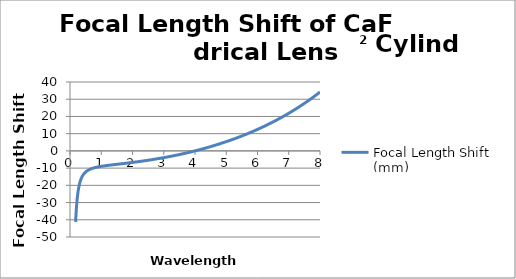
| Category | Focal Length Shift (mm) |
|---|---|
| 0.18 | -41.324 |
| 0.181 | -40.922 |
| 0.182 | -40.527 |
| 0.183 | -40.14 |
| 0.184 | -39.76 |
| 0.185 | -39.388 |
| 0.186 | -39.022 |
| 0.187 | -38.663 |
| 0.188 | -38.31 |
| 0.189 | -37.964 |
| 0.19 | -37.624 |
| 0.191 | -37.29 |
| 0.192 | -36.963 |
| 0.193 | -36.641 |
| 0.194 | -36.324 |
| 0.195 | -36.013 |
| 0.196 | -35.708 |
| 0.197 | -35.408 |
| 0.198 | -35.112 |
| 0.199 | -34.822 |
| 0.2 | -34.537 |
| 0.201 | -34.257 |
| 0.202 | -33.981 |
| 0.203 | -33.71 |
| 0.204 | -33.443 |
| 0.205 | -33.18 |
| 0.206 | -32.922 |
| 0.207 | -32.668 |
| 0.208 | -32.418 |
| 0.209 | -32.172 |
| 0.21 | -31.93 |
| 0.211 | -31.692 |
| 0.212 | -31.457 |
| 0.213 | -31.226 |
| 0.214 | -30.999 |
| 0.215 | -30.775 |
| 0.216 | -30.554 |
| 0.217 | -30.337 |
| 0.218 | -30.123 |
| 0.219 | -29.913 |
| 0.22 | -29.705 |
| 0.221 | -29.501 |
| 0.222 | -29.299 |
| 0.223 | -29.101 |
| 0.224 | -28.905 |
| 0.225 | -28.712 |
| 0.226 | -28.523 |
| 0.227 | -28.335 |
| 0.228 | -28.151 |
| 0.229 | -27.969 |
| 0.23 | -27.789 |
| 0.231 | -27.612 |
| 0.232 | -27.438 |
| 0.233 | -27.266 |
| 0.234 | -27.096 |
| 0.235 | -26.929 |
| 0.236 | -26.764 |
| 0.237 | -26.602 |
| 0.238 | -26.441 |
| 0.239 | -26.282 |
| 0.24 | -26.126 |
| 0.241 | -25.972 |
| 0.242 | -25.82 |
| 0.243 | -25.67 |
| 0.244 | -25.522 |
| 0.245 | -25.376 |
| 0.246 | -25.231 |
| 0.247 | -25.089 |
| 0.248 | -24.948 |
| 0.249 | -24.809 |
| 0.25 | -24.672 |
| 0.251 | -24.537 |
| 0.252 | -24.404 |
| 0.253 | -24.272 |
| 0.254 | -24.142 |
| 0.255 | -24.013 |
| 0.256 | -23.886 |
| 0.257 | -23.76 |
| 0.258 | -23.637 |
| 0.259 | -23.514 |
| 0.26 | -23.393 |
| 0.261 | -23.274 |
| 0.262 | -23.156 |
| 0.263 | -23.04 |
| 0.264 | -22.924 |
| 0.265 | -22.811 |
| 0.266 | -22.698 |
| 0.267 | -22.587 |
| 0.268 | -22.477 |
| 0.269 | -22.369 |
| 0.27 | -22.262 |
| 0.271 | -22.156 |
| 0.272 | -22.051 |
| 0.273 | -21.947 |
| 0.274 | -21.845 |
| 0.275 | -21.744 |
| 0.276 | -21.644 |
| 0.277 | -21.545 |
| 0.278 | -21.447 |
| 0.279 | -21.35 |
| 0.28 | -21.255 |
| 0.281 | -21.16 |
| 0.282 | -21.067 |
| 0.283 | -20.974 |
| 0.284 | -20.883 |
| 0.285 | -20.793 |
| 0.286 | -20.703 |
| 0.287 | -20.615 |
| 0.288 | -20.527 |
| 0.289 | -20.441 |
| 0.29 | -20.355 |
| 0.291 | -20.271 |
| 0.292 | -20.187 |
| 0.293 | -20.104 |
| 0.294 | -20.022 |
| 0.295 | -19.941 |
| 0.296 | -19.86 |
| 0.297 | -19.781 |
| 0.298 | -19.702 |
| 0.299 | -19.625 |
| 0.3 | -19.548 |
| 0.301 | -19.472 |
| 0.302 | -19.396 |
| 0.303 | -19.321 |
| 0.304 | -19.248 |
| 0.305 | -19.174 |
| 0.306 | -19.102 |
| 0.307 | -19.03 |
| 0.308 | -18.96 |
| 0.309 | -18.889 |
| 0.31 | -18.82 |
| 0.311 | -18.751 |
| 0.312 | -18.683 |
| 0.313 | -18.615 |
| 0.314 | -18.549 |
| 0.315 | -18.482 |
| 0.316 | -18.417 |
| 0.317 | -18.352 |
| 0.318 | -18.288 |
| 0.319 | -18.224 |
| 0.32 | -18.161 |
| 0.321 | -18.099 |
| 0.322 | -18.037 |
| 0.323 | -17.976 |
| 0.324 | -17.915 |
| 0.325 | -17.855 |
| 0.326 | -17.796 |
| 0.327 | -17.737 |
| 0.328 | -17.679 |
| 0.329 | -17.621 |
| 0.33 | -17.564 |
| 0.331 | -17.507 |
| 0.332 | -17.451 |
| 0.333 | -17.395 |
| 0.334 | -17.34 |
| 0.335 | -17.285 |
| 0.336 | -17.231 |
| 0.337 | -17.177 |
| 0.338 | -17.124 |
| 0.339 | -17.071 |
| 0.34 | -17.019 |
| 0.341 | -16.967 |
| 0.342 | -16.916 |
| 0.343 | -16.865 |
| 0.344 | -16.815 |
| 0.345 | -16.765 |
| 0.346 | -16.715 |
| 0.347 | -16.666 |
| 0.348 | -16.618 |
| 0.349 | -16.57 |
| 0.35 | -16.522 |
| 0.351 | -16.474 |
| 0.352 | -16.427 |
| 0.353 | -16.381 |
| 0.354 | -16.335 |
| 0.355 | -16.289 |
| 0.356 | -16.244 |
| 0.357 | -16.199 |
| 0.358 | -16.154 |
| 0.359 | -16.11 |
| 0.36 | -16.066 |
| 0.361 | -16.023 |
| 0.362 | -15.98 |
| 0.363 | -15.937 |
| 0.364 | -15.894 |
| 0.365 | -15.852 |
| 0.366 | -15.811 |
| 0.367 | -15.769 |
| 0.368 | -15.728 |
| 0.369 | -15.688 |
| 0.37 | -15.648 |
| 0.371 | -15.608 |
| 0.372 | -15.568 |
| 0.373 | -15.528 |
| 0.374 | -15.49 |
| 0.375 | -15.451 |
| 0.376 | -15.412 |
| 0.377 | -15.374 |
| 0.378 | -15.336 |
| 0.379 | -15.299 |
| 0.38 | -15.262 |
| 0.381 | -15.225 |
| 0.382 | -15.188 |
| 0.383 | -15.152 |
| 0.384 | -15.116 |
| 0.385 | -15.08 |
| 0.386 | -15.045 |
| 0.387 | -15.01 |
| 0.388 | -14.975 |
| 0.389 | -14.94 |
| 0.39 | -14.906 |
| 0.391 | -14.872 |
| 0.392 | -14.838 |
| 0.393 | -14.804 |
| 0.394 | -14.771 |
| 0.395 | -14.738 |
| 0.396 | -14.705 |
| 0.397 | -14.673 |
| 0.398 | -14.64 |
| 0.399 | -14.608 |
| 0.4 | -14.577 |
| 0.401 | -14.545 |
| 0.402 | -14.514 |
| 0.403 | -14.483 |
| 0.404 | -14.452 |
| 0.405 | -14.421 |
| 0.406 | -14.391 |
| 0.407 | -14.36 |
| 0.408 | -14.33 |
| 0.409 | -14.301 |
| 0.41 | -14.271 |
| 0.411 | -14.242 |
| 0.412 | -14.213 |
| 0.413 | -14.184 |
| 0.414 | -14.155 |
| 0.415 | -14.127 |
| 0.416 | -14.098 |
| 0.417 | -14.07 |
| 0.418 | -14.042 |
| 0.419 | -14.015 |
| 0.42 | -13.987 |
| 0.421 | -13.96 |
| 0.422 | -13.933 |
| 0.423 | -13.906 |
| 0.424 | -13.88 |
| 0.425 | -13.853 |
| 0.426 | -13.827 |
| 0.427 | -13.8 |
| 0.428 | -13.774 |
| 0.429 | -13.749 |
| 0.43 | -13.723 |
| 0.431 | -13.698 |
| 0.432 | -13.672 |
| 0.433 | -13.647 |
| 0.434 | -13.622 |
| 0.435 | -13.598 |
| 0.436 | -13.573 |
| 0.437 | -13.549 |
| 0.438 | -13.525 |
| 0.439 | -13.501 |
| 0.44 | -13.477 |
| 0.441 | -13.453 |
| 0.442 | -13.429 |
| 0.443 | -13.406 |
| 0.444 | -13.383 |
| 0.445 | -13.36 |
| 0.446 | -13.337 |
| 0.447 | -13.314 |
| 0.448 | -13.291 |
| 0.449 | -13.269 |
| 0.45 | -13.246 |
| 0.451 | -13.224 |
| 0.452 | -13.202 |
| 0.453 | -13.18 |
| 0.454 | -13.158 |
| 0.455 | -13.137 |
| 0.456 | -13.115 |
| 0.457 | -13.094 |
| 0.458 | -13.073 |
| 0.459 | -13.052 |
| 0.46 | -13.031 |
| 0.461 | -13.01 |
| 0.462 | -12.989 |
| 0.463 | -12.969 |
| 0.464 | -12.948 |
| 0.465 | -12.928 |
| 0.466 | -12.908 |
| 0.467 | -12.888 |
| 0.468 | -12.868 |
| 0.469 | -12.848 |
| 0.47 | -12.829 |
| 0.471 | -12.809 |
| 0.472 | -12.79 |
| 0.473 | -12.77 |
| 0.474 | -12.751 |
| 0.475 | -12.732 |
| 0.476 | -12.713 |
| 0.477 | -12.694 |
| 0.478 | -12.676 |
| 0.479 | -12.657 |
| 0.48 | -12.639 |
| 0.481 | -12.62 |
| 0.482 | -12.602 |
| 0.483 | -12.584 |
| 0.484 | -12.566 |
| 0.485 | -12.548 |
| 0.486 | -12.53 |
| 0.487 | -12.513 |
| 0.488 | -12.495 |
| 0.489 | -12.478 |
| 0.49 | -12.46 |
| 0.491 | -12.443 |
| 0.492 | -12.426 |
| 0.493 | -12.409 |
| 0.494 | -12.392 |
| 0.495 | -12.375 |
| 0.496 | -12.358 |
| 0.497 | -12.341 |
| 0.498 | -12.325 |
| 0.499 | -12.308 |
| 0.5 | -12.292 |
| 0.501 | -12.276 |
| 0.502 | -12.259 |
| 0.503 | -12.243 |
| 0.504 | -12.227 |
| 0.505 | -12.211 |
| 0.506 | -12.196 |
| 0.507 | -12.18 |
| 0.508 | -12.164 |
| 0.509 | -12.149 |
| 0.51 | -12.133 |
| 0.511 | -12.118 |
| 0.512 | -12.103 |
| 0.513 | -12.087 |
| 0.514 | -12.072 |
| 0.515 | -12.057 |
| 0.516 | -12.042 |
| 0.517 | -12.027 |
| 0.518 | -12.013 |
| 0.519 | -11.998 |
| 0.52 | -11.983 |
| 0.521 | -11.969 |
| 0.522 | -11.954 |
| 0.523 | -11.94 |
| 0.524 | -11.926 |
| 0.525 | -11.912 |
| 0.526 | -11.897 |
| 0.527 | -11.883 |
| 0.528 | -11.869 |
| 0.529 | -11.855 |
| 0.53 | -11.842 |
| 0.531 | -11.828 |
| 0.532 | -11.814 |
| 0.533 | -11.8 |
| 0.534 | -11.787 |
| 0.535 | -11.774 |
| 0.536 | -11.76 |
| 0.537 | -11.747 |
| 0.538 | -11.734 |
| 0.539 | -11.72 |
| 0.54 | -11.707 |
| 0.541 | -11.694 |
| 0.542 | -11.681 |
| 0.543 | -11.668 |
| 0.544 | -11.656 |
| 0.545 | -11.643 |
| 0.546 | -11.63 |
| 0.547 | -11.618 |
| 0.548 | -11.605 |
| 0.549 | -11.592 |
| 0.55 | -11.58 |
| 0.551 | -11.568 |
| 0.552 | -11.555 |
| 0.553 | -11.543 |
| 0.554 | -11.531 |
| 0.555 | -11.519 |
| 0.556 | -11.507 |
| 0.557 | -11.495 |
| 0.558 | -11.483 |
| 0.559 | -11.471 |
| 0.56 | -11.459 |
| 0.561 | -11.447 |
| 0.562 | -11.436 |
| 0.563 | -11.424 |
| 0.564 | -11.412 |
| 0.565 | -11.401 |
| 0.566 | -11.39 |
| 0.567 | -11.378 |
| 0.568 | -11.367 |
| 0.569 | -11.355 |
| 0.57 | -11.344 |
| 0.571 | -11.333 |
| 0.572 | -11.322 |
| 0.573 | -11.311 |
| 0.574 | -11.3 |
| 0.575 | -11.289 |
| 0.576 | -11.278 |
| 0.577 | -11.267 |
| 0.578 | -11.256 |
| 0.579 | -11.246 |
| 0.58 | -11.235 |
| 0.581 | -11.224 |
| 0.582 | -11.214 |
| 0.583 | -11.203 |
| 0.584 | -11.193 |
| 0.585 | -11.182 |
| 0.586 | -11.172 |
| 0.587 | -11.161 |
| 0.588 | -11.151 |
| 0.589 | -11.141 |
| 0.59 | -11.131 |
| 0.591 | -11.12 |
| 0.592 | -11.11 |
| 0.593 | -11.1 |
| 0.594 | -11.09 |
| 0.595 | -11.08 |
| 0.596 | -11.07 |
| 0.597 | -11.061 |
| 0.598 | -11.051 |
| 0.599 | -11.041 |
| 0.6 | -11.031 |
| 0.601 | -11.022 |
| 0.602 | -11.012 |
| 0.603 | -11.002 |
| 0.604 | -10.993 |
| 0.605 | -10.983 |
| 0.606 | -10.974 |
| 0.607 | -10.964 |
| 0.608 | -10.955 |
| 0.609 | -10.946 |
| 0.61 | -10.936 |
| 0.611 | -10.927 |
| 0.612 | -10.918 |
| 0.613 | -10.909 |
| 0.614 | -10.9 |
| 0.615 | -10.891 |
| 0.616 | -10.882 |
| 0.617 | -10.873 |
| 0.618 | -10.864 |
| 0.619 | -10.855 |
| 0.62 | -10.846 |
| 0.621 | -10.837 |
| 0.622 | -10.828 |
| 0.623 | -10.819 |
| 0.624 | -10.811 |
| 0.625 | -10.802 |
| 0.626 | -10.793 |
| 0.627 | -10.785 |
| 0.628 | -10.776 |
| 0.629 | -10.768 |
| 0.63 | -10.759 |
| 0.631 | -10.751 |
| 0.632 | -10.742 |
| 0.633 | -10.734 |
| 0.634 | -10.725 |
| 0.635 | -10.717 |
| 0.636 | -10.709 |
| 0.637 | -10.7 |
| 0.638 | -10.692 |
| 0.639 | -10.684 |
| 0.64 | -10.676 |
| 0.641 | -10.668 |
| 0.642 | -10.66 |
| 0.643 | -10.652 |
| 0.644 | -10.644 |
| 0.645 | -10.636 |
| 0.646 | -10.628 |
| 0.647 | -10.62 |
| 0.648 | -10.612 |
| 0.649 | -10.604 |
| 0.65 | -10.596 |
| 0.651 | -10.589 |
| 0.652 | -10.581 |
| 0.653 | -10.573 |
| 0.654 | -10.565 |
| 0.655 | -10.558 |
| 0.656 | -10.55 |
| 0.657 | -10.543 |
| 0.658 | -10.535 |
| 0.659 | -10.528 |
| 0.66 | -10.52 |
| 0.661 | -10.512 |
| 0.662 | -10.505 |
| 0.663 | -10.498 |
| 0.664 | -10.49 |
| 0.665 | -10.483 |
| 0.666 | -10.476 |
| 0.667 | -10.468 |
| 0.668 | -10.461 |
| 0.669 | -10.454 |
| 0.67 | -10.447 |
| 0.671 | -10.439 |
| 0.672 | -10.432 |
| 0.673 | -10.425 |
| 0.674 | -10.418 |
| 0.675 | -10.411 |
| 0.676 | -10.404 |
| 0.677 | -10.397 |
| 0.678 | -10.39 |
| 0.679 | -10.383 |
| 0.68 | -10.376 |
| 0.681 | -10.369 |
| 0.682 | -10.362 |
| 0.683 | -10.355 |
| 0.684 | -10.349 |
| 0.685 | -10.342 |
| 0.686 | -10.335 |
| 0.687 | -10.328 |
| 0.688 | -10.322 |
| 0.689 | -10.315 |
| 0.69 | -10.308 |
| 0.691 | -10.302 |
| 0.692 | -10.295 |
| 0.693 | -10.288 |
| 0.694 | -10.282 |
| 0.695 | -10.275 |
| 0.696 | -10.269 |
| 0.697 | -10.262 |
| 0.698 | -10.256 |
| 0.699 | -10.249 |
| 0.7 | -10.243 |
| 0.701 | -10.236 |
| 0.702 | -10.23 |
| 0.703 | -10.224 |
| 0.704 | -10.217 |
| 0.705 | -10.211 |
| 0.706 | -10.205 |
| 0.707 | -10.198 |
| 0.708 | -10.192 |
| 0.709 | -10.186 |
| 0.71 | -10.18 |
| 0.711 | -10.174 |
| 0.712 | -10.168 |
| 0.713 | -10.161 |
| 0.714 | -10.155 |
| 0.715 | -10.149 |
| 0.716 | -10.143 |
| 0.717 | -10.137 |
| 0.718 | -10.131 |
| 0.719 | -10.125 |
| 0.72 | -10.119 |
| 0.721 | -10.113 |
| 0.722 | -10.107 |
| 0.723 | -10.101 |
| 0.724 | -10.095 |
| 0.725 | -10.09 |
| 0.726 | -10.084 |
| 0.727 | -10.078 |
| 0.728 | -10.072 |
| 0.729 | -10.066 |
| 0.73 | -10.06 |
| 0.731 | -10.055 |
| 0.732 | -10.049 |
| 0.733 | -10.043 |
| 0.734 | -10.038 |
| 0.735 | -10.032 |
| 0.736 | -10.026 |
| 0.737 | -10.02 |
| 0.738 | -10.015 |
| 0.739 | -10.009 |
| 0.74 | -10.004 |
| 0.741 | -9.998 |
| 0.742 | -9.993 |
| 0.743 | -9.987 |
| 0.744 | -9.982 |
| 0.745 | -9.976 |
| 0.746 | -9.971 |
| 0.747 | -9.965 |
| 0.748 | -9.96 |
| 0.749 | -9.954 |
| 0.75 | -9.949 |
| 0.751 | -9.944 |
| 0.752 | -9.938 |
| 0.753 | -9.933 |
| 0.754 | -9.927 |
| 0.755 | -9.922 |
| 0.756 | -9.917 |
| 0.757 | -9.912 |
| 0.758 | -9.906 |
| 0.759 | -9.901 |
| 0.76 | -9.896 |
| 0.761 | -9.891 |
| 0.762 | -9.885 |
| 0.763 | -9.88 |
| 0.764 | -9.875 |
| 0.765 | -9.87 |
| 0.766 | -9.865 |
| 0.767 | -9.86 |
| 0.768 | -9.855 |
| 0.769 | -9.85 |
| 0.77 | -9.844 |
| 0.771 | -9.839 |
| 0.772 | -9.834 |
| 0.773 | -9.829 |
| 0.774 | -9.824 |
| 0.775 | -9.819 |
| 0.776 | -9.814 |
| 0.777 | -9.809 |
| 0.778 | -9.804 |
| 0.779 | -9.8 |
| 0.78 | -9.795 |
| 0.781 | -9.79 |
| 0.782 | -9.785 |
| 0.783 | -9.78 |
| 0.784 | -9.775 |
| 0.785 | -9.77 |
| 0.786 | -9.765 |
| 0.787 | -9.761 |
| 0.788 | -9.756 |
| 0.789 | -9.751 |
| 0.79 | -9.746 |
| 0.791 | -9.742 |
| 0.792 | -9.737 |
| 0.793 | -9.732 |
| 0.794 | -9.727 |
| 0.795 | -9.723 |
| 0.796 | -9.718 |
| 0.797 | -9.713 |
| 0.798 | -9.709 |
| 0.799 | -9.704 |
| 0.8 | -9.699 |
| 0.801 | -9.695 |
| 0.802 | -9.69 |
| 0.803 | -9.686 |
| 0.804 | -9.681 |
| 0.805 | -9.676 |
| 0.806 | -9.672 |
| 0.807 | -9.667 |
| 0.808 | -9.663 |
| 0.809 | -9.658 |
| 0.81 | -9.654 |
| 0.811 | -9.649 |
| 0.812 | -9.645 |
| 0.813 | -9.64 |
| 0.814 | -9.636 |
| 0.815 | -9.632 |
| 0.816 | -9.627 |
| 0.817 | -9.623 |
| 0.818 | -9.618 |
| 0.819 | -9.614 |
| 0.82 | -9.61 |
| 0.821 | -9.605 |
| 0.822 | -9.601 |
| 0.823 | -9.596 |
| 0.824 | -9.592 |
| 0.825 | -9.588 |
| 0.826 | -9.584 |
| 0.827 | -9.579 |
| 0.828 | -9.575 |
| 0.829 | -9.571 |
| 0.83 | -9.566 |
| 0.831 | -9.562 |
| 0.832 | -9.558 |
| 0.833 | -9.554 |
| 0.834 | -9.55 |
| 0.835 | -9.545 |
| 0.836 | -9.541 |
| 0.837 | -9.537 |
| 0.838 | -9.533 |
| 0.839 | -9.529 |
| 0.84 | -9.524 |
| 0.841 | -9.52 |
| 0.842 | -9.516 |
| 0.843 | -9.512 |
| 0.844 | -9.508 |
| 0.845 | -9.504 |
| 0.846 | -9.5 |
| 0.847 | -9.496 |
| 0.848 | -9.492 |
| 0.849 | -9.488 |
| 0.85 | -9.484 |
| 0.851 | -9.48 |
| 0.852 | -9.476 |
| 0.853 | -9.472 |
| 0.854 | -9.468 |
| 0.855 | -9.464 |
| 0.856 | -9.46 |
| 0.857 | -9.456 |
| 0.858 | -9.452 |
| 0.859 | -9.448 |
| 0.86 | -9.444 |
| 0.861 | -9.44 |
| 0.862 | -9.436 |
| 0.863 | -9.432 |
| 0.864 | -9.428 |
| 0.865 | -9.424 |
| 0.866 | -9.42 |
| 0.867 | -9.416 |
| 0.868 | -9.412 |
| 0.869 | -9.409 |
| 0.87 | -9.405 |
| 0.871 | -9.401 |
| 0.872 | -9.397 |
| 0.873 | -9.393 |
| 0.874 | -9.39 |
| 0.875 | -9.386 |
| 0.876 | -9.382 |
| 0.877 | -9.378 |
| 0.878 | -9.374 |
| 0.879 | -9.371 |
| 0.88 | -9.367 |
| 0.881 | -9.363 |
| 0.882 | -9.359 |
| 0.883 | -9.356 |
| 0.884 | -9.352 |
| 0.885 | -9.348 |
| 0.886 | -9.344 |
| 0.887 | -9.341 |
| 0.888 | -9.337 |
| 0.889 | -9.333 |
| 0.89 | -9.33 |
| 0.891 | -9.326 |
| 0.892 | -9.322 |
| 0.893 | -9.319 |
| 0.894 | -9.315 |
| 0.895 | -9.312 |
| 0.896 | -9.308 |
| 0.897 | -9.304 |
| 0.898 | -9.301 |
| 0.899 | -9.297 |
| 0.9 | -9.294 |
| 0.901 | -9.29 |
| 0.902 | -9.286 |
| 0.903 | -9.283 |
| 0.904 | -9.279 |
| 0.905 | -9.276 |
| 0.906 | -9.272 |
| 0.907 | -9.268 |
| 0.908 | -9.265 |
| 0.909 | -9.262 |
| 0.91 | -9.258 |
| 0.911 | -9.254 |
| 0.912 | -9.251 |
| 0.913 | -9.248 |
| 0.914 | -9.244 |
| 0.915 | -9.24 |
| 0.916 | -9.237 |
| 0.917 | -9.234 |
| 0.918 | -9.23 |
| 0.919 | -9.227 |
| 0.92 | -9.223 |
| 0.921 | -9.22 |
| 0.922 | -9.216 |
| 0.923 | -9.213 |
| 0.924 | -9.21 |
| 0.925 | -9.206 |
| 0.926 | -9.203 |
| 0.927 | -9.199 |
| 0.928 | -9.196 |
| 0.929 | -9.193 |
| 0.93 | -9.189 |
| 0.931 | -9.186 |
| 0.932 | -9.183 |
| 0.933 | -9.179 |
| 0.934 | -9.176 |
| 0.935 | -9.173 |
| 0.936 | -9.169 |
| 0.937 | -9.166 |
| 0.938 | -9.163 |
| 0.939 | -9.159 |
| 0.94 | -9.156 |
| 0.941 | -9.153 |
| 0.942 | -9.149 |
| 0.943 | -9.146 |
| 0.944 | -9.143 |
| 0.945 | -9.14 |
| 0.946 | -9.136 |
| 0.947 | -9.133 |
| 0.948 | -9.13 |
| 0.949 | -9.127 |
| 0.95 | -9.123 |
| 0.951 | -9.12 |
| 0.952 | -9.117 |
| 0.953 | -9.114 |
| 0.954 | -9.11 |
| 0.955 | -9.107 |
| 0.956 | -9.104 |
| 0.957 | -9.101 |
| 0.958 | -9.098 |
| 0.959 | -9.094 |
| 0.96 | -9.091 |
| 0.961 | -9.088 |
| 0.962 | -9.085 |
| 0.963 | -9.082 |
| 0.964 | -9.079 |
| 0.965 | -9.076 |
| 0.966 | -9.072 |
| 0.967 | -9.069 |
| 0.968 | -9.066 |
| 0.969 | -9.063 |
| 0.97 | -9.06 |
| 0.971 | -9.057 |
| 0.972 | -9.054 |
| 0.973 | -9.05 |
| 0.974 | -9.047 |
| 0.975 | -9.044 |
| 0.976 | -9.041 |
| 0.977 | -9.038 |
| 0.978 | -9.035 |
| 0.979 | -9.032 |
| 0.98 | -9.029 |
| 0.981 | -9.026 |
| 0.982 | -9.023 |
| 0.983 | -9.02 |
| 0.984 | -9.017 |
| 0.985 | -9.014 |
| 0.986 | -9.011 |
| 0.987 | -9.008 |
| 0.988 | -9.005 |
| 0.989 | -9.002 |
| 0.99 | -8.999 |
| 0.991 | -8.996 |
| 0.992 | -8.993 |
| 0.993 | -8.99 |
| 0.994 | -8.987 |
| 0.995 | -8.984 |
| 0.996 | -8.981 |
| 0.997 | -8.978 |
| 0.998 | -8.975 |
| 0.999 | -8.972 |
| 1.0 | -8.969 |
| 1.001 | -8.966 |
| 1.002 | -8.963 |
| 1.003 | -8.96 |
| 1.004 | -8.957 |
| 1.005 | -8.954 |
| 1.006 | -8.951 |
| 1.007 | -8.948 |
| 1.008 | -8.945 |
| 1.009 | -8.942 |
| 1.01 | -8.939 |
| 1.011 | -8.936 |
| 1.012 | -8.934 |
| 1.013 | -8.931 |
| 1.014 | -8.928 |
| 1.015 | -8.925 |
| 1.016 | -8.922 |
| 1.017 | -8.919 |
| 1.018 | -8.916 |
| 1.019 | -8.913 |
| 1.02 | -8.91 |
| 1.021 | -8.908 |
| 1.022 | -8.905 |
| 1.023 | -8.902 |
| 1.024 | -8.899 |
| 1.025 | -8.896 |
| 1.026 | -8.893 |
| 1.027 | -8.89 |
| 1.028 | -8.888 |
| 1.029 | -8.885 |
| 1.03 | -8.882 |
| 1.031 | -8.879 |
| 1.032 | -8.876 |
| 1.033 | -8.874 |
| 1.034 | -8.871 |
| 1.035 | -8.868 |
| 1.036 | -8.865 |
| 1.037 | -8.862 |
| 1.038 | -8.86 |
| 1.039 | -8.857 |
| 1.04 | -8.854 |
| 1.041 | -8.851 |
| 1.042 | -8.848 |
| 1.043 | -8.846 |
| 1.044 | -8.843 |
| 1.045 | -8.84 |
| 1.046 | -8.837 |
| 1.047 | -8.834 |
| 1.048 | -8.832 |
| 1.049 | -8.829 |
| 1.05 | -8.826 |
| 1.051 | -8.824 |
| 1.052 | -8.821 |
| 1.053 | -8.818 |
| 1.054 | -8.815 |
| 1.055 | -8.813 |
| 1.056 | -8.81 |
| 1.057 | -8.807 |
| 1.058 | -8.804 |
| 1.059 | -8.802 |
| 1.06 | -8.799 |
| 1.061 | -8.796 |
| 1.062 | -8.794 |
| 1.063 | -8.791 |
| 1.064 | -8.788 |
| 1.065 | -8.786 |
| 1.066 | -8.783 |
| 1.067 | -8.78 |
| 1.068 | -8.778 |
| 1.069 | -8.775 |
| 1.07 | -8.772 |
| 1.071 | -8.769 |
| 1.072 | -8.767 |
| 1.073 | -8.764 |
| 1.074 | -8.761 |
| 1.075 | -8.759 |
| 1.076 | -8.756 |
| 1.077 | -8.754 |
| 1.078 | -8.751 |
| 1.079 | -8.748 |
| 1.08 | -8.746 |
| 1.081 | -8.743 |
| 1.082 | -8.74 |
| 1.083 | -8.738 |
| 1.084 | -8.735 |
| 1.085 | -8.732 |
| 1.086 | -8.73 |
| 1.087 | -8.727 |
| 1.088 | -8.724 |
| 1.089 | -8.722 |
| 1.09 | -8.719 |
| 1.091 | -8.717 |
| 1.092 | -8.714 |
| 1.093 | -8.712 |
| 1.094 | -8.709 |
| 1.095 | -8.706 |
| 1.096 | -8.704 |
| 1.097 | -8.701 |
| 1.098 | -8.698 |
| 1.099 | -8.696 |
| 1.1 | -8.693 |
| 1.101 | -8.691 |
| 1.102 | -8.688 |
| 1.103 | -8.686 |
| 1.104 | -8.683 |
| 1.105 | -8.68 |
| 1.106 | -8.678 |
| 1.107 | -8.675 |
| 1.108 | -8.673 |
| 1.109 | -8.67 |
| 1.11 | -8.668 |
| 1.111 | -8.665 |
| 1.112 | -8.663 |
| 1.113 | -8.66 |
| 1.114 | -8.658 |
| 1.115 | -8.655 |
| 1.116 | -8.652 |
| 1.117 | -8.65 |
| 1.118 | -8.647 |
| 1.119 | -8.645 |
| 1.12 | -8.642 |
| 1.121 | -8.64 |
| 1.122 | -8.637 |
| 1.123 | -8.635 |
| 1.124 | -8.632 |
| 1.125 | -8.63 |
| 1.126 | -8.627 |
| 1.127 | -8.625 |
| 1.128 | -8.622 |
| 1.129 | -8.62 |
| 1.13 | -8.617 |
| 1.131 | -8.615 |
| 1.132 | -8.612 |
| 1.133 | -8.61 |
| 1.134 | -8.607 |
| 1.135 | -8.605 |
| 1.136 | -8.602 |
| 1.137 | -8.6 |
| 1.138 | -8.597 |
| 1.139 | -8.595 |
| 1.14 | -8.592 |
| 1.141 | -8.59 |
| 1.142 | -8.588 |
| 1.143 | -8.585 |
| 1.144 | -8.583 |
| 1.145 | -8.58 |
| 1.146 | -8.578 |
| 1.147 | -8.575 |
| 1.148 | -8.573 |
| 1.149 | -8.57 |
| 1.15 | -8.568 |
| 1.151 | -8.565 |
| 1.152 | -8.563 |
| 1.153 | -8.561 |
| 1.154 | -8.558 |
| 1.155 | -8.556 |
| 1.156 | -8.553 |
| 1.157 | -8.551 |
| 1.158 | -8.548 |
| 1.159 | -8.546 |
| 1.16 | -8.544 |
| 1.161 | -8.541 |
| 1.162 | -8.539 |
| 1.163 | -8.536 |
| 1.164 | -8.534 |
| 1.165 | -8.531 |
| 1.166 | -8.529 |
| 1.167 | -8.527 |
| 1.168 | -8.524 |
| 1.169 | -8.522 |
| 1.17 | -8.519 |
| 1.171 | -8.517 |
| 1.172 | -8.515 |
| 1.173 | -8.512 |
| 1.174 | -8.51 |
| 1.175 | -8.507 |
| 1.176 | -8.505 |
| 1.177 | -8.503 |
| 1.178 | -8.5 |
| 1.179 | -8.498 |
| 1.18 | -8.496 |
| 1.181 | -8.493 |
| 1.182 | -8.491 |
| 1.183 | -8.488 |
| 1.184 | -8.486 |
| 1.185 | -8.484 |
| 1.186 | -8.481 |
| 1.187 | -8.479 |
| 1.188 | -8.476 |
| 1.189 | -8.474 |
| 1.19 | -8.472 |
| 1.191 | -8.469 |
| 1.192 | -8.467 |
| 1.193 | -8.465 |
| 1.194 | -8.462 |
| 1.195 | -8.46 |
| 1.196 | -8.458 |
| 1.197 | -8.455 |
| 1.198 | -8.453 |
| 1.199 | -8.451 |
| 1.2 | -8.448 |
| 1.201 | -8.446 |
| 1.202 | -8.444 |
| 1.203 | -8.441 |
| 1.204 | -8.439 |
| 1.205 | -8.436 |
| 1.206 | -8.434 |
| 1.207 | -8.432 |
| 1.208 | -8.43 |
| 1.209 | -8.427 |
| 1.21 | -8.425 |
| 1.211 | -8.422 |
| 1.212 | -8.42 |
| 1.213 | -8.418 |
| 1.214 | -8.416 |
| 1.215 | -8.413 |
| 1.216 | -8.411 |
| 1.217 | -8.409 |
| 1.218 | -8.406 |
| 1.219 | -8.404 |
| 1.22 | -8.402 |
| 1.221 | -8.399 |
| 1.222 | -8.397 |
| 1.223 | -8.395 |
| 1.224 | -8.392 |
| 1.225 | -8.39 |
| 1.226 | -8.388 |
| 1.227 | -8.386 |
| 1.228 | -8.383 |
| 1.229 | -8.381 |
| 1.23 | -8.379 |
| 1.231 | -8.376 |
| 1.232 | -8.374 |
| 1.233 | -8.372 |
| 1.234 | -8.37 |
| 1.235 | -8.367 |
| 1.236 | -8.365 |
| 1.237 | -8.363 |
| 1.238 | -8.36 |
| 1.239 | -8.358 |
| 1.24 | -8.356 |
| 1.241 | -8.354 |
| 1.242 | -8.351 |
| 1.243 | -8.349 |
| 1.244 | -8.347 |
| 1.245 | -8.344 |
| 1.246 | -8.342 |
| 1.247 | -8.34 |
| 1.248 | -8.338 |
| 1.249 | -8.335 |
| 1.25 | -8.333 |
| 1.251 | -8.331 |
| 1.252 | -8.328 |
| 1.253 | -8.326 |
| 1.254 | -8.324 |
| 1.255 | -8.322 |
| 1.256 | -8.319 |
| 1.257 | -8.317 |
| 1.258 | -8.315 |
| 1.259 | -8.313 |
| 1.26 | -8.31 |
| 1.261 | -8.308 |
| 1.262 | -8.306 |
| 1.263 | -8.304 |
| 1.264 | -8.301 |
| 1.265 | -8.299 |
| 1.266 | -8.297 |
| 1.267 | -8.295 |
| 1.268 | -8.292 |
| 1.269 | -8.29 |
| 1.27 | -8.288 |
| 1.271 | -8.286 |
| 1.272 | -8.284 |
| 1.273 | -8.281 |
| 1.274 | -8.279 |
| 1.275 | -8.277 |
| 1.276 | -8.274 |
| 1.277 | -8.272 |
| 1.278 | -8.27 |
| 1.279 | -8.268 |
| 1.28 | -8.266 |
| 1.281 | -8.263 |
| 1.282 | -8.261 |
| 1.283 | -8.259 |
| 1.284 | -8.257 |
| 1.285 | -8.254 |
| 1.286 | -8.252 |
| 1.287 | -8.25 |
| 1.288 | -8.248 |
| 1.289 | -8.246 |
| 1.29 | -8.243 |
| 1.291 | -8.241 |
| 1.292 | -8.239 |
| 1.293 | -8.237 |
| 1.294 | -8.234 |
| 1.295 | -8.232 |
| 1.296 | -8.23 |
| 1.297 | -8.228 |
| 1.298 | -8.226 |
| 1.299 | -8.223 |
| 1.3 | -8.221 |
| 1.301 | -8.219 |
| 1.302 | -8.217 |
| 1.303 | -8.215 |
| 1.304 | -8.212 |
| 1.305 | -8.21 |
| 1.306 | -8.208 |
| 1.307 | -8.206 |
| 1.308 | -8.204 |
| 1.309 | -8.201 |
| 1.31 | -8.199 |
| 1.311 | -8.197 |
| 1.312 | -8.195 |
| 1.313 | -8.193 |
| 1.314 | -8.19 |
| 1.315 | -8.188 |
| 1.316 | -8.186 |
| 1.317 | -8.184 |
| 1.318 | -8.182 |
| 1.319 | -8.179 |
| 1.32 | -8.177 |
| 1.321 | -8.175 |
| 1.322 | -8.173 |
| 1.323 | -8.171 |
| 1.324 | -8.168 |
| 1.325 | -8.166 |
| 1.326 | -8.164 |
| 1.327 | -8.162 |
| 1.328 | -8.16 |
| 1.329 | -8.158 |
| 1.33 | -8.155 |
| 1.331 | -8.153 |
| 1.332 | -8.151 |
| 1.333 | -8.149 |
| 1.334 | -8.147 |
| 1.335 | -8.145 |
| 1.336 | -8.142 |
| 1.337 | -8.14 |
| 1.338 | -8.138 |
| 1.339 | -8.136 |
| 1.34 | -8.134 |
| 1.341 | -8.131 |
| 1.342 | -8.129 |
| 1.343 | -8.127 |
| 1.344 | -8.125 |
| 1.345 | -8.123 |
| 1.346 | -8.121 |
| 1.347 | -8.118 |
| 1.348 | -8.116 |
| 1.349 | -8.114 |
| 1.35 | -8.112 |
| 1.351 | -8.11 |
| 1.352 | -8.108 |
| 1.353 | -8.105 |
| 1.354 | -8.103 |
| 1.355 | -8.101 |
| 1.356 | -8.099 |
| 1.357 | -8.097 |
| 1.358 | -8.095 |
| 1.359 | -8.092 |
| 1.36 | -8.09 |
| 1.361 | -8.088 |
| 1.362 | -8.086 |
| 1.363 | -8.084 |
| 1.364 | -8.082 |
| 1.365 | -8.079 |
| 1.366 | -8.077 |
| 1.367 | -8.075 |
| 1.368 | -8.073 |
| 1.369 | -8.071 |
| 1.37 | -8.069 |
| 1.371 | -8.067 |
| 1.372 | -8.064 |
| 1.373 | -8.062 |
| 1.374 | -8.06 |
| 1.375 | -8.058 |
| 1.376 | -8.056 |
| 1.377 | -8.054 |
| 1.378 | -8.052 |
| 1.379 | -8.049 |
| 1.38 | -8.047 |
| 1.381 | -8.045 |
| 1.382 | -8.043 |
| 1.383 | -8.041 |
| 1.384 | -8.039 |
| 1.385 | -8.036 |
| 1.386 | -8.034 |
| 1.387 | -8.032 |
| 1.388 | -8.03 |
| 1.389 | -8.028 |
| 1.39 | -8.026 |
| 1.391 | -8.024 |
| 1.392 | -8.022 |
| 1.393 | -8.019 |
| 1.394 | -8.017 |
| 1.395 | -8.015 |
| 1.396 | -8.013 |
| 1.397 | -8.011 |
| 1.398 | -8.009 |
| 1.399 | -8.007 |
| 1.4 | -8.004 |
| 1.401 | -8.002 |
| 1.402 | -8 |
| 1.403 | -7.998 |
| 1.404 | -7.996 |
| 1.405 | -7.994 |
| 1.406 | -7.992 |
| 1.407 | -7.99 |
| 1.408 | -7.987 |
| 1.409 | -7.985 |
| 1.41 | -7.983 |
| 1.411 | -7.981 |
| 1.412 | -7.979 |
| 1.413 | -7.977 |
| 1.414 | -7.975 |
| 1.415 | -7.972 |
| 1.416 | -7.97 |
| 1.417 | -7.968 |
| 1.418 | -7.966 |
| 1.419 | -7.964 |
| 1.42 | -7.962 |
| 1.421 | -7.96 |
| 1.422 | -7.958 |
| 1.423 | -7.955 |
| 1.424 | -7.953 |
| 1.425 | -7.951 |
| 1.426 | -7.949 |
| 1.427 | -7.947 |
| 1.428 | -7.945 |
| 1.429 | -7.943 |
| 1.43 | -7.94 |
| 1.431 | -7.938 |
| 1.432 | -7.936 |
| 1.433 | -7.934 |
| 1.434 | -7.932 |
| 1.435 | -7.93 |
| 1.436 | -7.928 |
| 1.437 | -7.926 |
| 1.438 | -7.924 |
| 1.439 | -7.921 |
| 1.44 | -7.919 |
| 1.441 | -7.917 |
| 1.442 | -7.915 |
| 1.443 | -7.913 |
| 1.444 | -7.911 |
| 1.445 | -7.909 |
| 1.446 | -7.907 |
| 1.447 | -7.904 |
| 1.448 | -7.902 |
| 1.449 | -7.9 |
| 1.45 | -7.898 |
| 1.451 | -7.896 |
| 1.452 | -7.894 |
| 1.453 | -7.892 |
| 1.454 | -7.89 |
| 1.455 | -7.888 |
| 1.456 | -7.885 |
| 1.457 | -7.883 |
| 1.458 | -7.881 |
| 1.459 | -7.879 |
| 1.46 | -7.877 |
| 1.461 | -7.875 |
| 1.462 | -7.873 |
| 1.463 | -7.871 |
| 1.464 | -7.868 |
| 1.465 | -7.866 |
| 1.466 | -7.864 |
| 1.467 | -7.862 |
| 1.468 | -7.86 |
| 1.469 | -7.858 |
| 1.47 | -7.856 |
| 1.471 | -7.854 |
| 1.472 | -7.852 |
| 1.473 | -7.849 |
| 1.474 | -7.847 |
| 1.475 | -7.845 |
| 1.476 | -7.843 |
| 1.477 | -7.841 |
| 1.478 | -7.839 |
| 1.479 | -7.837 |
| 1.48 | -7.835 |
| 1.481 | -7.832 |
| 1.482 | -7.83 |
| 1.483 | -7.828 |
| 1.484 | -7.826 |
| 1.485 | -7.824 |
| 1.486 | -7.822 |
| 1.487 | -7.82 |
| 1.488 | -7.818 |
| 1.489 | -7.816 |
| 1.49 | -7.814 |
| 1.491 | -7.811 |
| 1.492 | -7.809 |
| 1.493 | -7.807 |
| 1.494 | -7.805 |
| 1.495 | -7.803 |
| 1.496 | -7.801 |
| 1.497 | -7.799 |
| 1.498 | -7.797 |
| 1.499 | -7.795 |
| 1.5 | -7.792 |
| 1.501 | -7.79 |
| 1.502 | -7.788 |
| 1.503 | -7.786 |
| 1.504 | -7.784 |
| 1.505 | -7.782 |
| 1.506 | -7.78 |
| 1.507 | -7.778 |
| 1.508 | -7.776 |
| 1.509 | -7.774 |
| 1.51 | -7.771 |
| 1.511 | -7.769 |
| 1.512 | -7.767 |
| 1.513 | -7.765 |
| 1.514 | -7.763 |
| 1.515 | -7.761 |
| 1.516 | -7.759 |
| 1.517 | -7.757 |
| 1.518 | -7.754 |
| 1.519 | -7.752 |
| 1.52 | -7.75 |
| 1.521 | -7.748 |
| 1.522 | -7.746 |
| 1.523 | -7.744 |
| 1.524 | -7.742 |
| 1.525 | -7.74 |
| 1.526 | -7.738 |
| 1.527 | -7.736 |
| 1.528 | -7.733 |
| 1.529 | -7.731 |
| 1.53 | -7.729 |
| 1.531 | -7.727 |
| 1.532 | -7.725 |
| 1.533 | -7.723 |
| 1.534 | -7.721 |
| 1.535 | -7.719 |
| 1.536 | -7.717 |
| 1.537 | -7.714 |
| 1.538 | -7.712 |
| 1.539 | -7.71 |
| 1.54 | -7.708 |
| 1.541 | -7.706 |
| 1.542 | -7.704 |
| 1.543 | -7.702 |
| 1.544 | -7.7 |
| 1.545 | -7.698 |
| 1.546 | -7.696 |
| 1.547 | -7.693 |
| 1.548 | -7.691 |
| 1.549 | -7.689 |
| 1.55 | -7.687 |
| 1.551 | -7.685 |
| 1.552 | -7.683 |
| 1.553 | -7.681 |
| 1.554 | -7.679 |
| 1.555 | -7.676 |
| 1.556 | -7.674 |
| 1.557 | -7.672 |
| 1.558 | -7.67 |
| 1.559 | -7.668 |
| 1.56 | -7.666 |
| 1.561 | -7.664 |
| 1.562 | -7.662 |
| 1.563 | -7.66 |
| 1.564 | -7.658 |
| 1.565 | -7.655 |
| 1.566 | -7.653 |
| 1.567 | -7.651 |
| 1.568 | -7.649 |
| 1.569 | -7.647 |
| 1.57 | -7.645 |
| 1.571 | -7.643 |
| 1.572 | -7.641 |
| 1.573 | -7.638 |
| 1.574 | -7.636 |
| 1.575 | -7.634 |
| 1.576 | -7.632 |
| 1.577 | -7.63 |
| 1.578 | -7.628 |
| 1.579 | -7.626 |
| 1.58 | -7.624 |
| 1.581 | -7.622 |
| 1.582 | -7.62 |
| 1.583 | -7.617 |
| 1.584 | -7.615 |
| 1.585 | -7.613 |
| 1.586 | -7.611 |
| 1.587 | -7.609 |
| 1.588 | -7.607 |
| 1.589 | -7.605 |
| 1.59 | -7.603 |
| 1.591 | -7.6 |
| 1.592 | -7.598 |
| 1.593 | -7.596 |
| 1.594 | -7.594 |
| 1.595 | -7.592 |
| 1.596 | -7.59 |
| 1.597 | -7.588 |
| 1.598 | -7.586 |
| 1.599 | -7.584 |
| 1.6 | -7.582 |
| 1.601 | -7.579 |
| 1.602 | -7.577 |
| 1.603 | -7.575 |
| 1.604 | -7.573 |
| 1.605 | -7.571 |
| 1.606 | -7.569 |
| 1.607 | -7.567 |
| 1.608 | -7.565 |
| 1.609 | -7.562 |
| 1.61 | -7.56 |
| 1.611 | -7.558 |
| 1.612 | -7.556 |
| 1.613 | -7.554 |
| 1.614 | -7.552 |
| 1.615 | -7.55 |
| 1.616 | -7.548 |
| 1.617 | -7.546 |
| 1.618 | -7.543 |
| 1.619 | -7.541 |
| 1.62 | -7.539 |
| 1.621 | -7.537 |
| 1.622 | -7.535 |
| 1.623 | -7.533 |
| 1.624 | -7.531 |
| 1.625 | -7.529 |
| 1.626 | -7.526 |
| 1.627 | -7.524 |
| 1.628 | -7.522 |
| 1.629 | -7.52 |
| 1.63 | -7.518 |
| 1.631 | -7.516 |
| 1.632 | -7.514 |
| 1.633 | -7.512 |
| 1.634 | -7.51 |
| 1.635 | -7.507 |
| 1.636 | -7.505 |
| 1.637 | -7.503 |
| 1.638 | -7.501 |
| 1.639 | -7.499 |
| 1.64 | -7.497 |
| 1.641 | -7.495 |
| 1.642 | -7.492 |
| 1.643 | -7.49 |
| 1.644 | -7.488 |
| 1.645 | -7.486 |
| 1.646 | -7.484 |
| 1.647 | -7.482 |
| 1.648 | -7.48 |
| 1.649 | -7.478 |
| 1.65 | -7.476 |
| 1.651 | -7.473 |
| 1.652 | -7.471 |
| 1.653 | -7.469 |
| 1.654 | -7.467 |
| 1.655 | -7.465 |
| 1.656 | -7.463 |
| 1.657 | -7.461 |
| 1.658 | -7.458 |
| 1.659 | -7.456 |
| 1.66 | -7.454 |
| 1.661 | -7.452 |
| 1.662 | -7.45 |
| 1.663 | -7.448 |
| 1.664 | -7.446 |
| 1.665 | -7.444 |
| 1.666 | -7.442 |
| 1.667 | -7.439 |
| 1.668 | -7.437 |
| 1.669 | -7.435 |
| 1.67 | -7.433 |
| 1.671 | -7.431 |
| 1.672 | -7.429 |
| 1.673 | -7.427 |
| 1.674 | -7.424 |
| 1.675 | -7.422 |
| 1.676 | -7.42 |
| 1.677 | -7.418 |
| 1.678 | -7.416 |
| 1.679 | -7.414 |
| 1.68 | -7.412 |
| 1.681 | -7.41 |
| 1.682 | -7.407 |
| 1.683 | -7.405 |
| 1.684 | -7.403 |
| 1.685 | -7.401 |
| 1.686 | -7.399 |
| 1.687 | -7.397 |
| 1.688 | -7.394 |
| 1.689 | -7.392 |
| 1.69 | -7.39 |
| 1.691 | -7.388 |
| 1.692 | -7.386 |
| 1.693 | -7.384 |
| 1.694 | -7.382 |
| 1.695 | -7.38 |
| 1.696 | -7.377 |
| 1.697 | -7.375 |
| 1.698 | -7.373 |
| 1.699 | -7.371 |
| 1.7 | -7.369 |
| 1.701 | -7.367 |
| 1.702 | -7.365 |
| 1.703 | -7.362 |
| 1.704 | -7.36 |
| 1.705 | -7.358 |
| 1.706 | -7.356 |
| 1.707 | -7.354 |
| 1.708 | -7.352 |
| 1.709 | -7.35 |
| 1.71 | -7.347 |
| 1.711 | -7.345 |
| 1.712 | -7.343 |
| 1.713 | -7.341 |
| 1.714 | -7.339 |
| 1.715 | -7.337 |
| 1.716 | -7.334 |
| 1.717 | -7.332 |
| 1.718 | -7.33 |
| 1.719 | -7.328 |
| 1.72 | -7.326 |
| 1.721 | -7.324 |
| 1.722 | -7.322 |
| 1.723 | -7.32 |
| 1.724 | -7.317 |
| 1.725 | -7.315 |
| 1.726 | -7.313 |
| 1.727 | -7.311 |
| 1.728 | -7.309 |
| 1.729 | -7.307 |
| 1.73 | -7.304 |
| 1.731 | -7.302 |
| 1.732 | -7.3 |
| 1.733 | -7.298 |
| 1.734 | -7.296 |
| 1.735 | -7.294 |
| 1.736 | -7.292 |
| 1.737 | -7.289 |
| 1.738 | -7.287 |
| 1.739 | -7.285 |
| 1.74 | -7.283 |
| 1.741 | -7.281 |
| 1.742 | -7.278 |
| 1.743 | -7.276 |
| 1.744 | -7.274 |
| 1.745 | -7.272 |
| 1.746 | -7.27 |
| 1.747 | -7.268 |
| 1.748 | -7.266 |
| 1.749 | -7.263 |
| 1.75 | -7.261 |
| 1.751 | -7.259 |
| 1.752 | -7.257 |
| 1.753 | -7.255 |
| 1.754 | -7.253 |
| 1.755 | -7.25 |
| 1.756 | -7.248 |
| 1.757 | -7.246 |
| 1.758 | -7.244 |
| 1.759 | -7.242 |
| 1.76 | -7.24 |
| 1.761 | -7.237 |
| 1.762 | -7.235 |
| 1.763 | -7.233 |
| 1.764 | -7.231 |
| 1.765 | -7.229 |
| 1.766 | -7.227 |
| 1.767 | -7.224 |
| 1.768 | -7.222 |
| 1.769 | -7.22 |
| 1.77 | -7.218 |
| 1.771 | -7.216 |
| 1.772 | -7.214 |
| 1.773 | -7.211 |
| 1.774 | -7.209 |
| 1.775 | -7.207 |
| 1.776 | -7.205 |
| 1.777 | -7.203 |
| 1.778 | -7.2 |
| 1.779 | -7.198 |
| 1.78 | -7.196 |
| 1.781 | -7.194 |
| 1.782 | -7.192 |
| 1.783 | -7.19 |
| 1.784 | -7.187 |
| 1.785 | -7.185 |
| 1.786 | -7.183 |
| 1.787 | -7.181 |
| 1.788 | -7.179 |
| 1.789 | -7.176 |
| 1.79 | -7.174 |
| 1.791 | -7.172 |
| 1.792 | -7.17 |
| 1.793 | -7.168 |
| 1.794 | -7.166 |
| 1.795 | -7.163 |
| 1.796 | -7.161 |
| 1.797 | -7.159 |
| 1.798 | -7.157 |
| 1.799 | -7.155 |
| 1.8 | -7.152 |
| 1.801 | -7.15 |
| 1.802 | -7.148 |
| 1.803 | -7.146 |
| 1.804 | -7.144 |
| 1.805 | -7.142 |
| 1.806 | -7.139 |
| 1.807 | -7.137 |
| 1.808 | -7.135 |
| 1.809 | -7.133 |
| 1.81 | -7.131 |
| 1.811 | -7.128 |
| 1.812 | -7.126 |
| 1.813 | -7.124 |
| 1.814 | -7.122 |
| 1.815 | -7.12 |
| 1.816 | -7.117 |
| 1.817 | -7.115 |
| 1.818 | -7.113 |
| 1.819 | -7.111 |
| 1.82 | -7.109 |
| 1.821 | -7.106 |
| 1.822 | -7.104 |
| 1.823 | -7.102 |
| 1.824 | -7.1 |
| 1.825 | -7.098 |
| 1.826 | -7.095 |
| 1.827 | -7.093 |
| 1.828 | -7.091 |
| 1.829 | -7.089 |
| 1.83 | -7.087 |
| 1.831 | -7.084 |
| 1.832 | -7.082 |
| 1.833 | -7.08 |
| 1.834 | -7.078 |
| 1.835 | -7.076 |
| 1.836 | -7.073 |
| 1.837 | -7.071 |
| 1.838 | -7.069 |
| 1.839 | -7.067 |
| 1.84 | -7.065 |
| 1.841 | -7.062 |
| 1.842 | -7.06 |
| 1.843 | -7.058 |
| 1.844 | -7.056 |
| 1.845 | -7.054 |
| 1.846 | -7.051 |
| 1.847 | -7.049 |
| 1.848 | -7.047 |
| 1.849 | -7.045 |
| 1.85 | -7.042 |
| 1.851 | -7.04 |
| 1.852 | -7.038 |
| 1.853 | -7.036 |
| 1.854 | -7.034 |
| 1.855 | -7.031 |
| 1.856 | -7.029 |
| 1.857 | -7.027 |
| 1.858 | -7.025 |
| 1.859 | -7.022 |
| 1.86 | -7.02 |
| 1.861 | -7.018 |
| 1.862 | -7.016 |
| 1.863 | -7.014 |
| 1.864 | -7.011 |
| 1.865 | -7.009 |
| 1.866 | -7.007 |
| 1.867 | -7.005 |
| 1.868 | -7.002 |
| 1.869 | -7 |
| 1.87 | -6.998 |
| 1.871 | -6.996 |
| 1.872 | -6.994 |
| 1.873 | -6.991 |
| 1.874 | -6.989 |
| 1.875 | -6.987 |
| 1.876 | -6.985 |
| 1.877 | -6.982 |
| 1.878 | -6.98 |
| 1.879 | -6.978 |
| 1.88 | -6.976 |
| 1.881 | -6.974 |
| 1.882 | -6.971 |
| 1.883 | -6.969 |
| 1.884 | -6.967 |
| 1.885 | -6.964 |
| 1.886 | -6.962 |
| 1.887 | -6.96 |
| 1.888 | -6.958 |
| 1.889 | -6.956 |
| 1.89 | -6.953 |
| 1.891 | -6.951 |
| 1.892 | -6.949 |
| 1.893 | -6.947 |
| 1.894 | -6.944 |
| 1.895 | -6.942 |
| 1.896 | -6.94 |
| 1.897 | -6.938 |
| 1.898 | -6.935 |
| 1.899 | -6.933 |
| 1.9 | -6.931 |
| 1.901 | -6.929 |
| 1.902 | -6.926 |
| 1.903 | -6.924 |
| 1.904 | -6.922 |
| 1.905 | -6.92 |
| 1.906 | -6.917 |
| 1.907 | -6.915 |
| 1.908 | -6.913 |
| 1.909 | -6.911 |
| 1.91 | -6.908 |
| 1.911 | -6.906 |
| 1.912 | -6.904 |
| 1.913 | -6.902 |
| 1.914 | -6.899 |
| 1.915 | -6.897 |
| 1.916 | -6.895 |
| 1.917 | -6.893 |
| 1.918 | -6.89 |
| 1.919 | -6.888 |
| 1.92 | -6.886 |
| 1.921 | -6.884 |
| 1.922 | -6.881 |
| 1.923 | -6.879 |
| 1.924 | -6.877 |
| 1.925 | -6.874 |
| 1.926 | -6.872 |
| 1.927 | -6.87 |
| 1.928 | -6.868 |
| 1.929 | -6.866 |
| 1.93 | -6.863 |
| 1.931 | -6.861 |
| 1.932 | -6.859 |
| 1.933 | -6.856 |
| 1.934 | -6.854 |
| 1.935 | -6.852 |
| 1.936 | -6.85 |
| 1.937 | -6.847 |
| 1.938 | -6.845 |
| 1.939 | -6.843 |
| 1.94 | -6.84 |
| 1.941 | -6.838 |
| 1.942 | -6.836 |
| 1.943 | -6.834 |
| 1.944 | -6.831 |
| 1.945 | -6.829 |
| 1.946 | -6.827 |
| 1.947 | -6.825 |
| 1.948 | -6.822 |
| 1.949 | -6.82 |
| 1.95 | -6.818 |
| 1.951 | -6.816 |
| 1.952 | -6.813 |
| 1.953 | -6.811 |
| 1.954 | -6.809 |
| 1.955 | -6.806 |
| 1.956 | -6.804 |
| 1.957 | -6.802 |
| 1.958 | -6.8 |
| 1.959 | -6.797 |
| 1.96 | -6.795 |
| 1.961 | -6.793 |
| 1.962 | -6.79 |
| 1.963 | -6.788 |
| 1.964 | -6.786 |
| 1.965 | -6.784 |
| 1.966 | -6.781 |
| 1.967 | -6.779 |
| 1.968 | -6.777 |
| 1.969 | -6.774 |
| 1.97 | -6.772 |
| 1.971 | -6.77 |
| 1.972 | -6.767 |
| 1.973 | -6.765 |
| 1.974 | -6.763 |
| 1.975 | -6.76 |
| 1.976 | -6.758 |
| 1.977 | -6.756 |
| 1.978 | -6.754 |
| 1.979 | -6.751 |
| 1.98 | -6.749 |
| 1.981 | -6.747 |
| 1.982 | -6.744 |
| 1.983 | -6.742 |
| 1.984 | -6.74 |
| 1.985 | -6.738 |
| 1.986 | -6.735 |
| 1.987 | -6.733 |
| 1.988 | -6.731 |
| 1.989 | -6.728 |
| 1.99 | -6.726 |
| 1.991 | -6.724 |
| 1.992 | -6.721 |
| 1.993 | -6.719 |
| 1.994 | -6.717 |
| 1.995 | -6.714 |
| 1.996 | -6.712 |
| 1.997 | -6.71 |
| 1.998 | -6.708 |
| 1.999 | -6.705 |
| 2.0 | -6.703 |
| 2.001 | -6.701 |
| 2.002 | -6.698 |
| 2.003 | -6.696 |
| 2.004 | -6.694 |
| 2.005 | -6.691 |
| 2.006 | -6.689 |
| 2.007 | -6.687 |
| 2.008 | -6.684 |
| 2.009 | -6.682 |
| 2.01 | -6.68 |
| 2.011 | -6.677 |
| 2.012 | -6.675 |
| 2.013 | -6.673 |
| 2.014 | -6.67 |
| 2.015 | -6.668 |
| 2.016 | -6.666 |
| 2.017 | -6.663 |
| 2.018 | -6.661 |
| 2.019 | -6.659 |
| 2.02 | -6.656 |
| 2.021 | -6.654 |
| 2.022 | -6.652 |
| 2.023 | -6.649 |
| 2.024 | -6.647 |
| 2.025 | -6.645 |
| 2.026 | -6.642 |
| 2.027 | -6.64 |
| 2.028 | -6.638 |
| 2.029 | -6.635 |
| 2.03 | -6.633 |
| 2.031 | -6.631 |
| 2.032 | -6.628 |
| 2.033 | -6.626 |
| 2.034 | -6.624 |
| 2.035 | -6.621 |
| 2.036 | -6.619 |
| 2.037 | -6.617 |
| 2.038 | -6.614 |
| 2.039 | -6.612 |
| 2.04 | -6.61 |
| 2.041 | -6.607 |
| 2.042 | -6.605 |
| 2.043 | -6.603 |
| 2.044 | -6.6 |
| 2.045 | -6.598 |
| 2.046 | -6.596 |
| 2.047 | -6.593 |
| 2.048 | -6.591 |
| 2.049 | -6.588 |
| 2.05 | -6.586 |
| 2.051 | -6.584 |
| 2.052 | -6.581 |
| 2.053 | -6.579 |
| 2.054 | -6.577 |
| 2.055 | -6.574 |
| 2.056 | -6.572 |
| 2.057 | -6.57 |
| 2.058 | -6.567 |
| 2.059 | -6.565 |
| 2.06 | -6.563 |
| 2.061 | -6.56 |
| 2.062 | -6.558 |
| 2.063 | -6.556 |
| 2.064 | -6.553 |
| 2.065 | -6.551 |
| 2.066 | -6.548 |
| 2.067 | -6.546 |
| 2.068 | -6.544 |
| 2.069 | -6.541 |
| 2.07 | -6.539 |
| 2.071 | -6.536 |
| 2.072 | -6.534 |
| 2.073 | -6.532 |
| 2.074 | -6.529 |
| 2.075 | -6.527 |
| 2.076 | -6.525 |
| 2.077 | -6.522 |
| 2.078 | -6.52 |
| 2.079 | -6.518 |
| 2.08 | -6.515 |
| 2.081 | -6.513 |
| 2.082 | -6.51 |
| 2.083 | -6.508 |
| 2.084 | -6.506 |
| 2.085 | -6.503 |
| 2.086 | -6.501 |
| 2.087 | -6.498 |
| 2.088 | -6.496 |
| 2.089 | -6.494 |
| 2.09 | -6.491 |
| 2.091 | -6.489 |
| 2.092 | -6.487 |
| 2.093 | -6.484 |
| 2.094 | -6.482 |
| 2.095 | -6.479 |
| 2.096 | -6.477 |
| 2.097 | -6.475 |
| 2.098 | -6.472 |
| 2.099 | -6.47 |
| 2.1 | -6.468 |
| 2.101 | -6.465 |
| 2.102 | -6.463 |
| 2.103 | -6.46 |
| 2.104 | -6.458 |
| 2.105 | -6.456 |
| 2.106 | -6.453 |
| 2.107 | -6.451 |
| 2.108 | -6.448 |
| 2.109 | -6.446 |
| 2.11 | -6.444 |
| 2.111 | -6.441 |
| 2.112 | -6.439 |
| 2.113 | -6.436 |
| 2.114 | -6.434 |
| 2.115 | -6.432 |
| 2.116 | -6.429 |
| 2.117 | -6.427 |
| 2.118 | -6.424 |
| 2.119 | -6.422 |
| 2.12 | -6.419 |
| 2.121 | -6.417 |
| 2.122 | -6.415 |
| 2.123 | -6.412 |
| 2.124 | -6.41 |
| 2.125 | -6.407 |
| 2.126 | -6.405 |
| 2.127 | -6.403 |
| 2.128 | -6.4 |
| 2.129 | -6.398 |
| 2.13 | -6.395 |
| 2.131 | -6.393 |
| 2.132 | -6.39 |
| 2.133 | -6.388 |
| 2.134 | -6.386 |
| 2.135 | -6.383 |
| 2.136 | -6.381 |
| 2.137 | -6.378 |
| 2.138 | -6.376 |
| 2.139 | -6.374 |
| 2.14 | -6.371 |
| 2.141 | -6.369 |
| 2.142 | -6.366 |
| 2.143 | -6.364 |
| 2.144 | -6.361 |
| 2.145 | -6.359 |
| 2.146 | -6.356 |
| 2.147 | -6.354 |
| 2.148 | -6.352 |
| 2.149 | -6.349 |
| 2.15 | -6.347 |
| 2.151 | -6.344 |
| 2.152 | -6.342 |
| 2.153 | -6.34 |
| 2.154 | -6.337 |
| 2.155 | -6.335 |
| 2.156 | -6.332 |
| 2.157 | -6.33 |
| 2.158 | -6.327 |
| 2.159 | -6.325 |
| 2.16 | -6.322 |
| 2.161 | -6.32 |
| 2.162 | -6.318 |
| 2.163 | -6.315 |
| 2.164 | -6.313 |
| 2.165 | -6.31 |
| 2.166 | -6.308 |
| 2.167 | -6.305 |
| 2.168 | -6.303 |
| 2.169 | -6.3 |
| 2.17 | -6.298 |
| 2.171 | -6.296 |
| 2.172 | -6.293 |
| 2.173 | -6.291 |
| 2.174 | -6.288 |
| 2.175 | -6.286 |
| 2.176 | -6.283 |
| 2.177 | -6.281 |
| 2.178 | -6.278 |
| 2.179 | -6.276 |
| 2.18 | -6.273 |
| 2.181 | -6.271 |
| 2.182 | -6.268 |
| 2.183 | -6.266 |
| 2.184 | -6.264 |
| 2.185 | -6.261 |
| 2.186 | -6.259 |
| 2.187 | -6.256 |
| 2.188 | -6.254 |
| 2.189 | -6.251 |
| 2.19 | -6.249 |
| 2.191 | -6.246 |
| 2.192 | -6.244 |
| 2.193 | -6.241 |
| 2.194 | -6.239 |
| 2.195 | -6.236 |
| 2.196 | -6.234 |
| 2.197 | -6.231 |
| 2.198 | -6.229 |
| 2.199 | -6.226 |
| 2.2 | -6.224 |
| 2.201 | -6.222 |
| 2.202 | -6.219 |
| 2.203 | -6.216 |
| 2.204 | -6.214 |
| 2.205 | -6.212 |
| 2.206 | -6.209 |
| 2.207 | -6.207 |
| 2.208 | -6.204 |
| 2.209 | -6.202 |
| 2.21 | -6.199 |
| 2.211 | -6.197 |
| 2.212 | -6.194 |
| 2.213 | -6.192 |
| 2.214 | -6.189 |
| 2.215 | -6.187 |
| 2.216 | -6.184 |
| 2.217 | -6.182 |
| 2.218 | -6.179 |
| 2.219 | -6.177 |
| 2.22 | -6.174 |
| 2.221 | -6.172 |
| 2.222 | -6.169 |
| 2.223 | -6.167 |
| 2.224 | -6.164 |
| 2.225 | -6.162 |
| 2.226 | -6.159 |
| 2.227 | -6.157 |
| 2.228 | -6.154 |
| 2.229 | -6.152 |
| 2.23 | -6.149 |
| 2.231 | -6.147 |
| 2.232 | -6.144 |
| 2.233 | -6.142 |
| 2.234 | -6.139 |
| 2.235 | -6.137 |
| 2.236 | -6.134 |
| 2.237 | -6.132 |
| 2.238 | -6.129 |
| 2.239 | -6.127 |
| 2.24 | -6.124 |
| 2.241 | -6.122 |
| 2.242 | -6.119 |
| 2.243 | -6.117 |
| 2.244 | -6.114 |
| 2.245 | -6.112 |
| 2.246 | -6.109 |
| 2.247 | -6.107 |
| 2.248 | -6.104 |
| 2.249 | -6.102 |
| 2.25 | -6.099 |
| 2.251 | -6.096 |
| 2.252 | -6.094 |
| 2.253 | -6.091 |
| 2.254 | -6.089 |
| 2.255 | -6.086 |
| 2.256 | -6.084 |
| 2.257 | -6.081 |
| 2.258 | -6.079 |
| 2.259 | -6.076 |
| 2.26 | -6.074 |
| 2.261 | -6.071 |
| 2.262 | -6.069 |
| 2.263 | -6.066 |
| 2.264 | -6.064 |
| 2.265 | -6.061 |
| 2.266 | -6.058 |
| 2.267 | -6.056 |
| 2.268 | -6.053 |
| 2.269 | -6.051 |
| 2.27 | -6.048 |
| 2.271 | -6.046 |
| 2.272 | -6.043 |
| 2.273 | -6.041 |
| 2.274 | -6.038 |
| 2.275 | -6.036 |
| 2.276 | -6.033 |
| 2.277 | -6.031 |
| 2.278 | -6.028 |
| 2.279 | -6.026 |
| 2.28 | -6.023 |
| 2.281 | -6.02 |
| 2.282 | -6.018 |
| 2.283 | -6.015 |
| 2.284 | -6.013 |
| 2.285 | -6.01 |
| 2.286 | -6.008 |
| 2.287 | -6.005 |
| 2.288 | -6.002 |
| 2.289 | -6 |
| 2.29 | -5.997 |
| 2.291 | -5.995 |
| 2.292 | -5.992 |
| 2.293 | -5.99 |
| 2.294 | -5.987 |
| 2.295 | -5.985 |
| 2.296 | -5.982 |
| 2.297 | -5.979 |
| 2.298 | -5.977 |
| 2.299 | -5.974 |
| 2.3 | -5.972 |
| 2.301 | -5.969 |
| 2.302 | -5.967 |
| 2.303 | -5.964 |
| 2.304 | -5.962 |
| 2.305 | -5.959 |
| 2.306 | -5.956 |
| 2.307 | -5.954 |
| 2.308 | -5.951 |
| 2.309 | -5.949 |
| 2.31 | -5.946 |
| 2.311 | -5.943 |
| 2.312 | -5.941 |
| 2.313 | -5.938 |
| 2.314 | -5.936 |
| 2.315 | -5.933 |
| 2.316 | -5.93 |
| 2.317 | -5.928 |
| 2.318 | -5.925 |
| 2.319 | -5.923 |
| 2.32 | -5.92 |
| 2.321 | -5.918 |
| 2.322 | -5.915 |
| 2.323 | -5.912 |
| 2.324 | -5.91 |
| 2.325 | -5.907 |
| 2.326 | -5.905 |
| 2.327 | -5.902 |
| 2.328 | -5.9 |
| 2.329 | -5.897 |
| 2.33 | -5.894 |
| 2.331 | -5.892 |
| 2.332 | -5.889 |
| 2.333 | -5.886 |
| 2.334 | -5.884 |
| 2.335 | -5.881 |
| 2.336 | -5.879 |
| 2.337 | -5.876 |
| 2.338 | -5.874 |
| 2.339 | -5.871 |
| 2.34 | -5.868 |
| 2.341 | -5.866 |
| 2.342 | -5.863 |
| 2.343 | -5.86 |
| 2.344 | -5.858 |
| 2.345 | -5.855 |
| 2.346 | -5.853 |
| 2.347 | -5.85 |
| 2.348 | -5.847 |
| 2.349 | -5.845 |
| 2.35 | -5.842 |
| 2.351 | -5.84 |
| 2.352 | -5.837 |
| 2.353 | -5.834 |
| 2.354 | -5.832 |
| 2.355 | -5.829 |
| 2.356 | -5.826 |
| 2.357 | -5.824 |
| 2.358 | -5.821 |
| 2.359 | -5.819 |
| 2.36 | -5.816 |
| 2.361 | -5.813 |
| 2.362 | -5.811 |
| 2.363 | -5.808 |
| 2.364 | -5.806 |
| 2.365 | -5.803 |
| 2.366 | -5.8 |
| 2.367 | -5.798 |
| 2.368 | -5.795 |
| 2.369 | -5.792 |
| 2.37 | -5.79 |
| 2.371 | -5.787 |
| 2.372 | -5.784 |
| 2.373 | -5.782 |
| 2.374 | -5.779 |
| 2.375 | -5.776 |
| 2.376 | -5.774 |
| 2.377 | -5.771 |
| 2.378 | -5.769 |
| 2.379 | -5.766 |
| 2.38 | -5.763 |
| 2.381 | -5.761 |
| 2.382 | -5.758 |
| 2.383 | -5.755 |
| 2.384 | -5.753 |
| 2.385 | -5.75 |
| 2.386 | -5.747 |
| 2.387 | -5.745 |
| 2.388 | -5.742 |
| 2.389 | -5.74 |
| 2.39 | -5.737 |
| 2.391 | -5.734 |
| 2.392 | -5.732 |
| 2.393 | -5.729 |
| 2.394 | -5.726 |
| 2.395 | -5.724 |
| 2.396 | -5.721 |
| 2.397 | -5.718 |
| 2.398 | -5.716 |
| 2.399 | -5.713 |
| 2.4 | -5.71 |
| 2.401 | -5.708 |
| 2.402 | -5.705 |
| 2.403 | -5.702 |
| 2.404 | -5.7 |
| 2.405 | -5.697 |
| 2.406 | -5.694 |
| 2.407 | -5.692 |
| 2.408 | -5.689 |
| 2.409 | -5.686 |
| 2.41 | -5.684 |
| 2.411 | -5.681 |
| 2.412 | -5.678 |
| 2.413 | -5.676 |
| 2.414 | -5.673 |
| 2.415 | -5.67 |
| 2.416 | -5.668 |
| 2.417 | -5.665 |
| 2.418 | -5.662 |
| 2.419 | -5.66 |
| 2.42 | -5.657 |
| 2.421 | -5.654 |
| 2.422 | -5.651 |
| 2.423 | -5.649 |
| 2.424 | -5.646 |
| 2.425 | -5.643 |
| 2.426 | -5.641 |
| 2.427 | -5.638 |
| 2.428 | -5.635 |
| 2.429 | -5.633 |
| 2.43 | -5.63 |
| 2.431 | -5.627 |
| 2.432 | -5.625 |
| 2.433 | -5.622 |
| 2.434 | -5.619 |
| 2.435 | -5.616 |
| 2.436 | -5.614 |
| 2.437 | -5.611 |
| 2.438 | -5.608 |
| 2.439 | -5.606 |
| 2.44 | -5.603 |
| 2.441 | -5.6 |
| 2.442 | -5.598 |
| 2.443 | -5.595 |
| 2.444 | -5.592 |
| 2.445 | -5.589 |
| 2.446 | -5.587 |
| 2.447 | -5.584 |
| 2.448 | -5.581 |
| 2.449 | -5.579 |
| 2.45 | -5.576 |
| 2.451 | -5.573 |
| 2.452 | -5.57 |
| 2.453 | -5.568 |
| 2.454 | -5.565 |
| 2.455 | -5.562 |
| 2.456 | -5.56 |
| 2.457 | -5.557 |
| 2.458 | -5.554 |
| 2.459 | -5.552 |
| 2.46 | -5.549 |
| 2.461 | -5.546 |
| 2.462 | -5.543 |
| 2.463 | -5.541 |
| 2.464 | -5.538 |
| 2.465 | -5.535 |
| 2.466 | -5.532 |
| 2.467 | -5.53 |
| 2.468 | -5.527 |
| 2.469 | -5.524 |
| 2.47 | -5.522 |
| 2.471 | -5.519 |
| 2.472 | -5.516 |
| 2.473 | -5.513 |
| 2.474 | -5.51 |
| 2.475 | -5.508 |
| 2.476 | -5.505 |
| 2.477 | -5.502 |
| 2.478 | -5.5 |
| 2.479 | -5.497 |
| 2.48 | -5.494 |
| 2.481 | -5.491 |
| 2.482 | -5.489 |
| 2.483 | -5.486 |
| 2.484 | -5.483 |
| 2.485 | -5.48 |
| 2.486 | -5.478 |
| 2.487 | -5.475 |
| 2.488 | -5.472 |
| 2.489 | -5.469 |
| 2.49 | -5.467 |
| 2.491 | -5.464 |
| 2.492 | -5.461 |
| 2.493 | -5.458 |
| 2.494 | -5.456 |
| 2.495 | -5.453 |
| 2.496 | -5.45 |
| 2.497 | -5.447 |
| 2.498 | -5.445 |
| 2.499 | -5.442 |
| 2.5 | -5.439 |
| 2.501 | -5.436 |
| 2.502 | -5.434 |
| 2.503 | -5.431 |
| 2.504 | -5.428 |
| 2.505 | -5.425 |
| 2.506 | -5.422 |
| 2.507 | -5.42 |
| 2.508 | -5.417 |
| 2.509 | -5.414 |
| 2.51 | -5.411 |
| 2.511 | -5.409 |
| 2.512 | -5.406 |
| 2.513 | -5.403 |
| 2.514 | -5.4 |
| 2.515 | -5.398 |
| 2.516 | -5.395 |
| 2.517 | -5.392 |
| 2.518 | -5.389 |
| 2.519 | -5.386 |
| 2.52 | -5.384 |
| 2.521 | -5.381 |
| 2.522 | -5.378 |
| 2.523 | -5.375 |
| 2.524 | -5.372 |
| 2.525 | -5.37 |
| 2.526 | -5.367 |
| 2.527 | -5.364 |
| 2.528 | -5.361 |
| 2.529 | -5.358 |
| 2.53 | -5.356 |
| 2.531 | -5.353 |
| 2.532 | -5.35 |
| 2.533 | -5.347 |
| 2.534 | -5.345 |
| 2.535 | -5.342 |
| 2.536 | -5.339 |
| 2.537 | -5.336 |
| 2.538 | -5.333 |
| 2.539 | -5.331 |
| 2.54 | -5.328 |
| 2.541 | -5.325 |
| 2.542 | -5.322 |
| 2.543 | -5.319 |
| 2.544 | -5.317 |
| 2.545 | -5.314 |
| 2.546 | -5.311 |
| 2.547 | -5.308 |
| 2.548 | -5.305 |
| 2.549 | -5.302 |
| 2.55 | -5.3 |
| 2.551 | -5.297 |
| 2.552 | -5.294 |
| 2.553 | -5.291 |
| 2.554 | -5.288 |
| 2.555 | -5.286 |
| 2.556 | -5.283 |
| 2.557 | -5.28 |
| 2.558 | -5.277 |
| 2.559 | -5.274 |
| 2.56 | -5.272 |
| 2.561 | -5.269 |
| 2.562 | -5.266 |
| 2.563 | -5.263 |
| 2.564 | -5.26 |
| 2.565 | -5.257 |
| 2.566 | -5.255 |
| 2.567 | -5.252 |
| 2.568 | -5.249 |
| 2.569 | -5.246 |
| 2.57 | -5.243 |
| 2.571 | -5.24 |
| 2.572 | -5.238 |
| 2.573 | -5.235 |
| 2.574 | -5.232 |
| 2.575 | -5.229 |
| 2.576 | -5.226 |
| 2.577 | -5.223 |
| 2.578 | -5.22 |
| 2.579 | -5.218 |
| 2.58 | -5.215 |
| 2.581 | -5.212 |
| 2.582 | -5.209 |
| 2.583 | -5.206 |
| 2.584 | -5.204 |
| 2.585 | -5.201 |
| 2.586 | -5.198 |
| 2.587 | -5.195 |
| 2.588 | -5.192 |
| 2.589 | -5.189 |
| 2.59 | -5.186 |
| 2.591 | -5.184 |
| 2.592 | -5.181 |
| 2.593 | -5.178 |
| 2.594 | -5.175 |
| 2.595 | -5.172 |
| 2.596 | -5.169 |
| 2.597 | -5.166 |
| 2.598 | -5.164 |
| 2.599 | -5.161 |
| 2.6 | -5.158 |
| 2.601 | -5.155 |
| 2.602 | -5.152 |
| 2.603 | -5.149 |
| 2.604 | -5.146 |
| 2.605 | -5.143 |
| 2.606 | -5.141 |
| 2.607 | -5.138 |
| 2.608 | -5.135 |
| 2.609 | -5.132 |
| 2.61 | -5.129 |
| 2.611 | -5.126 |
| 2.612 | -5.123 |
| 2.613 | -5.12 |
| 2.614 | -5.118 |
| 2.615 | -5.115 |
| 2.616 | -5.112 |
| 2.617 | -5.109 |
| 2.618 | -5.106 |
| 2.619 | -5.103 |
| 2.62 | -5.1 |
| 2.621 | -5.097 |
| 2.622 | -5.094 |
| 2.623 | -5.092 |
| 2.624 | -5.089 |
| 2.625 | -5.086 |
| 2.626 | -5.083 |
| 2.627 | -5.08 |
| 2.628 | -5.077 |
| 2.629 | -5.074 |
| 2.63 | -5.071 |
| 2.631 | -5.068 |
| 2.632 | -5.066 |
| 2.633 | -5.063 |
| 2.634 | -5.06 |
| 2.635 | -5.057 |
| 2.636 | -5.054 |
| 2.637 | -5.051 |
| 2.638 | -5.048 |
| 2.639 | -5.045 |
| 2.64 | -5.042 |
| 2.641 | -5.039 |
| 2.642 | -5.036 |
| 2.643 | -5.034 |
| 2.644 | -5.031 |
| 2.645 | -5.028 |
| 2.646 | -5.025 |
| 2.647 | -5.022 |
| 2.648 | -5.019 |
| 2.649 | -5.016 |
| 2.65 | -5.013 |
| 2.651 | -5.01 |
| 2.652 | -5.007 |
| 2.653 | -5.004 |
| 2.654 | -5.002 |
| 2.655 | -4.999 |
| 2.656 | -4.996 |
| 2.657 | -4.993 |
| 2.658 | -4.99 |
| 2.659 | -4.987 |
| 2.66 | -4.984 |
| 2.661 | -4.981 |
| 2.662 | -4.978 |
| 2.663 | -4.975 |
| 2.664 | -4.972 |
| 2.665 | -4.969 |
| 2.666 | -4.966 |
| 2.667 | -4.964 |
| 2.668 | -4.96 |
| 2.669 | -4.958 |
| 2.67 | -4.955 |
| 2.671 | -4.952 |
| 2.672 | -4.949 |
| 2.673 | -4.946 |
| 2.674 | -4.943 |
| 2.675 | -4.94 |
| 2.676 | -4.937 |
| 2.677 | -4.934 |
| 2.678 | -4.931 |
| 2.679 | -4.928 |
| 2.68 | -4.925 |
| 2.681 | -4.922 |
| 2.682 | -4.919 |
| 2.683 | -4.916 |
| 2.684 | -4.913 |
| 2.685 | -4.91 |
| 2.686 | -4.908 |
| 2.687 | -4.905 |
| 2.688 | -4.902 |
| 2.689 | -4.899 |
| 2.69 | -4.896 |
| 2.691 | -4.893 |
| 2.692 | -4.89 |
| 2.693 | -4.887 |
| 2.694 | -4.884 |
| 2.695 | -4.881 |
| 2.696 | -4.878 |
| 2.697 | -4.875 |
| 2.698 | -4.872 |
| 2.699 | -4.869 |
| 2.7 | -4.866 |
| 2.701 | -4.863 |
| 2.702 | -4.86 |
| 2.703 | -4.857 |
| 2.704 | -4.854 |
| 2.705 | -4.851 |
| 2.706 | -4.848 |
| 2.707 | -4.845 |
| 2.708 | -4.842 |
| 2.709 | -4.839 |
| 2.71 | -4.836 |
| 2.711 | -4.833 |
| 2.712 | -4.83 |
| 2.713 | -4.827 |
| 2.714 | -4.824 |
| 2.715 | -4.821 |
| 2.716 | -4.818 |
| 2.717 | -4.815 |
| 2.718 | -4.812 |
| 2.719 | -4.809 |
| 2.72 | -4.806 |
| 2.721 | -4.803 |
| 2.722 | -4.8 |
| 2.723 | -4.797 |
| 2.724 | -4.794 |
| 2.725 | -4.791 |
| 2.726 | -4.788 |
| 2.727 | -4.785 |
| 2.728 | -4.782 |
| 2.729 | -4.779 |
| 2.73 | -4.776 |
| 2.731 | -4.773 |
| 2.732 | -4.77 |
| 2.733 | -4.767 |
| 2.734 | -4.764 |
| 2.735 | -4.761 |
| 2.736 | -4.758 |
| 2.737 | -4.755 |
| 2.738 | -4.752 |
| 2.739 | -4.749 |
| 2.74 | -4.746 |
| 2.741 | -4.743 |
| 2.742 | -4.74 |
| 2.743 | -4.737 |
| 2.744 | -4.734 |
| 2.745 | -4.731 |
| 2.746 | -4.728 |
| 2.747 | -4.725 |
| 2.748 | -4.722 |
| 2.749 | -4.719 |
| 2.75 | -4.716 |
| 2.751 | -4.713 |
| 2.752 | -4.71 |
| 2.753 | -4.707 |
| 2.754 | -4.704 |
| 2.755 | -4.701 |
| 2.756 | -4.698 |
| 2.757 | -4.695 |
| 2.758 | -4.692 |
| 2.759 | -4.689 |
| 2.76 | -4.686 |
| 2.761 | -4.683 |
| 2.762 | -4.68 |
| 2.763 | -4.677 |
| 2.764 | -4.674 |
| 2.765 | -4.671 |
| 2.766 | -4.668 |
| 2.767 | -4.665 |
| 2.768 | -4.662 |
| 2.769 | -4.658 |
| 2.77 | -4.655 |
| 2.771 | -4.652 |
| 2.772 | -4.649 |
| 2.773 | -4.646 |
| 2.774 | -4.643 |
| 2.775 | -4.64 |
| 2.776 | -4.637 |
| 2.777 | -4.634 |
| 2.778 | -4.631 |
| 2.779 | -4.628 |
| 2.78 | -4.625 |
| 2.781 | -4.622 |
| 2.782 | -4.619 |
| 2.783 | -4.616 |
| 2.784 | -4.613 |
| 2.785 | -4.61 |
| 2.786 | -4.606 |
| 2.787 | -4.604 |
| 2.788 | -4.6 |
| 2.789 | -4.597 |
| 2.79 | -4.594 |
| 2.791 | -4.591 |
| 2.792 | -4.588 |
| 2.793 | -4.585 |
| 2.794 | -4.582 |
| 2.795 | -4.579 |
| 2.796 | -4.576 |
| 2.797 | -4.573 |
| 2.798 | -4.57 |
| 2.799 | -4.567 |
| 2.8 | -4.564 |
| 2.801 | -4.56 |
| 2.802 | -4.557 |
| 2.803 | -4.554 |
| 2.804 | -4.551 |
| 2.805 | -4.548 |
| 2.806 | -4.545 |
| 2.807 | -4.542 |
| 2.808 | -4.539 |
| 2.809 | -4.536 |
| 2.81 | -4.533 |
| 2.811 | -4.53 |
| 2.812 | -4.526 |
| 2.813 | -4.523 |
| 2.814 | -4.52 |
| 2.815 | -4.517 |
| 2.816 | -4.514 |
| 2.817 | -4.511 |
| 2.818 | -4.508 |
| 2.819 | -4.505 |
| 2.82 | -4.502 |
| 2.821 | -4.499 |
| 2.822 | -4.496 |
| 2.823 | -4.492 |
| 2.824 | -4.489 |
| 2.825 | -4.486 |
| 2.826 | -4.483 |
| 2.827 | -4.48 |
| 2.828 | -4.477 |
| 2.829 | -4.474 |
| 2.83 | -4.471 |
| 2.831 | -4.468 |
| 2.832 | -4.464 |
| 2.833 | -4.461 |
| 2.834 | -4.458 |
| 2.835 | -4.455 |
| 2.836 | -4.452 |
| 2.837 | -4.449 |
| 2.838 | -4.446 |
| 2.839 | -4.443 |
| 2.84 | -4.439 |
| 2.841 | -4.436 |
| 2.842 | -4.433 |
| 2.843 | -4.43 |
| 2.844 | -4.427 |
| 2.845 | -4.424 |
| 2.846 | -4.421 |
| 2.847 | -4.418 |
| 2.848 | -4.414 |
| 2.849 | -4.411 |
| 2.85 | -4.408 |
| 2.851 | -4.405 |
| 2.852 | -4.402 |
| 2.853 | -4.399 |
| 2.854 | -4.396 |
| 2.855 | -4.392 |
| 2.856 | -4.389 |
| 2.857 | -4.386 |
| 2.858 | -4.383 |
| 2.859 | -4.38 |
| 2.86 | -4.377 |
| 2.861 | -4.374 |
| 2.862 | -4.37 |
| 2.863 | -4.367 |
| 2.864 | -4.364 |
| 2.865 | -4.361 |
| 2.866 | -4.358 |
| 2.867 | -4.355 |
| 2.868 | -4.352 |
| 2.869 | -4.348 |
| 2.87 | -4.345 |
| 2.871 | -4.342 |
| 2.872 | -4.339 |
| 2.873 | -4.336 |
| 2.874 | -4.333 |
| 2.875 | -4.329 |
| 2.876 | -4.326 |
| 2.877 | -4.323 |
| 2.878 | -4.32 |
| 2.879 | -4.317 |
| 2.88 | -4.314 |
| 2.881 | -4.31 |
| 2.882 | -4.307 |
| 2.883 | -4.304 |
| 2.884 | -4.301 |
| 2.885 | -4.298 |
| 2.886 | -4.294 |
| 2.887 | -4.291 |
| 2.888 | -4.288 |
| 2.889 | -4.285 |
| 2.89 | -4.282 |
| 2.891 | -4.279 |
| 2.892 | -4.275 |
| 2.893 | -4.272 |
| 2.894 | -4.269 |
| 2.895 | -4.266 |
| 2.896 | -4.263 |
| 2.897 | -4.26 |
| 2.898 | -4.256 |
| 2.899 | -4.253 |
| 2.9 | -4.25 |
| 2.901 | -4.247 |
| 2.902 | -4.244 |
| 2.903 | -4.24 |
| 2.904 | -4.237 |
| 2.905 | -4.234 |
| 2.906 | -4.231 |
| 2.907 | -4.228 |
| 2.908 | -4.224 |
| 2.909 | -4.221 |
| 2.91 | -4.218 |
| 2.911 | -4.215 |
| 2.912 | -4.212 |
| 2.913 | -4.208 |
| 2.914 | -4.205 |
| 2.915 | -4.202 |
| 2.916 | -4.199 |
| 2.917 | -4.196 |
| 2.918 | -4.192 |
| 2.919 | -4.189 |
| 2.92 | -4.186 |
| 2.921 | -4.183 |
| 2.922 | -4.179 |
| 2.923 | -4.176 |
| 2.924 | -4.173 |
| 2.925 | -4.17 |
| 2.926 | -4.167 |
| 2.927 | -4.163 |
| 2.928 | -4.16 |
| 2.929 | -4.157 |
| 2.93 | -4.154 |
| 2.931 | -4.15 |
| 2.932 | -4.147 |
| 2.933 | -4.144 |
| 2.934 | -4.141 |
| 2.935 | -4.138 |
| 2.936 | -4.134 |
| 2.937 | -4.131 |
| 2.938 | -4.128 |
| 2.939 | -4.125 |
| 2.94 | -4.121 |
| 2.941 | -4.118 |
| 2.942 | -4.115 |
| 2.943 | -4.112 |
| 2.944 | -4.108 |
| 2.945 | -4.105 |
| 2.946 | -4.102 |
| 2.947 | -4.099 |
| 2.948 | -4.095 |
| 2.949 | -4.092 |
| 2.95 | -4.089 |
| 2.951 | -4.086 |
| 2.952 | -4.082 |
| 2.953 | -4.079 |
| 2.954 | -4.076 |
| 2.955 | -4.073 |
| 2.956 | -4.069 |
| 2.957 | -4.066 |
| 2.958 | -4.063 |
| 2.959 | -4.06 |
| 2.96 | -4.056 |
| 2.961 | -4.053 |
| 2.962 | -4.05 |
| 2.963 | -4.047 |
| 2.964 | -4.043 |
| 2.965 | -4.04 |
| 2.966 | -4.037 |
| 2.967 | -4.034 |
| 2.968 | -4.03 |
| 2.969 | -4.027 |
| 2.97 | -4.024 |
| 2.971 | -4.02 |
| 2.972 | -4.017 |
| 2.973 | -4.014 |
| 2.974 | -4.011 |
| 2.975 | -4.007 |
| 2.976 | -4.004 |
| 2.977 | -4.001 |
| 2.978 | -3.998 |
| 2.979 | -3.994 |
| 2.98 | -3.991 |
| 2.981 | -3.988 |
| 2.982 | -3.984 |
| 2.983 | -3.981 |
| 2.984 | -3.978 |
| 2.985 | -3.974 |
| 2.986 | -3.971 |
| 2.987 | -3.968 |
| 2.988 | -3.965 |
| 2.989 | -3.961 |
| 2.99 | -3.958 |
| 2.991 | -3.955 |
| 2.992 | -3.951 |
| 2.993 | -3.948 |
| 2.994 | -3.945 |
| 2.995 | -3.942 |
| 2.996 | -3.938 |
| 2.997 | -3.935 |
| 2.998 | -3.932 |
| 2.999 | -3.928 |
| 3.0 | -3.925 |
| 3.001 | -3.922 |
| 3.002 | -3.918 |
| 3.003 | -3.915 |
| 3.004 | -3.912 |
| 3.005 | -3.908 |
| 3.006 | -3.905 |
| 3.007 | -3.902 |
| 3.008 | -3.898 |
| 3.009 | -3.895 |
| 3.01 | -3.892 |
| 3.011 | -3.889 |
| 3.012 | -3.885 |
| 3.013 | -3.882 |
| 3.014 | -3.879 |
| 3.015 | -3.875 |
| 3.016 | -3.872 |
| 3.017 | -3.869 |
| 3.018 | -3.865 |
| 3.019 | -3.862 |
| 3.02 | -3.859 |
| 3.021 | -3.855 |
| 3.022 | -3.852 |
| 3.023 | -3.849 |
| 3.024 | -3.845 |
| 3.025 | -3.842 |
| 3.026 | -3.839 |
| 3.027 | -3.835 |
| 3.028 | -3.832 |
| 3.029 | -3.829 |
| 3.03 | -3.825 |
| 3.031 | -3.822 |
| 3.032 | -3.819 |
| 3.033 | -3.815 |
| 3.034 | -3.812 |
| 3.035 | -3.809 |
| 3.036 | -3.805 |
| 3.037 | -3.802 |
| 3.038 | -3.798 |
| 3.039 | -3.795 |
| 3.04 | -3.792 |
| 3.041 | -3.788 |
| 3.042 | -3.785 |
| 3.043 | -3.782 |
| 3.044 | -3.778 |
| 3.045 | -3.775 |
| 3.046 | -3.772 |
| 3.047 | -3.768 |
| 3.048 | -3.765 |
| 3.049 | -3.762 |
| 3.05 | -3.758 |
| 3.051 | -3.755 |
| 3.052 | -3.752 |
| 3.053 | -3.748 |
| 3.054 | -3.745 |
| 3.055 | -3.741 |
| 3.056 | -3.738 |
| 3.057 | -3.735 |
| 3.058 | -3.731 |
| 3.059 | -3.728 |
| 3.06 | -3.724 |
| 3.061 | -3.721 |
| 3.062 | -3.718 |
| 3.063 | -3.714 |
| 3.064 | -3.711 |
| 3.065 | -3.708 |
| 3.066 | -3.704 |
| 3.067 | -3.701 |
| 3.068 | -3.698 |
| 3.069 | -3.694 |
| 3.07 | -3.691 |
| 3.071 | -3.687 |
| 3.072 | -3.684 |
| 3.073 | -3.68 |
| 3.074 | -3.677 |
| 3.075 | -3.674 |
| 3.076 | -3.67 |
| 3.077 | -3.667 |
| 3.078 | -3.664 |
| 3.079 | -3.66 |
| 3.08 | -3.657 |
| 3.081 | -3.653 |
| 3.082 | -3.65 |
| 3.083 | -3.646 |
| 3.084 | -3.643 |
| 3.085 | -3.64 |
| 3.086 | -3.636 |
| 3.087 | -3.633 |
| 3.088 | -3.63 |
| 3.089 | -3.626 |
| 3.09 | -3.623 |
| 3.091 | -3.619 |
| 3.092 | -3.616 |
| 3.093 | -3.612 |
| 3.094 | -3.609 |
| 3.095 | -3.606 |
| 3.096 | -3.602 |
| 3.097 | -3.599 |
| 3.098 | -3.595 |
| 3.099 | -3.592 |
| 3.1 | -3.588 |
| 3.101 | -3.585 |
| 3.102 | -3.582 |
| 3.103 | -3.578 |
| 3.104 | -3.575 |
| 3.105 | -3.571 |
| 3.106 | -3.568 |
| 3.107 | -3.564 |
| 3.108 | -3.561 |
| 3.109 | -3.558 |
| 3.11 | -3.554 |
| 3.111 | -3.551 |
| 3.112 | -3.547 |
| 3.113 | -3.544 |
| 3.114 | -3.54 |
| 3.115 | -3.537 |
| 3.116 | -3.534 |
| 3.117 | -3.53 |
| 3.118 | -3.527 |
| 3.119 | -3.523 |
| 3.12 | -3.52 |
| 3.121 | -3.516 |
| 3.122 | -3.513 |
| 3.123 | -3.509 |
| 3.124 | -3.506 |
| 3.125 | -3.502 |
| 3.126 | -3.499 |
| 3.127 | -3.496 |
| 3.128 | -3.492 |
| 3.129 | -3.489 |
| 3.13 | -3.485 |
| 3.131 | -3.482 |
| 3.132 | -3.478 |
| 3.133 | -3.475 |
| 3.134 | -3.471 |
| 3.135 | -3.468 |
| 3.136 | -3.464 |
| 3.137 | -3.461 |
| 3.138 | -3.458 |
| 3.139 | -3.454 |
| 3.14 | -3.451 |
| 3.141 | -3.447 |
| 3.142 | -3.444 |
| 3.143 | -3.44 |
| 3.144 | -3.437 |
| 3.145 | -3.433 |
| 3.146 | -3.43 |
| 3.147 | -3.426 |
| 3.148 | -3.423 |
| 3.149 | -3.419 |
| 3.15 | -3.416 |
| 3.151 | -3.412 |
| 3.152 | -3.409 |
| 3.153 | -3.405 |
| 3.154 | -3.402 |
| 3.155 | -3.398 |
| 3.156 | -3.395 |
| 3.157 | -3.391 |
| 3.158 | -3.388 |
| 3.159 | -3.384 |
| 3.16 | -3.381 |
| 3.161 | -3.377 |
| 3.162 | -3.374 |
| 3.163 | -3.37 |
| 3.164 | -3.367 |
| 3.165 | -3.363 |
| 3.166 | -3.36 |
| 3.167 | -3.356 |
| 3.168 | -3.353 |
| 3.169 | -3.349 |
| 3.17 | -3.346 |
| 3.171 | -3.342 |
| 3.172 | -3.339 |
| 3.173 | -3.335 |
| 3.174 | -3.332 |
| 3.175 | -3.328 |
| 3.176 | -3.325 |
| 3.177 | -3.321 |
| 3.178 | -3.318 |
| 3.179 | -3.314 |
| 3.18 | -3.311 |
| 3.181 | -3.307 |
| 3.182 | -3.304 |
| 3.183 | -3.3 |
| 3.184 | -3.297 |
| 3.185 | -3.293 |
| 3.186 | -3.29 |
| 3.187 | -3.286 |
| 3.188 | -3.282 |
| 3.189 | -3.279 |
| 3.19 | -3.275 |
| 3.191 | -3.272 |
| 3.192 | -3.268 |
| 3.193 | -3.265 |
| 3.194 | -3.261 |
| 3.195 | -3.258 |
| 3.196 | -3.254 |
| 3.197 | -3.251 |
| 3.198 | -3.247 |
| 3.199 | -3.244 |
| 3.2 | -3.24 |
| 3.201 | -3.236 |
| 3.202 | -3.233 |
| 3.203 | -3.229 |
| 3.204 | -3.226 |
| 3.205 | -3.222 |
| 3.206 | -3.219 |
| 3.207 | -3.215 |
| 3.208 | -3.212 |
| 3.209 | -3.208 |
| 3.21 | -3.205 |
| 3.211 | -3.201 |
| 3.212 | -3.197 |
| 3.213 | -3.194 |
| 3.214 | -3.19 |
| 3.215 | -3.187 |
| 3.216 | -3.183 |
| 3.217 | -3.18 |
| 3.218 | -3.176 |
| 3.219 | -3.172 |
| 3.22 | -3.169 |
| 3.221 | -3.165 |
| 3.222 | -3.162 |
| 3.223 | -3.158 |
| 3.224 | -3.155 |
| 3.225 | -3.151 |
| 3.226 | -3.148 |
| 3.227 | -3.144 |
| 3.228 | -3.14 |
| 3.229 | -3.137 |
| 3.23 | -3.133 |
| 3.231 | -3.13 |
| 3.232 | -3.126 |
| 3.233 | -3.122 |
| 3.234 | -3.119 |
| 3.235 | -3.115 |
| 3.236 | -3.112 |
| 3.237 | -3.108 |
| 3.238 | -3.104 |
| 3.239 | -3.101 |
| 3.24 | -3.097 |
| 3.241 | -3.094 |
| 3.242 | -3.09 |
| 3.243 | -3.086 |
| 3.244 | -3.083 |
| 3.245 | -3.079 |
| 3.246 | -3.076 |
| 3.247 | -3.072 |
| 3.248 | -3.068 |
| 3.249 | -3.065 |
| 3.25 | -3.061 |
| 3.251 | -3.058 |
| 3.252 | -3.054 |
| 3.253 | -3.05 |
| 3.254 | -3.047 |
| 3.255 | -3.043 |
| 3.256 | -3.04 |
| 3.257 | -3.036 |
| 3.258 | -3.032 |
| 3.259 | -3.029 |
| 3.26 | -3.025 |
| 3.261 | -3.022 |
| 3.262 | -3.018 |
| 3.263 | -3.014 |
| 3.264 | -3.011 |
| 3.265 | -3.007 |
| 3.266 | -3.004 |
| 3.267 | -3 |
| 3.268 | -2.996 |
| 3.269 | -2.993 |
| 3.27 | -2.989 |
| 3.271 | -2.985 |
| 3.272 | -2.982 |
| 3.273 | -2.978 |
| 3.274 | -2.974 |
| 3.275 | -2.971 |
| 3.276 | -2.967 |
| 3.277 | -2.964 |
| 3.278 | -2.96 |
| 3.279 | -2.956 |
| 3.28 | -2.953 |
| 3.281 | -2.949 |
| 3.282 | -2.945 |
| 3.283 | -2.942 |
| 3.284 | -2.938 |
| 3.285 | -2.934 |
| 3.286 | -2.931 |
| 3.287 | -2.927 |
| 3.288 | -2.923 |
| 3.289 | -2.92 |
| 3.29 | -2.916 |
| 3.291 | -2.912 |
| 3.292 | -2.909 |
| 3.293 | -2.905 |
| 3.294 | -2.902 |
| 3.295 | -2.898 |
| 3.296 | -2.894 |
| 3.297 | -2.89 |
| 3.298 | -2.887 |
| 3.299 | -2.883 |
| 3.3 | -2.88 |
| 3.301 | -2.876 |
| 3.302 | -2.872 |
| 3.303 | -2.868 |
| 3.304 | -2.865 |
| 3.305 | -2.861 |
| 3.306 | -2.858 |
| 3.307 | -2.854 |
| 3.308 | -2.85 |
| 3.309 | -2.846 |
| 3.31 | -2.843 |
| 3.311 | -2.839 |
| 3.312 | -2.835 |
| 3.313 | -2.832 |
| 3.314 | -2.828 |
| 3.315 | -2.824 |
| 3.316 | -2.821 |
| 3.317 | -2.817 |
| 3.318 | -2.813 |
| 3.319 | -2.81 |
| 3.32 | -2.806 |
| 3.321 | -2.802 |
| 3.322 | -2.799 |
| 3.323 | -2.795 |
| 3.324 | -2.791 |
| 3.325 | -2.788 |
| 3.326 | -2.784 |
| 3.327 | -2.78 |
| 3.328 | -2.776 |
| 3.329 | -2.773 |
| 3.33 | -2.769 |
| 3.331 | -2.765 |
| 3.332 | -2.762 |
| 3.333 | -2.758 |
| 3.334 | -2.754 |
| 3.335 | -2.75 |
| 3.336 | -2.747 |
| 3.337 | -2.743 |
| 3.338 | -2.739 |
| 3.339 | -2.736 |
| 3.34 | -2.732 |
| 3.341 | -2.728 |
| 3.342 | -2.724 |
| 3.343 | -2.721 |
| 3.344 | -2.717 |
| 3.345 | -2.713 |
| 3.346 | -2.71 |
| 3.347 | -2.706 |
| 3.348 | -2.702 |
| 3.349 | -2.698 |
| 3.35 | -2.695 |
| 3.351 | -2.691 |
| 3.352 | -2.687 |
| 3.353 | -2.683 |
| 3.354 | -2.68 |
| 3.355 | -2.676 |
| 3.356 | -2.672 |
| 3.357 | -2.668 |
| 3.358 | -2.665 |
| 3.359 | -2.661 |
| 3.36 | -2.657 |
| 3.361 | -2.654 |
| 3.362 | -2.65 |
| 3.363 | -2.646 |
| 3.364 | -2.642 |
| 3.365 | -2.639 |
| 3.366 | -2.635 |
| 3.367 | -2.631 |
| 3.368 | -2.627 |
| 3.369 | -2.624 |
| 3.37 | -2.62 |
| 3.371 | -2.616 |
| 3.372 | -2.612 |
| 3.373 | -2.608 |
| 3.374 | -2.605 |
| 3.375 | -2.601 |
| 3.376 | -2.597 |
| 3.377 | -2.594 |
| 3.378 | -2.59 |
| 3.379 | -2.586 |
| 3.38 | -2.582 |
| 3.381 | -2.578 |
| 3.382 | -2.575 |
| 3.383 | -2.571 |
| 3.384 | -2.567 |
| 3.385 | -2.563 |
| 3.386 | -2.56 |
| 3.387 | -2.556 |
| 3.388 | -2.552 |
| 3.389 | -2.548 |
| 3.39 | -2.544 |
| 3.391 | -2.541 |
| 3.392 | -2.537 |
| 3.393 | -2.533 |
| 3.394 | -2.529 |
| 3.395 | -2.526 |
| 3.396 | -2.522 |
| 3.397 | -2.518 |
| 3.398 | -2.514 |
| 3.399 | -2.51 |
| 3.4 | -2.507 |
| 3.401 | -2.503 |
| 3.402 | -2.499 |
| 3.403 | -2.495 |
| 3.404 | -2.491 |
| 3.405 | -2.488 |
| 3.406 | -2.484 |
| 3.407 | -2.48 |
| 3.408 | -2.476 |
| 3.409 | -2.472 |
| 3.41 | -2.469 |
| 3.411 | -2.465 |
| 3.412 | -2.461 |
| 3.413 | -2.457 |
| 3.414 | -2.453 |
| 3.415 | -2.45 |
| 3.416 | -2.446 |
| 3.417 | -2.442 |
| 3.418 | -2.438 |
| 3.419 | -2.434 |
| 3.42 | -2.43 |
| 3.421 | -2.427 |
| 3.422 | -2.423 |
| 3.423 | -2.419 |
| 3.424 | -2.415 |
| 3.425 | -2.411 |
| 3.426 | -2.408 |
| 3.427 | -2.404 |
| 3.428 | -2.4 |
| 3.429 | -2.396 |
| 3.43 | -2.392 |
| 3.431 | -2.388 |
| 3.432 | -2.385 |
| 3.433 | -2.381 |
| 3.434 | -2.377 |
| 3.435 | -2.373 |
| 3.436 | -2.369 |
| 3.437 | -2.365 |
| 3.438 | -2.362 |
| 3.439 | -2.358 |
| 3.44 | -2.354 |
| 3.441 | -2.35 |
| 3.442 | -2.346 |
| 3.443 | -2.342 |
| 3.444 | -2.338 |
| 3.445 | -2.335 |
| 3.446 | -2.331 |
| 3.447 | -2.327 |
| 3.448 | -2.323 |
| 3.449 | -2.319 |
| 3.45 | -2.315 |
| 3.451 | -2.312 |
| 3.452 | -2.308 |
| 3.453 | -2.304 |
| 3.454 | -2.3 |
| 3.455 | -2.296 |
| 3.456 | -2.292 |
| 3.457 | -2.288 |
| 3.458 | -2.284 |
| 3.459 | -2.281 |
| 3.46 | -2.277 |
| 3.461 | -2.273 |
| 3.462 | -2.269 |
| 3.463 | -2.265 |
| 3.464 | -2.261 |
| 3.465 | -2.258 |
| 3.466 | -2.254 |
| 3.467 | -2.25 |
| 3.468 | -2.246 |
| 3.469 | -2.242 |
| 3.47 | -2.238 |
| 3.471 | -2.234 |
| 3.472 | -2.23 |
| 3.473 | -2.226 |
| 3.474 | -2.222 |
| 3.475 | -2.219 |
| 3.476 | -2.215 |
| 3.477 | -2.211 |
| 3.478 | -2.207 |
| 3.479 | -2.203 |
| 3.48 | -2.199 |
| 3.481 | -2.195 |
| 3.482 | -2.191 |
| 3.483 | -2.188 |
| 3.484 | -2.184 |
| 3.485 | -2.18 |
| 3.486 | -2.176 |
| 3.487 | -2.172 |
| 3.488 | -2.168 |
| 3.489 | -2.164 |
| 3.49 | -2.16 |
| 3.491 | -2.156 |
| 3.492 | -2.152 |
| 3.493 | -2.148 |
| 3.494 | -2.145 |
| 3.495 | -2.141 |
| 3.496 | -2.137 |
| 3.497 | -2.133 |
| 3.498 | -2.129 |
| 3.499 | -2.125 |
| 3.5 | -2.121 |
| 3.501 | -2.117 |
| 3.502 | -2.113 |
| 3.503 | -2.109 |
| 3.504 | -2.105 |
| 3.505 | -2.102 |
| 3.506 | -2.098 |
| 3.507 | -2.094 |
| 3.508 | -2.09 |
| 3.509 | -2.086 |
| 3.51 | -2.082 |
| 3.511 | -2.078 |
| 3.512 | -2.074 |
| 3.513 | -2.07 |
| 3.514 | -2.066 |
| 3.515 | -2.062 |
| 3.516 | -2.058 |
| 3.517 | -2.054 |
| 3.518 | -2.05 |
| 3.519 | -2.046 |
| 3.52 | -2.042 |
| 3.521 | -2.038 |
| 3.522 | -2.034 |
| 3.523 | -2.031 |
| 3.524 | -2.027 |
| 3.525 | -2.023 |
| 3.526 | -2.019 |
| 3.527 | -2.015 |
| 3.528 | -2.011 |
| 3.529 | -2.007 |
| 3.53 | -2.003 |
| 3.531 | -1.999 |
| 3.532 | -1.995 |
| 3.533 | -1.991 |
| 3.534 | -1.987 |
| 3.535 | -1.983 |
| 3.536 | -1.979 |
| 3.537 | -1.975 |
| 3.538 | -1.971 |
| 3.539 | -1.967 |
| 3.54 | -1.963 |
| 3.541 | -1.959 |
| 3.542 | -1.955 |
| 3.543 | -1.951 |
| 3.544 | -1.947 |
| 3.545 | -1.943 |
| 3.546 | -1.939 |
| 3.547 | -1.935 |
| 3.548 | -1.931 |
| 3.549 | -1.928 |
| 3.55 | -1.924 |
| 3.551 | -1.92 |
| 3.552 | -1.916 |
| 3.553 | -1.912 |
| 3.554 | -1.908 |
| 3.555 | -1.904 |
| 3.556 | -1.9 |
| 3.557 | -1.896 |
| 3.558 | -1.892 |
| 3.559 | -1.888 |
| 3.56 | -1.884 |
| 3.561 | -1.88 |
| 3.562 | -1.876 |
| 3.563 | -1.872 |
| 3.564 | -1.868 |
| 3.565 | -1.864 |
| 3.566 | -1.86 |
| 3.567 | -1.856 |
| 3.568 | -1.852 |
| 3.569 | -1.848 |
| 3.57 | -1.844 |
| 3.571 | -1.84 |
| 3.572 | -1.836 |
| 3.573 | -1.832 |
| 3.574 | -1.828 |
| 3.575 | -1.824 |
| 3.576 | -1.82 |
| 3.577 | -1.815 |
| 3.578 | -1.811 |
| 3.579 | -1.807 |
| 3.58 | -1.803 |
| 3.581 | -1.799 |
| 3.582 | -1.795 |
| 3.583 | -1.791 |
| 3.584 | -1.787 |
| 3.585 | -1.783 |
| 3.586 | -1.779 |
| 3.587 | -1.775 |
| 3.588 | -1.771 |
| 3.589 | -1.767 |
| 3.59 | -1.763 |
| 3.591 | -1.759 |
| 3.592 | -1.755 |
| 3.593 | -1.751 |
| 3.594 | -1.747 |
| 3.595 | -1.743 |
| 3.596 | -1.739 |
| 3.597 | -1.735 |
| 3.598 | -1.731 |
| 3.599 | -1.727 |
| 3.6 | -1.723 |
| 3.601 | -1.719 |
| 3.602 | -1.714 |
| 3.603 | -1.71 |
| 3.604 | -1.706 |
| 3.605 | -1.702 |
| 3.606 | -1.698 |
| 3.607 | -1.694 |
| 3.608 | -1.69 |
| 3.609 | -1.686 |
| 3.61 | -1.682 |
| 3.611 | -1.678 |
| 3.612 | -1.674 |
| 3.613 | -1.67 |
| 3.614 | -1.666 |
| 3.615 | -1.662 |
| 3.616 | -1.658 |
| 3.617 | -1.654 |
| 3.618 | -1.65 |
| 3.619 | -1.646 |
| 3.62 | -1.641 |
| 3.621 | -1.637 |
| 3.622 | -1.633 |
| 3.623 | -1.629 |
| 3.624 | -1.625 |
| 3.625 | -1.621 |
| 3.626 | -1.617 |
| 3.627 | -1.613 |
| 3.628 | -1.609 |
| 3.629 | -1.605 |
| 3.63 | -1.601 |
| 3.631 | -1.596 |
| 3.632 | -1.592 |
| 3.633 | -1.588 |
| 3.634 | -1.584 |
| 3.635 | -1.58 |
| 3.636 | -1.576 |
| 3.637 | -1.572 |
| 3.638 | -1.568 |
| 3.639 | -1.564 |
| 3.64 | -1.56 |
| 3.641 | -1.556 |
| 3.642 | -1.551 |
| 3.643 | -1.547 |
| 3.644 | -1.543 |
| 3.645 | -1.539 |
| 3.646 | -1.535 |
| 3.647 | -1.531 |
| 3.648 | -1.527 |
| 3.649 | -1.523 |
| 3.65 | -1.518 |
| 3.651 | -1.514 |
| 3.652 | -1.51 |
| 3.653 | -1.506 |
| 3.654 | -1.502 |
| 3.655 | -1.498 |
| 3.656 | -1.494 |
| 3.657 | -1.49 |
| 3.658 | -1.486 |
| 3.659 | -1.481 |
| 3.66 | -1.477 |
| 3.661 | -1.473 |
| 3.662 | -1.469 |
| 3.663 | -1.465 |
| 3.664 | -1.461 |
| 3.665 | -1.457 |
| 3.666 | -1.452 |
| 3.667 | -1.448 |
| 3.668 | -1.444 |
| 3.669 | -1.44 |
| 3.67 | -1.436 |
| 3.671 | -1.432 |
| 3.672 | -1.428 |
| 3.673 | -1.424 |
| 3.674 | -1.419 |
| 3.675 | -1.415 |
| 3.676 | -1.411 |
| 3.677 | -1.407 |
| 3.678 | -1.403 |
| 3.679 | -1.399 |
| 3.68 | -1.394 |
| 3.681 | -1.39 |
| 3.682 | -1.386 |
| 3.683 | -1.382 |
| 3.684 | -1.378 |
| 3.685 | -1.374 |
| 3.686 | -1.37 |
| 3.687 | -1.365 |
| 3.688 | -1.361 |
| 3.689 | -1.357 |
| 3.69 | -1.353 |
| 3.691 | -1.349 |
| 3.692 | -1.344 |
| 3.693 | -1.34 |
| 3.694 | -1.336 |
| 3.695 | -1.332 |
| 3.696 | -1.328 |
| 3.697 | -1.324 |
| 3.698 | -1.32 |
| 3.699 | -1.315 |
| 3.7 | -1.311 |
| 3.701 | -1.307 |
| 3.702 | -1.303 |
| 3.703 | -1.299 |
| 3.704 | -1.294 |
| 3.705 | -1.29 |
| 3.706 | -1.286 |
| 3.707 | -1.282 |
| 3.708 | -1.278 |
| 3.709 | -1.273 |
| 3.71 | -1.269 |
| 3.711 | -1.265 |
| 3.712 | -1.261 |
| 3.713 | -1.257 |
| 3.714 | -1.252 |
| 3.715 | -1.248 |
| 3.716 | -1.244 |
| 3.717 | -1.24 |
| 3.718 | -1.236 |
| 3.719 | -1.231 |
| 3.72 | -1.227 |
| 3.721 | -1.223 |
| 3.722 | -1.219 |
| 3.723 | -1.215 |
| 3.724 | -1.21 |
| 3.725 | -1.206 |
| 3.726 | -1.202 |
| 3.727 | -1.198 |
| 3.728 | -1.194 |
| 3.729 | -1.189 |
| 3.73 | -1.185 |
| 3.731 | -1.181 |
| 3.732 | -1.177 |
| 3.733 | -1.172 |
| 3.734 | -1.168 |
| 3.735 | -1.164 |
| 3.736 | -1.16 |
| 3.737 | -1.156 |
| 3.738 | -1.151 |
| 3.739 | -1.147 |
| 3.74 | -1.143 |
| 3.741 | -1.138 |
| 3.742 | -1.134 |
| 3.743 | -1.13 |
| 3.744 | -1.126 |
| 3.745 | -1.122 |
| 3.746 | -1.117 |
| 3.747 | -1.113 |
| 3.748 | -1.109 |
| 3.749 | -1.105 |
| 3.75 | -1.1 |
| 3.751 | -1.096 |
| 3.752 | -1.092 |
| 3.753 | -1.088 |
| 3.754 | -1.083 |
| 3.755 | -1.079 |
| 3.756 | -1.075 |
| 3.757 | -1.07 |
| 3.758 | -1.066 |
| 3.759 | -1.062 |
| 3.76 | -1.058 |
| 3.761 | -1.054 |
| 3.762 | -1.049 |
| 3.763 | -1.045 |
| 3.764 | -1.041 |
| 3.765 | -1.036 |
| 3.766 | -1.032 |
| 3.767 | -1.028 |
| 3.768 | -1.024 |
| 3.769 | -1.019 |
| 3.77 | -1.015 |
| 3.771 | -1.011 |
| 3.772 | -1.006 |
| 3.773 | -1.002 |
| 3.774 | -0.998 |
| 3.775 | -0.994 |
| 3.776 | -0.989 |
| 3.777 | -0.985 |
| 3.778 | -0.981 |
| 3.779 | -0.976 |
| 3.78 | -0.972 |
| 3.781 | -0.968 |
| 3.782 | -0.964 |
| 3.783 | -0.959 |
| 3.784 | -0.955 |
| 3.785 | -0.951 |
| 3.786 | -0.946 |
| 3.787 | -0.942 |
| 3.788 | -0.938 |
| 3.789 | -0.934 |
| 3.79 | -0.929 |
| 3.791 | -0.925 |
| 3.792 | -0.921 |
| 3.793 | -0.916 |
| 3.794 | -0.912 |
| 3.795 | -0.908 |
| 3.796 | -0.903 |
| 3.797 | -0.899 |
| 3.798 | -0.895 |
| 3.799 | -0.89 |
| 3.8 | -0.886 |
| 3.801 | -0.882 |
| 3.802 | -0.878 |
| 3.803 | -0.873 |
| 3.804 | -0.869 |
| 3.805 | -0.865 |
| 3.806 | -0.86 |
| 3.807 | -0.856 |
| 3.808 | -0.852 |
| 3.809 | -0.847 |
| 3.81 | -0.843 |
| 3.811 | -0.839 |
| 3.812 | -0.834 |
| 3.813 | -0.83 |
| 3.814 | -0.826 |
| 3.815 | -0.821 |
| 3.816 | -0.817 |
| 3.817 | -0.813 |
| 3.818 | -0.808 |
| 3.819 | -0.804 |
| 3.82 | -0.8 |
| 3.821 | -0.795 |
| 3.822 | -0.791 |
| 3.823 | -0.786 |
| 3.824 | -0.782 |
| 3.825 | -0.778 |
| 3.826 | -0.774 |
| 3.827 | -0.769 |
| 3.828 | -0.765 |
| 3.829 | -0.76 |
| 3.83 | -0.756 |
| 3.831 | -0.752 |
| 3.832 | -0.747 |
| 3.833 | -0.743 |
| 3.834 | -0.739 |
| 3.835 | -0.734 |
| 3.836 | -0.73 |
| 3.837 | -0.726 |
| 3.838 | -0.721 |
| 3.839 | -0.717 |
| 3.84 | -0.712 |
| 3.841 | -0.708 |
| 3.842 | -0.704 |
| 3.843 | -0.699 |
| 3.844 | -0.695 |
| 3.845 | -0.69 |
| 3.846 | -0.686 |
| 3.847 | -0.682 |
| 3.848 | -0.677 |
| 3.849 | -0.673 |
| 3.85 | -0.669 |
| 3.851 | -0.664 |
| 3.852 | -0.66 |
| 3.853 | -0.655 |
| 3.854 | -0.651 |
| 3.855 | -0.647 |
| 3.856 | -0.642 |
| 3.857 | -0.638 |
| 3.858 | -0.634 |
| 3.859 | -0.629 |
| 3.86 | -0.625 |
| 3.861 | -0.62 |
| 3.862 | -0.616 |
| 3.863 | -0.612 |
| 3.864 | -0.607 |
| 3.865 | -0.603 |
| 3.866 | -0.598 |
| 3.867 | -0.594 |
| 3.868 | -0.589 |
| 3.869 | -0.585 |
| 3.87 | -0.581 |
| 3.871 | -0.576 |
| 3.872 | -0.572 |
| 3.873 | -0.567 |
| 3.874 | -0.563 |
| 3.875 | -0.558 |
| 3.876 | -0.554 |
| 3.877 | -0.55 |
| 3.878 | -0.545 |
| 3.879 | -0.541 |
| 3.88 | -0.536 |
| 3.881 | -0.532 |
| 3.882 | -0.528 |
| 3.883 | -0.523 |
| 3.884 | -0.519 |
| 3.885 | -0.514 |
| 3.886 | -0.51 |
| 3.887 | -0.505 |
| 3.888 | -0.501 |
| 3.889 | -0.496 |
| 3.89 | -0.492 |
| 3.891 | -0.488 |
| 3.892 | -0.483 |
| 3.893 | -0.479 |
| 3.894 | -0.474 |
| 3.895 | -0.47 |
| 3.896 | -0.465 |
| 3.897 | -0.461 |
| 3.898 | -0.456 |
| 3.899 | -0.452 |
| 3.9 | -0.448 |
| 3.901 | -0.443 |
| 3.902 | -0.439 |
| 3.903 | -0.434 |
| 3.904 | -0.43 |
| 3.905 | -0.425 |
| 3.906 | -0.421 |
| 3.907 | -0.416 |
| 3.908 | -0.412 |
| 3.909 | -0.407 |
| 3.91 | -0.403 |
| 3.911 | -0.398 |
| 3.912 | -0.394 |
| 3.913 | -0.39 |
| 3.914 | -0.385 |
| 3.915 | -0.381 |
| 3.916 | -0.376 |
| 3.917 | -0.372 |
| 3.918 | -0.367 |
| 3.919 | -0.363 |
| 3.92 | -0.358 |
| 3.921 | -0.354 |
| 3.922 | -0.349 |
| 3.923 | -0.345 |
| 3.924 | -0.34 |
| 3.925 | -0.336 |
| 3.926 | -0.331 |
| 3.927 | -0.327 |
| 3.928 | -0.322 |
| 3.929 | -0.318 |
| 3.93 | -0.313 |
| 3.931 | -0.309 |
| 3.932 | -0.304 |
| 3.933 | -0.3 |
| 3.934 | -0.295 |
| 3.935 | -0.291 |
| 3.936 | -0.286 |
| 3.937 | -0.282 |
| 3.938 | -0.277 |
| 3.939 | -0.273 |
| 3.94 | -0.268 |
| 3.941 | -0.264 |
| 3.942 | -0.259 |
| 3.943 | -0.255 |
| 3.944 | -0.25 |
| 3.945 | -0.246 |
| 3.946 | -0.241 |
| 3.947 | -0.237 |
| 3.948 | -0.232 |
| 3.949 | -0.228 |
| 3.95 | -0.223 |
| 3.951 | -0.219 |
| 3.952 | -0.214 |
| 3.953 | -0.21 |
| 3.954 | -0.205 |
| 3.955 | -0.2 |
| 3.956 | -0.196 |
| 3.957 | -0.191 |
| 3.958 | -0.187 |
| 3.959 | -0.182 |
| 3.96 | -0.178 |
| 3.961 | -0.173 |
| 3.962 | -0.169 |
| 3.963 | -0.164 |
| 3.964 | -0.16 |
| 3.965 | -0.155 |
| 3.966 | -0.15 |
| 3.967 | -0.146 |
| 3.968 | -0.141 |
| 3.969 | -0.137 |
| 3.97 | -0.132 |
| 3.971 | -0.128 |
| 3.972 | -0.123 |
| 3.973 | -0.119 |
| 3.974 | -0.114 |
| 3.975 | -0.11 |
| 3.976 | -0.105 |
| 3.977 | -0.1 |
| 3.978 | -0.096 |
| 3.979 | -0.091 |
| 3.98 | -0.087 |
| 3.981 | -0.082 |
| 3.982 | -0.078 |
| 3.983 | -0.073 |
| 3.984 | -0.068 |
| 3.985 | -0.064 |
| 3.986 | -0.059 |
| 3.987 | -0.055 |
| 3.988 | -0.05 |
| 3.989 | -0.046 |
| 3.99 | -0.041 |
| 3.991 | -0.036 |
| 3.992 | -0.032 |
| 3.993 | -0.027 |
| 3.994 | -0.023 |
| 3.995 | -0.018 |
| 3.996 | -0.014 |
| 3.997 | -0.009 |
| 3.998 | -0.004 |
| 3.999 | 0 |
| 4.0 | 0.005 |
| 4.001 | 0.01 |
| 4.002 | 0.014 |
| 4.003 | 0.019 |
| 4.004 | 0.023 |
| 4.005 | 0.028 |
| 4.006 | 0.032 |
| 4.007 | 0.037 |
| 4.008 | 0.042 |
| 4.009 | 0.046 |
| 4.01 | 0.051 |
| 4.011 | 0.056 |
| 4.012 | 0.06 |
| 4.013 | 0.065 |
| 4.014 | 0.069 |
| 4.015 | 0.074 |
| 4.016 | 0.079 |
| 4.017 | 0.083 |
| 4.018 | 0.088 |
| 4.019 | 0.092 |
| 4.02 | 0.097 |
| 4.021 | 0.102 |
| 4.022 | 0.106 |
| 4.023 | 0.111 |
| 4.024 | 0.116 |
| 4.025 | 0.12 |
| 4.026 | 0.125 |
| 4.027 | 0.13 |
| 4.028 | 0.134 |
| 4.029 | 0.139 |
| 4.03 | 0.143 |
| 4.031 | 0.148 |
| 4.032 | 0.153 |
| 4.033 | 0.157 |
| 4.034 | 0.162 |
| 4.035 | 0.167 |
| 4.036 | 0.171 |
| 4.037 | 0.176 |
| 4.038 | 0.181 |
| 4.039 | 0.185 |
| 4.04 | 0.19 |
| 4.041 | 0.194 |
| 4.042 | 0.199 |
| 4.043 | 0.204 |
| 4.044 | 0.208 |
| 4.045 | 0.213 |
| 4.046 | 0.218 |
| 4.047 | 0.222 |
| 4.048 | 0.227 |
| 4.049 | 0.232 |
| 4.05 | 0.236 |
| 4.051 | 0.241 |
| 4.052 | 0.246 |
| 4.053 | 0.25 |
| 4.054 | 0.255 |
| 4.055 | 0.26 |
| 4.056 | 0.264 |
| 4.057 | 0.269 |
| 4.058 | 0.274 |
| 4.059 | 0.278 |
| 4.06 | 0.283 |
| 4.061 | 0.288 |
| 4.062 | 0.293 |
| 4.063 | 0.297 |
| 4.064 | 0.302 |
| 4.065 | 0.307 |
| 4.066 | 0.311 |
| 4.067 | 0.316 |
| 4.068 | 0.321 |
| 4.069 | 0.325 |
| 4.07 | 0.33 |
| 4.071 | 0.335 |
| 4.072 | 0.34 |
| 4.073 | 0.344 |
| 4.074 | 0.349 |
| 4.075 | 0.354 |
| 4.076 | 0.358 |
| 4.077 | 0.363 |
| 4.078 | 0.368 |
| 4.079 | 0.372 |
| 4.08 | 0.377 |
| 4.081 | 0.382 |
| 4.082 | 0.386 |
| 4.083 | 0.391 |
| 4.084 | 0.396 |
| 4.085 | 0.401 |
| 4.086 | 0.405 |
| 4.087 | 0.41 |
| 4.088 | 0.415 |
| 4.089 | 0.42 |
| 4.09 | 0.424 |
| 4.091 | 0.429 |
| 4.092 | 0.434 |
| 4.093 | 0.438 |
| 4.094 | 0.443 |
| 4.095 | 0.448 |
| 4.096 | 0.453 |
| 4.097 | 0.457 |
| 4.098 | 0.462 |
| 4.099 | 0.467 |
| 4.1 | 0.472 |
| 4.101 | 0.476 |
| 4.102 | 0.481 |
| 4.103 | 0.486 |
| 4.104 | 0.491 |
| 4.105 | 0.495 |
| 4.106 | 0.5 |
| 4.107 | 0.505 |
| 4.108 | 0.509 |
| 4.109 | 0.514 |
| 4.11 | 0.519 |
| 4.111 | 0.524 |
| 4.112 | 0.529 |
| 4.113 | 0.533 |
| 4.114 | 0.538 |
| 4.115 | 0.543 |
| 4.116 | 0.548 |
| 4.117 | 0.552 |
| 4.118 | 0.557 |
| 4.119 | 0.562 |
| 4.12 | 0.567 |
| 4.121 | 0.571 |
| 4.122 | 0.576 |
| 4.123 | 0.581 |
| 4.124 | 0.586 |
| 4.125 | 0.59 |
| 4.126 | 0.595 |
| 4.127 | 0.6 |
| 4.128 | 0.605 |
| 4.129 | 0.61 |
| 4.13 | 0.614 |
| 4.131 | 0.619 |
| 4.132 | 0.624 |
| 4.133 | 0.629 |
| 4.134 | 0.634 |
| 4.135 | 0.638 |
| 4.136 | 0.643 |
| 4.137 | 0.648 |
| 4.138 | 0.653 |
| 4.139 | 0.658 |
| 4.14 | 0.662 |
| 4.141 | 0.667 |
| 4.142 | 0.672 |
| 4.143 | 0.677 |
| 4.144 | 0.682 |
| 4.145 | 0.686 |
| 4.146 | 0.691 |
| 4.147 | 0.696 |
| 4.148 | 0.701 |
| 4.149 | 0.706 |
| 4.15 | 0.71 |
| 4.151 | 0.715 |
| 4.152 | 0.72 |
| 4.153 | 0.725 |
| 4.154 | 0.73 |
| 4.155 | 0.734 |
| 4.156 | 0.739 |
| 4.157 | 0.744 |
| 4.158 | 0.749 |
| 4.159 | 0.754 |
| 4.16 | 0.758 |
| 4.161 | 0.763 |
| 4.162 | 0.768 |
| 4.163 | 0.773 |
| 4.164 | 0.778 |
| 4.165 | 0.783 |
| 4.166 | 0.788 |
| 4.167 | 0.792 |
| 4.168 | 0.797 |
| 4.169 | 0.802 |
| 4.17 | 0.807 |
| 4.171 | 0.812 |
| 4.172 | 0.816 |
| 4.173 | 0.821 |
| 4.174 | 0.826 |
| 4.175 | 0.831 |
| 4.176 | 0.836 |
| 4.177 | 0.841 |
| 4.178 | 0.846 |
| 4.179 | 0.85 |
| 4.18 | 0.855 |
| 4.181 | 0.86 |
| 4.182 | 0.865 |
| 4.183 | 0.87 |
| 4.184 | 0.875 |
| 4.185 | 0.88 |
| 4.186 | 0.884 |
| 4.187 | 0.889 |
| 4.188 | 0.894 |
| 4.189 | 0.899 |
| 4.19 | 0.904 |
| 4.191 | 0.909 |
| 4.192 | 0.914 |
| 4.193 | 0.919 |
| 4.194 | 0.924 |
| 4.195 | 0.928 |
| 4.196 | 0.933 |
| 4.197 | 0.938 |
| 4.198 | 0.943 |
| 4.199 | 0.948 |
| 4.2 | 0.953 |
| 4.201 | 0.958 |
| 4.202 | 0.962 |
| 4.203 | 0.967 |
| 4.204 | 0.972 |
| 4.205 | 0.977 |
| 4.206 | 0.982 |
| 4.207 | 0.987 |
| 4.208 | 0.992 |
| 4.209 | 0.997 |
| 4.21 | 1.002 |
| 4.211 | 1.007 |
| 4.212 | 1.012 |
| 4.213 | 1.016 |
| 4.214 | 1.021 |
| 4.215 | 1.026 |
| 4.216 | 1.031 |
| 4.217 | 1.036 |
| 4.218 | 1.041 |
| 4.219 | 1.046 |
| 4.22 | 1.051 |
| 4.221 | 1.056 |
| 4.222 | 1.061 |
| 4.223 | 1.066 |
| 4.224 | 1.07 |
| 4.225 | 1.075 |
| 4.226 | 1.08 |
| 4.227 | 1.085 |
| 4.228 | 1.09 |
| 4.229 | 1.095 |
| 4.23 | 1.1 |
| 4.231 | 1.105 |
| 4.232 | 1.11 |
| 4.233 | 1.115 |
| 4.234 | 1.12 |
| 4.235 | 1.125 |
| 4.236 | 1.13 |
| 4.237 | 1.134 |
| 4.238 | 1.139 |
| 4.239 | 1.144 |
| 4.24 | 1.149 |
| 4.241 | 1.154 |
| 4.242 | 1.159 |
| 4.243 | 1.164 |
| 4.244 | 1.169 |
| 4.245 | 1.174 |
| 4.246 | 1.179 |
| 4.247 | 1.184 |
| 4.248 | 1.189 |
| 4.249 | 1.194 |
| 4.25 | 1.199 |
| 4.251 | 1.204 |
| 4.252 | 1.209 |
| 4.253 | 1.214 |
| 4.254 | 1.219 |
| 4.255 | 1.224 |
| 4.256 | 1.229 |
| 4.257 | 1.234 |
| 4.258 | 1.239 |
| 4.259 | 1.244 |
| 4.26 | 1.248 |
| 4.261 | 1.254 |
| 4.262 | 1.258 |
| 4.263 | 1.263 |
| 4.264 | 1.268 |
| 4.265 | 1.273 |
| 4.266 | 1.278 |
| 4.267 | 1.283 |
| 4.268 | 1.288 |
| 4.269 | 1.293 |
| 4.27 | 1.298 |
| 4.271 | 1.303 |
| 4.272 | 1.308 |
| 4.273 | 1.313 |
| 4.274 | 1.318 |
| 4.275 | 1.323 |
| 4.276 | 1.328 |
| 4.277 | 1.333 |
| 4.278 | 1.338 |
| 4.279 | 1.343 |
| 4.28 | 1.348 |
| 4.281 | 1.353 |
| 4.282 | 1.358 |
| 4.283 | 1.363 |
| 4.284 | 1.368 |
| 4.285 | 1.373 |
| 4.286 | 1.378 |
| 4.287 | 1.383 |
| 4.288 | 1.388 |
| 4.289 | 1.393 |
| 4.29 | 1.398 |
| 4.291 | 1.403 |
| 4.292 | 1.408 |
| 4.293 | 1.414 |
| 4.294 | 1.418 |
| 4.295 | 1.424 |
| 4.296 | 1.428 |
| 4.297 | 1.434 |
| 4.298 | 1.439 |
| 4.299 | 1.444 |
| 4.3 | 1.449 |
| 4.301 | 1.454 |
| 4.302 | 1.459 |
| 4.303 | 1.464 |
| 4.304 | 1.469 |
| 4.305 | 1.474 |
| 4.306 | 1.479 |
| 4.307 | 1.484 |
| 4.308 | 1.489 |
| 4.309 | 1.494 |
| 4.31 | 1.499 |
| 4.311 | 1.504 |
| 4.312 | 1.509 |
| 4.313 | 1.514 |
| 4.314 | 1.519 |
| 4.315 | 1.524 |
| 4.316 | 1.529 |
| 4.317 | 1.534 |
| 4.318 | 1.54 |
| 4.319 | 1.545 |
| 4.32 | 1.55 |
| 4.321 | 1.555 |
| 4.322 | 1.56 |
| 4.323 | 1.565 |
| 4.324 | 1.57 |
| 4.325 | 1.575 |
| 4.326 | 1.58 |
| 4.327 | 1.585 |
| 4.328 | 1.59 |
| 4.329 | 1.595 |
| 4.33 | 1.6 |
| 4.331 | 1.605 |
| 4.332 | 1.61 |
| 4.333 | 1.616 |
| 4.334 | 1.621 |
| 4.335 | 1.626 |
| 4.336 | 1.631 |
| 4.337 | 1.636 |
| 4.338 | 1.641 |
| 4.339 | 1.646 |
| 4.34 | 1.651 |
| 4.341 | 1.656 |
| 4.342 | 1.661 |
| 4.343 | 1.666 |
| 4.344 | 1.672 |
| 4.345 | 1.677 |
| 4.346 | 1.682 |
| 4.347 | 1.687 |
| 4.348 | 1.692 |
| 4.349 | 1.697 |
| 4.35 | 1.702 |
| 4.351 | 1.707 |
| 4.352 | 1.712 |
| 4.353 | 1.718 |
| 4.354 | 1.723 |
| 4.355 | 1.728 |
| 4.356 | 1.733 |
| 4.357 | 1.738 |
| 4.358 | 1.743 |
| 4.359 | 1.748 |
| 4.36 | 1.753 |
| 4.361 | 1.758 |
| 4.362 | 1.764 |
| 4.363 | 1.769 |
| 4.364 | 1.774 |
| 4.365 | 1.779 |
| 4.366 | 1.784 |
| 4.367 | 1.789 |
| 4.368 | 1.794 |
| 4.369 | 1.8 |
| 4.37 | 1.805 |
| 4.371 | 1.81 |
| 4.372 | 1.815 |
| 4.373 | 1.82 |
| 4.374 | 1.825 |
| 4.375 | 1.83 |
| 4.376 | 1.836 |
| 4.377 | 1.841 |
| 4.378 | 1.846 |
| 4.379 | 1.851 |
| 4.38 | 1.856 |
| 4.381 | 1.861 |
| 4.382 | 1.866 |
| 4.383 | 1.872 |
| 4.384 | 1.877 |
| 4.385 | 1.882 |
| 4.386 | 1.887 |
| 4.387 | 1.892 |
| 4.388 | 1.898 |
| 4.389 | 1.903 |
| 4.39 | 1.908 |
| 4.391 | 1.913 |
| 4.392 | 1.918 |
| 4.393 | 1.923 |
| 4.394 | 1.928 |
| 4.395 | 1.934 |
| 4.396 | 1.939 |
| 4.397 | 1.944 |
| 4.398 | 1.949 |
| 4.399 | 1.954 |
| 4.4 | 1.96 |
| 4.401 | 1.965 |
| 4.402 | 1.97 |
| 4.403 | 1.975 |
| 4.404 | 1.98 |
| 4.405 | 1.986 |
| 4.406 | 1.991 |
| 4.407 | 1.996 |
| 4.408 | 2.001 |
| 4.409 | 2.006 |
| 4.41 | 2.012 |
| 4.411 | 2.017 |
| 4.412 | 2.022 |
| 4.413 | 2.027 |
| 4.414 | 2.032 |
| 4.415 | 2.038 |
| 4.416 | 2.043 |
| 4.417 | 2.048 |
| 4.418 | 2.053 |
| 4.419 | 2.058 |
| 4.42 | 2.064 |
| 4.421 | 2.069 |
| 4.422 | 2.074 |
| 4.423 | 2.079 |
| 4.424 | 2.084 |
| 4.425 | 2.09 |
| 4.426 | 2.095 |
| 4.427 | 2.1 |
| 4.428 | 2.106 |
| 4.429 | 2.111 |
| 4.43 | 2.116 |
| 4.431 | 2.121 |
| 4.432 | 2.126 |
| 4.433 | 2.132 |
| 4.434 | 2.137 |
| 4.435 | 2.142 |
| 4.436 | 2.147 |
| 4.437 | 2.153 |
| 4.438 | 2.158 |
| 4.439 | 2.163 |
| 4.44 | 2.168 |
| 4.441 | 2.174 |
| 4.442 | 2.179 |
| 4.443 | 2.184 |
| 4.444 | 2.189 |
| 4.445 | 2.195 |
| 4.446 | 2.2 |
| 4.447 | 2.205 |
| 4.448 | 2.21 |
| 4.449 | 2.216 |
| 4.45 | 2.221 |
| 4.451 | 2.226 |
| 4.452 | 2.231 |
| 4.453 | 2.237 |
| 4.454 | 2.242 |
| 4.455 | 2.247 |
| 4.456 | 2.252 |
| 4.457 | 2.258 |
| 4.458 | 2.263 |
| 4.459 | 2.268 |
| 4.46 | 2.274 |
| 4.461 | 2.279 |
| 4.462 | 2.284 |
| 4.463 | 2.289 |
| 4.464 | 2.295 |
| 4.465 | 2.3 |
| 4.466 | 2.305 |
| 4.467 | 2.311 |
| 4.468 | 2.316 |
| 4.469 | 2.321 |
| 4.47 | 2.326 |
| 4.471 | 2.332 |
| 4.472 | 2.337 |
| 4.473 | 2.342 |
| 4.474 | 2.348 |
| 4.475 | 2.353 |
| 4.476 | 2.358 |
| 4.477 | 2.364 |
| 4.478 | 2.369 |
| 4.479 | 2.374 |
| 4.48 | 2.38 |
| 4.481 | 2.385 |
| 4.482 | 2.39 |
| 4.483 | 2.395 |
| 4.484 | 2.401 |
| 4.485 | 2.406 |
| 4.486 | 2.411 |
| 4.487 | 2.417 |
| 4.488 | 2.422 |
| 4.489 | 2.427 |
| 4.49 | 2.433 |
| 4.491 | 2.438 |
| 4.492 | 2.443 |
| 4.493 | 2.449 |
| 4.494 | 2.454 |
| 4.495 | 2.459 |
| 4.496 | 2.465 |
| 4.497 | 2.47 |
| 4.498 | 2.475 |
| 4.499 | 2.481 |
| 4.5 | 2.486 |
| 4.501 | 2.491 |
| 4.502 | 2.497 |
| 4.503 | 2.502 |
| 4.504 | 2.507 |
| 4.505 | 2.513 |
| 4.506 | 2.518 |
| 4.507 | 2.523 |
| 4.508 | 2.529 |
| 4.509 | 2.534 |
| 4.51 | 2.54 |
| 4.511 | 2.545 |
| 4.512 | 2.55 |
| 4.513 | 2.556 |
| 4.514 | 2.561 |
| 4.515 | 2.566 |
| 4.516 | 2.572 |
| 4.517 | 2.577 |
| 4.518 | 2.582 |
| 4.519 | 2.588 |
| 4.52 | 2.593 |
| 4.521 | 2.598 |
| 4.522 | 2.604 |
| 4.523 | 2.609 |
| 4.524 | 2.615 |
| 4.525 | 2.62 |
| 4.526 | 2.625 |
| 4.527 | 2.631 |
| 4.528 | 2.636 |
| 4.529 | 2.642 |
| 4.53 | 2.647 |
| 4.531 | 2.652 |
| 4.532 | 2.658 |
| 4.533 | 2.663 |
| 4.534 | 2.668 |
| 4.535 | 2.674 |
| 4.536 | 2.679 |
| 4.537 | 2.685 |
| 4.538 | 2.69 |
| 4.539 | 2.696 |
| 4.54 | 2.701 |
| 4.541 | 2.706 |
| 4.542 | 2.712 |
| 4.543 | 2.717 |
| 4.544 | 2.722 |
| 4.545 | 2.728 |
| 4.546 | 2.733 |
| 4.547 | 2.739 |
| 4.548 | 2.744 |
| 4.549 | 2.75 |
| 4.55 | 2.755 |
| 4.551 | 2.76 |
| 4.552 | 2.766 |
| 4.553 | 2.771 |
| 4.554 | 2.777 |
| 4.555 | 2.782 |
| 4.556 | 2.788 |
| 4.557 | 2.793 |
| 4.558 | 2.798 |
| 4.559 | 2.804 |
| 4.56 | 2.809 |
| 4.561 | 2.815 |
| 4.562 | 2.82 |
| 4.563 | 2.826 |
| 4.564 | 2.831 |
| 4.565 | 2.836 |
| 4.566 | 2.842 |
| 4.567 | 2.847 |
| 4.568 | 2.853 |
| 4.569 | 2.858 |
| 4.57 | 2.864 |
| 4.571 | 2.869 |
| 4.572 | 2.875 |
| 4.573 | 2.88 |
| 4.574 | 2.886 |
| 4.575 | 2.891 |
| 4.576 | 2.896 |
| 4.577 | 2.902 |
| 4.578 | 2.907 |
| 4.579 | 2.913 |
| 4.58 | 2.918 |
| 4.581 | 2.924 |
| 4.582 | 2.929 |
| 4.583 | 2.935 |
| 4.584 | 2.94 |
| 4.585 | 2.946 |
| 4.586 | 2.951 |
| 4.587 | 2.957 |
| 4.588 | 2.962 |
| 4.589 | 2.968 |
| 4.59 | 2.973 |
| 4.591 | 2.979 |
| 4.592 | 2.984 |
| 4.593 | 2.99 |
| 4.594 | 2.995 |
| 4.595 | 3 |
| 4.596 | 3.006 |
| 4.597 | 3.012 |
| 4.598 | 3.017 |
| 4.599 | 3.022 |
| 4.6 | 3.028 |
| 4.601 | 3.034 |
| 4.602 | 3.039 |
| 4.603 | 3.044 |
| 4.604 | 3.05 |
| 4.605 | 3.056 |
| 4.606 | 3.061 |
| 4.607 | 3.067 |
| 4.608 | 3.072 |
| 4.609 | 3.078 |
| 4.61 | 3.083 |
| 4.611 | 3.089 |
| 4.612 | 3.094 |
| 4.613 | 3.1 |
| 4.614 | 3.105 |
| 4.615 | 3.111 |
| 4.616 | 3.116 |
| 4.617 | 3.122 |
| 4.618 | 3.127 |
| 4.619 | 3.133 |
| 4.62 | 3.138 |
| 4.621 | 3.144 |
| 4.622 | 3.149 |
| 4.623 | 3.155 |
| 4.624 | 3.16 |
| 4.625 | 3.166 |
| 4.626 | 3.172 |
| 4.627 | 3.177 |
| 4.628 | 3.183 |
| 4.629 | 3.188 |
| 4.63 | 3.194 |
| 4.631 | 3.199 |
| 4.632 | 3.205 |
| 4.633 | 3.21 |
| 4.634 | 3.216 |
| 4.635 | 3.222 |
| 4.636 | 3.227 |
| 4.637 | 3.233 |
| 4.638 | 3.238 |
| 4.639 | 3.244 |
| 4.64 | 3.249 |
| 4.641 | 3.255 |
| 4.642 | 3.26 |
| 4.643 | 3.266 |
| 4.644 | 3.272 |
| 4.645 | 3.277 |
| 4.646 | 3.283 |
| 4.647 | 3.288 |
| 4.648 | 3.294 |
| 4.649 | 3.299 |
| 4.65 | 3.305 |
| 4.651 | 3.311 |
| 4.652 | 3.316 |
| 4.653 | 3.322 |
| 4.654 | 3.327 |
| 4.655 | 3.333 |
| 4.656 | 3.338 |
| 4.657 | 3.344 |
| 4.658 | 3.35 |
| 4.659 | 3.355 |
| 4.66 | 3.361 |
| 4.661 | 3.366 |
| 4.662 | 3.372 |
| 4.663 | 3.378 |
| 4.664 | 3.383 |
| 4.665 | 3.389 |
| 4.666 | 3.394 |
| 4.667 | 3.4 |
| 4.668 | 3.406 |
| 4.669 | 3.411 |
| 4.67 | 3.417 |
| 4.671 | 3.423 |
| 4.672 | 3.428 |
| 4.673 | 3.434 |
| 4.674 | 3.439 |
| 4.675 | 3.445 |
| 4.676 | 3.451 |
| 4.677 | 3.456 |
| 4.678 | 3.462 |
| 4.679 | 3.468 |
| 4.68 | 3.473 |
| 4.681 | 3.479 |
| 4.682 | 3.484 |
| 4.683 | 3.49 |
| 4.684 | 3.496 |
| 4.685 | 3.501 |
| 4.686 | 3.507 |
| 4.687 | 3.513 |
| 4.688 | 3.518 |
| 4.689 | 3.524 |
| 4.69 | 3.53 |
| 4.691 | 3.535 |
| 4.692 | 3.541 |
| 4.693 | 3.546 |
| 4.694 | 3.552 |
| 4.695 | 3.558 |
| 4.696 | 3.563 |
| 4.697 | 3.569 |
| 4.698 | 3.575 |
| 4.699 | 3.58 |
| 4.7 | 3.586 |
| 4.701 | 3.592 |
| 4.702 | 3.597 |
| 4.703 | 3.603 |
| 4.704 | 3.609 |
| 4.705 | 3.614 |
| 4.706 | 3.62 |
| 4.707 | 3.626 |
| 4.708 | 3.631 |
| 4.709 | 3.637 |
| 4.71 | 3.643 |
| 4.711 | 3.648 |
| 4.712 | 3.654 |
| 4.713 | 3.66 |
| 4.714 | 3.666 |
| 4.715 | 3.671 |
| 4.716 | 3.677 |
| 4.717 | 3.683 |
| 4.718 | 3.688 |
| 4.719 | 3.694 |
| 4.72 | 3.7 |
| 4.721 | 3.705 |
| 4.722 | 3.711 |
| 4.723 | 3.717 |
| 4.724 | 3.722 |
| 4.725 | 3.728 |
| 4.726 | 3.734 |
| 4.727 | 3.74 |
| 4.728 | 3.745 |
| 4.729 | 3.751 |
| 4.73 | 3.757 |
| 4.731 | 3.762 |
| 4.732 | 3.768 |
| 4.733 | 3.774 |
| 4.734 | 3.78 |
| 4.735 | 3.785 |
| 4.736 | 3.791 |
| 4.737 | 3.797 |
| 4.738 | 3.802 |
| 4.739 | 3.808 |
| 4.74 | 3.814 |
| 4.741 | 3.82 |
| 4.742 | 3.825 |
| 4.743 | 3.831 |
| 4.744 | 3.837 |
| 4.745 | 3.842 |
| 4.746 | 3.848 |
| 4.747 | 3.854 |
| 4.748 | 3.86 |
| 4.749 | 3.866 |
| 4.75 | 3.871 |
| 4.751 | 3.877 |
| 4.752 | 3.883 |
| 4.753 | 3.888 |
| 4.754 | 3.894 |
| 4.755 | 3.9 |
| 4.756 | 3.906 |
| 4.757 | 3.912 |
| 4.758 | 3.917 |
| 4.759 | 3.923 |
| 4.76 | 3.929 |
| 4.761 | 3.934 |
| 4.762 | 3.94 |
| 4.763 | 3.946 |
| 4.764 | 3.952 |
| 4.765 | 3.958 |
| 4.766 | 3.963 |
| 4.767 | 3.969 |
| 4.768 | 3.975 |
| 4.769 | 3.981 |
| 4.77 | 3.986 |
| 4.771 | 3.992 |
| 4.772 | 3.998 |
| 4.773 | 4.004 |
| 4.774 | 4.01 |
| 4.775 | 4.015 |
| 4.776 | 4.021 |
| 4.777 | 4.027 |
| 4.778 | 4.033 |
| 4.779 | 4.038 |
| 4.78 | 4.044 |
| 4.781 | 4.05 |
| 4.782 | 4.056 |
| 4.783 | 4.062 |
| 4.784 | 4.068 |
| 4.785 | 4.073 |
| 4.786 | 4.079 |
| 4.787 | 4.085 |
| 4.788 | 4.091 |
| 4.789 | 4.096 |
| 4.79 | 4.102 |
| 4.791 | 4.108 |
| 4.792 | 4.114 |
| 4.793 | 4.12 |
| 4.794 | 4.126 |
| 4.795 | 4.131 |
| 4.796 | 4.137 |
| 4.797 | 4.143 |
| 4.798 | 4.149 |
| 4.799 | 4.155 |
| 4.8 | 4.16 |
| 4.801 | 4.166 |
| 4.802 | 4.172 |
| 4.803 | 4.178 |
| 4.804 | 4.184 |
| 4.805 | 4.19 |
| 4.806 | 4.196 |
| 4.807 | 4.201 |
| 4.808 | 4.207 |
| 4.809 | 4.213 |
| 4.81 | 4.219 |
| 4.811 | 4.225 |
| 4.812 | 4.231 |
| 4.813 | 4.236 |
| 4.814 | 4.242 |
| 4.815 | 4.248 |
| 4.816 | 4.254 |
| 4.817 | 4.26 |
| 4.818 | 4.266 |
| 4.819 | 4.272 |
| 4.82 | 4.277 |
| 4.821 | 4.283 |
| 4.822 | 4.289 |
| 4.823 | 4.295 |
| 4.824 | 4.301 |
| 4.825 | 4.307 |
| 4.826 | 4.313 |
| 4.827 | 4.318 |
| 4.828 | 4.324 |
| 4.829 | 4.33 |
| 4.83 | 4.336 |
| 4.831 | 4.342 |
| 4.832 | 4.348 |
| 4.833 | 4.354 |
| 4.834 | 4.36 |
| 4.835 | 4.366 |
| 4.836 | 4.371 |
| 4.837 | 4.377 |
| 4.838 | 4.383 |
| 4.839 | 4.389 |
| 4.84 | 4.395 |
| 4.841 | 4.401 |
| 4.842 | 4.407 |
| 4.843 | 4.413 |
| 4.844 | 4.418 |
| 4.845 | 4.424 |
| 4.846 | 4.43 |
| 4.847 | 4.436 |
| 4.848 | 4.442 |
| 4.849 | 4.448 |
| 4.85 | 4.454 |
| 4.851 | 4.46 |
| 4.852 | 4.466 |
| 4.853 | 4.472 |
| 4.854 | 4.478 |
| 4.855 | 4.484 |
| 4.856 | 4.49 |
| 4.857 | 4.495 |
| 4.858 | 4.501 |
| 4.859 | 4.507 |
| 4.86 | 4.513 |
| 4.861 | 4.519 |
| 4.862 | 4.525 |
| 4.863 | 4.531 |
| 4.864 | 4.537 |
| 4.865 | 4.543 |
| 4.866 | 4.549 |
| 4.867 | 4.555 |
| 4.868 | 4.561 |
| 4.869 | 4.567 |
| 4.87 | 4.572 |
| 4.871 | 4.578 |
| 4.872 | 4.584 |
| 4.873 | 4.59 |
| 4.874 | 4.596 |
| 4.875 | 4.602 |
| 4.876 | 4.608 |
| 4.877 | 4.614 |
| 4.878 | 4.62 |
| 4.879 | 4.626 |
| 4.88 | 4.632 |
| 4.881 | 4.638 |
| 4.882 | 4.644 |
| 4.883 | 4.65 |
| 4.884 | 4.656 |
| 4.885 | 4.662 |
| 4.886 | 4.668 |
| 4.887 | 4.674 |
| 4.888 | 4.68 |
| 4.889 | 4.686 |
| 4.89 | 4.692 |
| 4.891 | 4.698 |
| 4.892 | 4.704 |
| 4.893 | 4.71 |
| 4.894 | 4.716 |
| 4.895 | 4.722 |
| 4.896 | 4.728 |
| 4.897 | 4.734 |
| 4.898 | 4.74 |
| 4.899 | 4.746 |
| 4.9 | 4.752 |
| 4.901 | 4.758 |
| 4.902 | 4.764 |
| 4.903 | 4.77 |
| 4.904 | 4.776 |
| 4.905 | 4.782 |
| 4.906 | 4.788 |
| 4.907 | 4.794 |
| 4.908 | 4.8 |
| 4.909 | 4.806 |
| 4.91 | 4.812 |
| 4.911 | 4.818 |
| 4.912 | 4.824 |
| 4.913 | 4.83 |
| 4.914 | 4.836 |
| 4.915 | 4.842 |
| 4.916 | 4.848 |
| 4.917 | 4.854 |
| 4.918 | 4.86 |
| 4.919 | 4.866 |
| 4.92 | 4.872 |
| 4.921 | 4.878 |
| 4.922 | 4.884 |
| 4.923 | 4.89 |
| 4.924 | 4.896 |
| 4.925 | 4.902 |
| 4.926 | 4.908 |
| 4.927 | 4.914 |
| 4.928 | 4.92 |
| 4.929 | 4.926 |
| 4.93 | 4.932 |
| 4.931 | 4.938 |
| 4.932 | 4.944 |
| 4.933 | 4.95 |
| 4.934 | 4.956 |
| 4.935 | 4.963 |
| 4.936 | 4.969 |
| 4.937 | 4.975 |
| 4.938 | 4.981 |
| 4.939 | 4.987 |
| 4.94 | 4.993 |
| 4.941 | 4.999 |
| 4.942 | 5.005 |
| 4.943 | 5.011 |
| 4.944 | 5.017 |
| 4.945 | 5.023 |
| 4.946 | 5.029 |
| 4.947 | 5.035 |
| 4.948 | 5.041 |
| 4.949 | 5.048 |
| 4.95 | 5.054 |
| 4.951 | 5.06 |
| 4.952 | 5.066 |
| 4.953 | 5.072 |
| 4.954 | 5.078 |
| 4.955 | 5.084 |
| 4.956 | 5.09 |
| 4.957 | 5.096 |
| 4.958 | 5.102 |
| 4.959 | 5.108 |
| 4.96 | 5.114 |
| 4.961 | 5.121 |
| 4.962 | 5.127 |
| 4.963 | 5.133 |
| 4.964 | 5.139 |
| 4.965 | 5.145 |
| 4.966 | 5.151 |
| 4.967 | 5.157 |
| 4.968 | 5.163 |
| 4.969 | 5.17 |
| 4.97 | 5.176 |
| 4.971 | 5.182 |
| 4.972 | 5.188 |
| 4.973 | 5.194 |
| 4.974 | 5.2 |
| 4.975 | 5.206 |
| 4.976 | 5.212 |
| 4.977 | 5.218 |
| 4.978 | 5.225 |
| 4.979 | 5.231 |
| 4.98 | 5.237 |
| 4.981 | 5.243 |
| 4.982 | 5.249 |
| 4.983 | 5.255 |
| 4.984 | 5.261 |
| 4.985 | 5.268 |
| 4.986 | 5.274 |
| 4.987 | 5.28 |
| 4.988 | 5.286 |
| 4.989 | 5.292 |
| 4.99 | 5.298 |
| 4.991 | 5.304 |
| 4.992 | 5.311 |
| 4.993 | 5.317 |
| 4.994 | 5.323 |
| 4.995 | 5.329 |
| 4.996 | 5.335 |
| 4.997 | 5.341 |
| 4.998 | 5.348 |
| 4.999 | 5.354 |
| 5.0 | 5.36 |
| 5.001 | 5.366 |
| 5.002 | 5.372 |
| 5.003 | 5.378 |
| 5.004 | 5.385 |
| 5.005 | 5.391 |
| 5.006 | 5.397 |
| 5.007 | 5.403 |
| 5.008 | 5.409 |
| 5.009 | 5.416 |
| 5.01 | 5.422 |
| 5.011 | 5.428 |
| 5.012 | 5.434 |
| 5.013 | 5.44 |
| 5.014 | 5.446 |
| 5.015 | 5.453 |
| 5.016 | 5.459 |
| 5.017 | 5.465 |
| 5.018 | 5.471 |
| 5.019 | 5.477 |
| 5.02 | 5.484 |
| 5.021 | 5.49 |
| 5.022 | 5.496 |
| 5.023 | 5.502 |
| 5.024 | 5.508 |
| 5.025 | 5.515 |
| 5.026 | 5.521 |
| 5.027 | 5.527 |
| 5.028 | 5.533 |
| 5.029 | 5.54 |
| 5.03 | 5.546 |
| 5.031 | 5.552 |
| 5.032 | 5.558 |
| 5.033 | 5.564 |
| 5.034 | 5.571 |
| 5.035 | 5.577 |
| 5.036 | 5.583 |
| 5.037 | 5.589 |
| 5.038 | 5.596 |
| 5.039 | 5.602 |
| 5.04 | 5.608 |
| 5.041 | 5.614 |
| 5.042 | 5.62 |
| 5.043 | 5.627 |
| 5.044 | 5.633 |
| 5.045 | 5.639 |
| 5.046 | 5.646 |
| 5.047 | 5.652 |
| 5.048 | 5.658 |
| 5.049 | 5.664 |
| 5.05 | 5.67 |
| 5.051 | 5.677 |
| 5.052 | 5.683 |
| 5.053 | 5.689 |
| 5.054 | 5.696 |
| 5.055 | 5.702 |
| 5.056 | 5.708 |
| 5.057 | 5.714 |
| 5.058 | 5.721 |
| 5.059 | 5.727 |
| 5.06 | 5.733 |
| 5.061 | 5.74 |
| 5.062 | 5.746 |
| 5.063 | 5.752 |
| 5.064 | 5.758 |
| 5.065 | 5.765 |
| 5.066 | 5.771 |
| 5.067 | 5.777 |
| 5.068 | 5.783 |
| 5.069 | 5.79 |
| 5.07 | 5.796 |
| 5.071 | 5.802 |
| 5.072 | 5.809 |
| 5.073 | 5.815 |
| 5.074 | 5.821 |
| 5.075 | 5.828 |
| 5.076 | 5.834 |
| 5.077 | 5.84 |
| 5.078 | 5.846 |
| 5.079 | 5.853 |
| 5.08 | 5.859 |
| 5.081 | 5.865 |
| 5.082 | 5.872 |
| 5.083 | 5.878 |
| 5.084 | 5.884 |
| 5.085 | 5.891 |
| 5.086 | 5.897 |
| 5.087 | 5.903 |
| 5.088 | 5.91 |
| 5.089 | 5.916 |
| 5.09 | 5.922 |
| 5.091 | 5.929 |
| 5.092 | 5.935 |
| 5.093 | 5.941 |
| 5.094 | 5.948 |
| 5.095 | 5.954 |
| 5.096 | 5.96 |
| 5.097 | 5.967 |
| 5.098 | 5.973 |
| 5.099 | 5.979 |
| 5.1 | 5.986 |
| 5.101 | 5.992 |
| 5.102 | 5.998 |
| 5.103 | 6.005 |
| 5.104 | 6.011 |
| 5.105 | 6.017 |
| 5.106 | 6.024 |
| 5.107 | 6.03 |
| 5.108 | 6.036 |
| 5.109 | 6.043 |
| 5.11 | 6.049 |
| 5.111 | 6.056 |
| 5.112 | 6.062 |
| 5.113 | 6.068 |
| 5.114 | 6.075 |
| 5.115 | 6.081 |
| 5.116 | 6.087 |
| 5.117 | 6.094 |
| 5.118 | 6.1 |
| 5.119 | 6.106 |
| 5.12 | 6.113 |
| 5.121 | 6.119 |
| 5.122 | 6.126 |
| 5.123 | 6.132 |
| 5.124 | 6.138 |
| 5.125 | 6.145 |
| 5.126 | 6.151 |
| 5.127 | 6.158 |
| 5.128 | 6.164 |
| 5.129 | 6.17 |
| 5.13 | 6.177 |
| 5.131 | 6.183 |
| 5.132 | 6.19 |
| 5.133 | 6.196 |
| 5.134 | 6.202 |
| 5.135 | 6.209 |
| 5.136 | 6.215 |
| 5.137 | 6.222 |
| 5.138 | 6.228 |
| 5.139 | 6.234 |
| 5.14 | 6.241 |
| 5.141 | 6.247 |
| 5.142 | 6.254 |
| 5.143 | 6.26 |
| 5.144 | 6.267 |
| 5.145 | 6.273 |
| 5.146 | 6.279 |
| 5.147 | 6.286 |
| 5.148 | 6.292 |
| 5.149 | 6.299 |
| 5.15 | 6.305 |
| 5.151 | 6.312 |
| 5.152 | 6.318 |
| 5.153 | 6.324 |
| 5.154 | 6.331 |
| 5.155 | 6.337 |
| 5.156 | 6.344 |
| 5.157 | 6.35 |
| 5.158 | 6.357 |
| 5.159 | 6.363 |
| 5.16 | 6.37 |
| 5.161 | 6.376 |
| 5.162 | 6.382 |
| 5.163 | 6.389 |
| 5.164 | 6.395 |
| 5.165 | 6.402 |
| 5.166 | 6.408 |
| 5.167 | 6.415 |
| 5.168 | 6.421 |
| 5.169 | 6.428 |
| 5.17 | 6.434 |
| 5.171 | 6.441 |
| 5.172 | 6.447 |
| 5.173 | 6.454 |
| 5.174 | 6.46 |
| 5.175 | 6.467 |
| 5.176 | 6.473 |
| 5.177 | 6.48 |
| 5.178 | 6.486 |
| 5.179 | 6.492 |
| 5.18 | 6.499 |
| 5.181 | 6.506 |
| 5.182 | 6.512 |
| 5.183 | 6.518 |
| 5.184 | 6.525 |
| 5.185 | 6.532 |
| 5.186 | 6.538 |
| 5.187 | 6.544 |
| 5.188 | 6.551 |
| 5.189 | 6.558 |
| 5.19 | 6.564 |
| 5.191 | 6.57 |
| 5.192 | 6.577 |
| 5.193 | 6.584 |
| 5.194 | 6.59 |
| 5.195 | 6.597 |
| 5.196 | 6.603 |
| 5.197 | 6.61 |
| 5.198 | 6.616 |
| 5.199 | 6.623 |
| 5.2 | 6.629 |
| 5.201 | 6.636 |
| 5.202 | 6.642 |
| 5.203 | 6.649 |
| 5.204 | 6.655 |
| 5.205 | 6.662 |
| 5.206 | 6.668 |
| 5.207 | 6.675 |
| 5.208 | 6.682 |
| 5.209 | 6.688 |
| 5.21 | 6.694 |
| 5.211 | 6.701 |
| 5.212 | 6.708 |
| 5.213 | 6.714 |
| 5.214 | 6.721 |
| 5.215 | 6.727 |
| 5.216 | 6.734 |
| 5.217 | 6.74 |
| 5.218 | 6.747 |
| 5.219 | 6.754 |
| 5.22 | 6.76 |
| 5.221 | 6.767 |
| 5.222 | 6.773 |
| 5.223 | 6.78 |
| 5.224 | 6.786 |
| 5.225 | 6.793 |
| 5.226 | 6.8 |
| 5.227 | 6.806 |
| 5.228 | 6.813 |
| 5.229 | 6.819 |
| 5.23 | 6.826 |
| 5.231 | 6.832 |
| 5.232 | 6.839 |
| 5.233 | 6.846 |
| 5.234 | 6.852 |
| 5.235 | 6.859 |
| 5.236 | 6.865 |
| 5.237 | 6.872 |
| 5.238 | 6.878 |
| 5.239 | 6.885 |
| 5.24 | 6.892 |
| 5.241 | 6.898 |
| 5.242 | 6.905 |
| 5.243 | 6.912 |
| 5.244 | 6.918 |
| 5.245 | 6.925 |
| 5.246 | 6.931 |
| 5.247 | 6.938 |
| 5.248 | 6.945 |
| 5.249 | 6.951 |
| 5.25 | 6.958 |
| 5.251 | 6.964 |
| 5.252 | 6.971 |
| 5.253 | 6.978 |
| 5.254 | 6.984 |
| 5.255 | 6.991 |
| 5.256 | 6.998 |
| 5.257 | 7.004 |
| 5.258 | 7.011 |
| 5.259 | 7.018 |
| 5.26 | 7.024 |
| 5.261 | 7.031 |
| 5.262 | 7.037 |
| 5.263 | 7.044 |
| 5.264 | 7.051 |
| 5.265 | 7.057 |
| 5.266 | 7.064 |
| 5.267 | 7.071 |
| 5.268 | 7.077 |
| 5.269 | 7.084 |
| 5.27 | 7.091 |
| 5.271 | 7.097 |
| 5.272 | 7.104 |
| 5.273 | 7.11 |
| 5.274 | 7.117 |
| 5.275 | 7.124 |
| 5.276 | 7.13 |
| 5.277 | 7.137 |
| 5.278 | 7.144 |
| 5.279 | 7.15 |
| 5.28 | 7.157 |
| 5.281 | 7.164 |
| 5.282 | 7.171 |
| 5.283 | 7.177 |
| 5.284 | 7.184 |
| 5.285 | 7.191 |
| 5.286 | 7.197 |
| 5.287 | 7.204 |
| 5.288 | 7.211 |
| 5.289 | 7.217 |
| 5.29 | 7.224 |
| 5.291 | 7.231 |
| 5.292 | 7.237 |
| 5.293 | 7.244 |
| 5.294 | 7.251 |
| 5.295 | 7.258 |
| 5.296 | 7.264 |
| 5.297 | 7.271 |
| 5.298 | 7.278 |
| 5.299 | 7.284 |
| 5.3 | 7.291 |
| 5.301 | 7.298 |
| 5.302 | 7.304 |
| 5.303 | 7.311 |
| 5.304 | 7.318 |
| 5.305 | 7.325 |
| 5.306 | 7.331 |
| 5.307 | 7.338 |
| 5.308 | 7.345 |
| 5.309 | 7.352 |
| 5.31 | 7.358 |
| 5.311 | 7.365 |
| 5.312 | 7.372 |
| 5.313 | 7.378 |
| 5.314 | 7.385 |
| 5.315 | 7.392 |
| 5.316 | 7.399 |
| 5.317 | 7.405 |
| 5.318 | 7.412 |
| 5.319 | 7.419 |
| 5.32 | 7.426 |
| 5.321 | 7.432 |
| 5.322 | 7.439 |
| 5.323 | 7.446 |
| 5.324 | 7.453 |
| 5.325 | 7.459 |
| 5.326 | 7.466 |
| 5.327 | 7.473 |
| 5.328 | 7.48 |
| 5.329 | 7.486 |
| 5.33 | 7.493 |
| 5.331 | 7.5 |
| 5.332 | 7.507 |
| 5.333 | 7.514 |
| 5.334 | 7.52 |
| 5.335 | 7.527 |
| 5.336 | 7.534 |
| 5.337 | 7.541 |
| 5.338 | 7.548 |
| 5.339 | 7.554 |
| 5.34 | 7.561 |
| 5.341 | 7.568 |
| 5.342 | 7.575 |
| 5.343 | 7.581 |
| 5.344 | 7.588 |
| 5.345 | 7.595 |
| 5.346 | 7.602 |
| 5.347 | 7.609 |
| 5.348 | 7.615 |
| 5.349 | 7.622 |
| 5.35 | 7.629 |
| 5.351 | 7.636 |
| 5.352 | 7.643 |
| 5.353 | 7.649 |
| 5.354 | 7.656 |
| 5.355 | 7.663 |
| 5.356 | 7.67 |
| 5.357 | 7.677 |
| 5.358 | 7.684 |
| 5.359 | 7.69 |
| 5.36 | 7.697 |
| 5.361 | 7.704 |
| 5.362 | 7.711 |
| 5.363 | 7.718 |
| 5.364 | 7.724 |
| 5.365 | 7.731 |
| 5.366 | 7.738 |
| 5.367 | 7.745 |
| 5.368 | 7.752 |
| 5.369 | 7.759 |
| 5.37 | 7.766 |
| 5.371 | 7.772 |
| 5.372 | 7.779 |
| 5.373 | 7.786 |
| 5.374 | 7.793 |
| 5.375 | 7.8 |
| 5.376 | 7.807 |
| 5.377 | 7.813 |
| 5.378 | 7.82 |
| 5.379 | 7.827 |
| 5.38 | 7.834 |
| 5.381 | 7.841 |
| 5.382 | 7.848 |
| 5.383 | 7.855 |
| 5.384 | 7.862 |
| 5.385 | 7.868 |
| 5.386 | 7.875 |
| 5.387 | 7.882 |
| 5.388 | 7.889 |
| 5.389 | 7.896 |
| 5.39 | 7.903 |
| 5.391 | 7.91 |
| 5.392 | 7.916 |
| 5.393 | 7.923 |
| 5.394 | 7.93 |
| 5.395 | 7.937 |
| 5.396 | 7.944 |
| 5.397 | 7.951 |
| 5.398 | 7.958 |
| 5.399 | 7.965 |
| 5.4 | 7.972 |
| 5.401 | 7.979 |
| 5.402 | 7.986 |
| 5.403 | 7.992 |
| 5.404 | 7.999 |
| 5.405 | 8.006 |
| 5.406 | 8.013 |
| 5.407 | 8.02 |
| 5.408 | 8.027 |
| 5.409 | 8.034 |
| 5.41 | 8.041 |
| 5.411 | 8.048 |
| 5.412 | 8.055 |
| 5.413 | 8.062 |
| 5.414 | 8.068 |
| 5.415 | 8.075 |
| 5.416 | 8.082 |
| 5.417 | 8.089 |
| 5.418 | 8.096 |
| 5.419 | 8.103 |
| 5.42 | 8.11 |
| 5.421 | 8.117 |
| 5.422 | 8.124 |
| 5.423 | 8.131 |
| 5.424 | 8.138 |
| 5.425 | 8.145 |
| 5.426 | 8.152 |
| 5.427 | 8.159 |
| 5.428 | 8.166 |
| 5.429 | 8.173 |
| 5.43 | 8.18 |
| 5.431 | 8.187 |
| 5.432 | 8.194 |
| 5.433 | 8.2 |
| 5.434 | 8.207 |
| 5.435 | 8.214 |
| 5.436 | 8.221 |
| 5.437 | 8.228 |
| 5.438 | 8.235 |
| 5.439 | 8.242 |
| 5.44 | 8.249 |
| 5.441 | 8.256 |
| 5.442 | 8.263 |
| 5.443 | 8.27 |
| 5.444 | 8.277 |
| 5.445 | 8.284 |
| 5.446 | 8.291 |
| 5.447 | 8.298 |
| 5.448 | 8.305 |
| 5.449 | 8.312 |
| 5.45 | 8.319 |
| 5.451 | 8.326 |
| 5.452 | 8.333 |
| 5.453 | 8.34 |
| 5.454 | 8.347 |
| 5.455 | 8.354 |
| 5.456 | 8.361 |
| 5.457 | 8.368 |
| 5.458 | 8.375 |
| 5.459 | 8.382 |
| 5.46 | 8.389 |
| 5.461 | 8.396 |
| 5.462 | 8.403 |
| 5.463 | 8.41 |
| 5.464 | 8.417 |
| 5.465 | 8.424 |
| 5.466 | 8.431 |
| 5.467 | 8.438 |
| 5.468 | 8.445 |
| 5.469 | 8.452 |
| 5.47 | 8.459 |
| 5.471 | 8.466 |
| 5.472 | 8.474 |
| 5.473 | 8.481 |
| 5.474 | 8.488 |
| 5.475 | 8.495 |
| 5.476 | 8.502 |
| 5.477 | 8.509 |
| 5.478 | 8.516 |
| 5.479 | 8.523 |
| 5.48 | 8.53 |
| 5.481 | 8.537 |
| 5.482 | 8.544 |
| 5.483 | 8.551 |
| 5.484 | 8.558 |
| 5.485 | 8.565 |
| 5.486 | 8.572 |
| 5.487 | 8.579 |
| 5.488 | 8.586 |
| 5.489 | 8.594 |
| 5.49 | 8.601 |
| 5.491 | 8.608 |
| 5.492 | 8.615 |
| 5.493 | 8.622 |
| 5.494 | 8.629 |
| 5.495 | 8.636 |
| 5.496 | 8.643 |
| 5.497 | 8.65 |
| 5.498 | 8.657 |
| 5.499 | 8.664 |
| 5.5 | 8.671 |
| 5.501 | 8.678 |
| 5.502 | 8.686 |
| 5.503 | 8.693 |
| 5.504 | 8.7 |
| 5.505 | 8.707 |
| 5.506 | 8.714 |
| 5.507 | 8.721 |
| 5.508 | 8.728 |
| 5.509 | 8.735 |
| 5.51 | 8.742 |
| 5.511 | 8.75 |
| 5.512 | 8.757 |
| 5.513 | 8.764 |
| 5.514 | 8.771 |
| 5.515 | 8.778 |
| 5.516 | 8.785 |
| 5.517 | 8.792 |
| 5.518 | 8.799 |
| 5.519 | 8.807 |
| 5.52 | 8.814 |
| 5.521 | 8.821 |
| 5.522 | 8.828 |
| 5.523 | 8.835 |
| 5.524 | 8.842 |
| 5.525 | 8.849 |
| 5.526 | 8.857 |
| 5.527 | 8.864 |
| 5.528 | 8.871 |
| 5.529 | 8.878 |
| 5.53 | 8.885 |
| 5.531 | 8.892 |
| 5.532 | 8.9 |
| 5.533 | 8.907 |
| 5.534 | 8.914 |
| 5.535 | 8.921 |
| 5.536 | 8.928 |
| 5.537 | 8.935 |
| 5.538 | 8.942 |
| 5.539 | 8.95 |
| 5.54 | 8.957 |
| 5.541 | 8.964 |
| 5.542 | 8.971 |
| 5.543 | 8.978 |
| 5.544 | 8.986 |
| 5.545 | 8.993 |
| 5.546 | 9 |
| 5.547 | 9.007 |
| 5.548 | 9.014 |
| 5.549 | 9.021 |
| 5.55 | 9.029 |
| 5.551 | 9.036 |
| 5.552 | 9.043 |
| 5.553 | 9.05 |
| 5.554 | 9.057 |
| 5.555 | 9.065 |
| 5.556 | 9.072 |
| 5.557 | 9.079 |
| 5.558 | 9.086 |
| 5.559 | 9.094 |
| 5.56 | 9.101 |
| 5.561 | 9.108 |
| 5.562 | 9.115 |
| 5.563 | 9.122 |
| 5.564 | 9.13 |
| 5.565 | 9.137 |
| 5.566 | 9.144 |
| 5.567 | 9.151 |
| 5.568 | 9.158 |
| 5.569 | 9.166 |
| 5.57 | 9.173 |
| 5.571 | 9.18 |
| 5.572 | 9.187 |
| 5.573 | 9.195 |
| 5.574 | 9.202 |
| 5.575 | 9.209 |
| 5.576 | 9.216 |
| 5.577 | 9.224 |
| 5.578 | 9.231 |
| 5.579 | 9.238 |
| 5.58 | 9.245 |
| 5.581 | 9.253 |
| 5.582 | 9.26 |
| 5.583 | 9.267 |
| 5.584 | 9.274 |
| 5.585 | 9.282 |
| 5.586 | 9.289 |
| 5.587 | 9.296 |
| 5.588 | 9.303 |
| 5.589 | 9.311 |
| 5.59 | 9.318 |
| 5.591 | 9.325 |
| 5.592 | 9.332 |
| 5.593 | 9.34 |
| 5.594 | 9.347 |
| 5.595 | 9.354 |
| 5.596 | 9.362 |
| 5.597 | 9.369 |
| 5.598 | 9.376 |
| 5.599 | 9.384 |
| 5.6 | 9.391 |
| 5.601 | 9.398 |
| 5.602 | 9.405 |
| 5.603 | 9.413 |
| 5.604 | 9.42 |
| 5.605 | 9.427 |
| 5.606 | 9.435 |
| 5.607 | 9.442 |
| 5.608 | 9.449 |
| 5.609 | 9.456 |
| 5.61 | 9.464 |
| 5.611 | 9.471 |
| 5.612 | 9.478 |
| 5.613 | 9.486 |
| 5.614 | 9.493 |
| 5.615 | 9.5 |
| 5.616 | 9.508 |
| 5.617 | 9.515 |
| 5.618 | 9.522 |
| 5.619 | 9.53 |
| 5.62 | 9.537 |
| 5.621 | 9.544 |
| 5.622 | 9.552 |
| 5.623 | 9.559 |
| 5.624 | 9.566 |
| 5.625 | 9.574 |
| 5.626 | 9.581 |
| 5.627 | 9.588 |
| 5.628 | 9.596 |
| 5.629 | 9.603 |
| 5.63 | 9.61 |
| 5.631 | 9.618 |
| 5.632 | 9.625 |
| 5.633 | 9.633 |
| 5.634 | 9.64 |
| 5.635 | 9.647 |
| 5.636 | 9.655 |
| 5.637 | 9.662 |
| 5.638 | 9.669 |
| 5.639 | 9.677 |
| 5.64 | 9.684 |
| 5.641 | 9.692 |
| 5.642 | 9.699 |
| 5.643 | 9.706 |
| 5.644 | 9.714 |
| 5.645 | 9.721 |
| 5.646 | 9.728 |
| 5.647 | 9.736 |
| 5.648 | 9.743 |
| 5.649 | 9.751 |
| 5.65 | 9.758 |
| 5.651 | 9.765 |
| 5.652 | 9.773 |
| 5.653 | 9.78 |
| 5.654 | 9.788 |
| 5.655 | 9.795 |
| 5.656 | 9.802 |
| 5.657 | 9.81 |
| 5.658 | 9.817 |
| 5.659 | 9.825 |
| 5.66 | 9.832 |
| 5.661 | 9.84 |
| 5.662 | 9.847 |
| 5.663 | 9.854 |
| 5.664 | 9.862 |
| 5.665 | 9.869 |
| 5.666 | 9.877 |
| 5.667 | 9.884 |
| 5.668 | 9.892 |
| 5.669 | 9.899 |
| 5.67 | 9.906 |
| 5.671 | 9.914 |
| 5.672 | 9.921 |
| 5.673 | 9.929 |
| 5.674 | 9.936 |
| 5.675 | 9.944 |
| 5.676 | 9.951 |
| 5.677 | 9.958 |
| 5.678 | 9.966 |
| 5.679 | 9.973 |
| 5.68 | 9.981 |
| 5.681 | 9.988 |
| 5.682 | 9.996 |
| 5.683 | 10.003 |
| 5.684 | 10.011 |
| 5.685 | 10.018 |
| 5.686 | 10.026 |
| 5.687 | 10.033 |
| 5.688 | 10.04 |
| 5.689 | 10.048 |
| 5.69 | 10.056 |
| 5.691 | 10.063 |
| 5.692 | 10.07 |
| 5.693 | 10.078 |
| 5.694 | 10.085 |
| 5.695 | 10.093 |
| 5.696 | 10.1 |
| 5.697 | 10.108 |
| 5.698 | 10.115 |
| 5.699 | 10.123 |
| 5.7 | 10.13 |
| 5.701 | 10.138 |
| 5.702 | 10.145 |
| 5.703 | 10.153 |
| 5.704 | 10.16 |
| 5.705 | 10.168 |
| 5.706 | 10.175 |
| 5.707 | 10.183 |
| 5.708 | 10.19 |
| 5.709 | 10.198 |
| 5.71 | 10.205 |
| 5.711 | 10.213 |
| 5.712 | 10.22 |
| 5.713 | 10.228 |
| 5.714 | 10.236 |
| 5.715 | 10.243 |
| 5.716 | 10.251 |
| 5.717 | 10.258 |
| 5.718 | 10.266 |
| 5.719 | 10.273 |
| 5.72 | 10.281 |
| 5.721 | 10.288 |
| 5.722 | 10.296 |
| 5.723 | 10.303 |
| 5.724 | 10.311 |
| 5.725 | 10.318 |
| 5.726 | 10.326 |
| 5.727 | 10.334 |
| 5.728 | 10.341 |
| 5.729 | 10.349 |
| 5.73 | 10.356 |
| 5.731 | 10.364 |
| 5.732 | 10.371 |
| 5.733 | 10.379 |
| 5.734 | 10.386 |
| 5.735 | 10.394 |
| 5.736 | 10.402 |
| 5.737 | 10.409 |
| 5.738 | 10.417 |
| 5.739 | 10.424 |
| 5.74 | 10.432 |
| 5.741 | 10.44 |
| 5.742 | 10.447 |
| 5.743 | 10.455 |
| 5.744 | 10.462 |
| 5.745 | 10.47 |
| 5.746 | 10.477 |
| 5.747 | 10.485 |
| 5.748 | 10.493 |
| 5.749 | 10.5 |
| 5.75 | 10.508 |
| 5.751 | 10.515 |
| 5.752 | 10.523 |
| 5.753 | 10.531 |
| 5.754 | 10.538 |
| 5.755 | 10.546 |
| 5.756 | 10.553 |
| 5.757 | 10.561 |
| 5.758 | 10.569 |
| 5.759 | 10.576 |
| 5.76 | 10.584 |
| 5.761 | 10.592 |
| 5.762 | 10.599 |
| 5.763 | 10.607 |
| 5.764 | 10.614 |
| 5.765 | 10.622 |
| 5.766 | 10.63 |
| 5.767 | 10.637 |
| 5.768 | 10.645 |
| 5.769 | 10.653 |
| 5.77 | 10.66 |
| 5.771 | 10.668 |
| 5.772 | 10.676 |
| 5.773 | 10.683 |
| 5.774 | 10.691 |
| 5.775 | 10.698 |
| 5.776 | 10.706 |
| 5.777 | 10.714 |
| 5.778 | 10.721 |
| 5.779 | 10.729 |
| 5.78 | 10.737 |
| 5.781 | 10.744 |
| 5.782 | 10.752 |
| 5.783 | 10.76 |
| 5.784 | 10.767 |
| 5.785 | 10.775 |
| 5.786 | 10.783 |
| 5.787 | 10.79 |
| 5.788 | 10.798 |
| 5.789 | 10.806 |
| 5.79 | 10.814 |
| 5.791 | 10.821 |
| 5.792 | 10.829 |
| 5.793 | 10.837 |
| 5.794 | 10.844 |
| 5.795 | 10.852 |
| 5.796 | 10.86 |
| 5.797 | 10.867 |
| 5.798 | 10.875 |
| 5.799 | 10.883 |
| 5.8 | 10.89 |
| 5.801 | 10.898 |
| 5.802 | 10.906 |
| 5.803 | 10.914 |
| 5.804 | 10.921 |
| 5.805 | 10.929 |
| 5.806 | 10.937 |
| 5.807 | 10.944 |
| 5.808 | 10.952 |
| 5.809 | 10.96 |
| 5.81 | 10.968 |
| 5.811 | 10.975 |
| 5.812 | 10.983 |
| 5.813 | 10.991 |
| 5.814 | 10.999 |
| 5.815 | 11.006 |
| 5.816 | 11.014 |
| 5.817 | 11.022 |
| 5.818 | 11.03 |
| 5.819 | 11.037 |
| 5.82 | 11.045 |
| 5.821 | 11.053 |
| 5.822 | 11.06 |
| 5.823 | 11.068 |
| 5.824 | 11.076 |
| 5.825 | 11.084 |
| 5.826 | 11.092 |
| 5.827 | 11.099 |
| 5.828 | 11.107 |
| 5.829 | 11.115 |
| 5.83 | 11.123 |
| 5.831 | 11.13 |
| 5.832 | 11.138 |
| 5.833 | 11.146 |
| 5.834 | 11.154 |
| 5.835 | 11.162 |
| 5.836 | 11.169 |
| 5.837 | 11.177 |
| 5.838 | 11.185 |
| 5.839 | 11.193 |
| 5.84 | 11.2 |
| 5.841 | 11.208 |
| 5.842 | 11.216 |
| 5.843 | 11.224 |
| 5.844 | 11.232 |
| 5.845 | 11.239 |
| 5.846 | 11.247 |
| 5.847 | 11.255 |
| 5.848 | 11.263 |
| 5.849 | 11.271 |
| 5.85 | 11.278 |
| 5.851 | 11.286 |
| 5.852 | 11.294 |
| 5.853 | 11.302 |
| 5.854 | 11.31 |
| 5.855 | 11.318 |
| 5.856 | 11.325 |
| 5.857 | 11.333 |
| 5.858 | 11.341 |
| 5.859 | 11.349 |
| 5.86 | 11.357 |
| 5.861 | 11.364 |
| 5.862 | 11.372 |
| 5.863 | 11.38 |
| 5.864 | 11.388 |
| 5.865 | 11.396 |
| 5.866 | 11.404 |
| 5.867 | 11.412 |
| 5.868 | 11.419 |
| 5.869 | 11.427 |
| 5.87 | 11.435 |
| 5.871 | 11.443 |
| 5.872 | 11.451 |
| 5.873 | 11.459 |
| 5.874 | 11.467 |
| 5.875 | 11.474 |
| 5.876 | 11.482 |
| 5.877 | 11.49 |
| 5.878 | 11.498 |
| 5.879 | 11.506 |
| 5.88 | 11.514 |
| 5.881 | 11.522 |
| 5.882 | 11.53 |
| 5.883 | 11.537 |
| 5.884 | 11.545 |
| 5.885 | 11.553 |
| 5.886 | 11.561 |
| 5.887 | 11.569 |
| 5.888 | 11.577 |
| 5.889 | 11.585 |
| 5.89 | 11.593 |
| 5.891 | 11.601 |
| 5.892 | 11.608 |
| 5.893 | 11.616 |
| 5.894 | 11.624 |
| 5.895 | 11.632 |
| 5.896 | 11.64 |
| 5.897 | 11.648 |
| 5.898 | 11.656 |
| 5.899 | 11.664 |
| 5.9 | 11.672 |
| 5.901 | 11.68 |
| 5.902 | 11.688 |
| 5.903 | 11.696 |
| 5.904 | 11.704 |
| 5.905 | 11.711 |
| 5.906 | 11.719 |
| 5.907 | 11.727 |
| 5.908 | 11.735 |
| 5.909 | 11.743 |
| 5.91 | 11.751 |
| 5.911 | 11.759 |
| 5.912 | 11.767 |
| 5.913 | 11.775 |
| 5.914 | 11.783 |
| 5.915 | 11.791 |
| 5.916 | 11.799 |
| 5.917 | 11.807 |
| 5.918 | 11.815 |
| 5.919 | 11.823 |
| 5.92 | 11.831 |
| 5.921 | 11.839 |
| 5.922 | 11.846 |
| 5.923 | 11.854 |
| 5.924 | 11.862 |
| 5.925 | 11.87 |
| 5.926 | 11.878 |
| 5.927 | 11.886 |
| 5.928 | 11.894 |
| 5.929 | 11.902 |
| 5.93 | 11.91 |
| 5.931 | 11.918 |
| 5.932 | 11.926 |
| 5.933 | 11.934 |
| 5.934 | 11.942 |
| 5.935 | 11.95 |
| 5.936 | 11.958 |
| 5.937 | 11.966 |
| 5.938 | 11.974 |
| 5.939 | 11.982 |
| 5.94 | 11.99 |
| 5.941 | 11.998 |
| 5.942 | 12.006 |
| 5.943 | 12.014 |
| 5.944 | 12.022 |
| 5.945 | 12.03 |
| 5.946 | 12.038 |
| 5.947 | 12.046 |
| 5.948 | 12.054 |
| 5.949 | 12.062 |
| 5.95 | 12.07 |
| 5.951 | 12.078 |
| 5.952 | 12.087 |
| 5.953 | 12.095 |
| 5.954 | 12.103 |
| 5.955 | 12.111 |
| 5.956 | 12.119 |
| 5.957 | 12.127 |
| 5.958 | 12.135 |
| 5.959 | 12.143 |
| 5.96 | 12.151 |
| 5.961 | 12.159 |
| 5.962 | 12.167 |
| 5.963 | 12.175 |
| 5.964 | 12.183 |
| 5.965 | 12.191 |
| 5.966 | 12.199 |
| 5.967 | 12.207 |
| 5.968 | 12.215 |
| 5.969 | 12.224 |
| 5.97 | 12.232 |
| 5.971 | 12.24 |
| 5.972 | 12.248 |
| 5.973 | 12.256 |
| 5.974 | 12.264 |
| 5.975 | 12.272 |
| 5.976 | 12.28 |
| 5.977 | 12.288 |
| 5.978 | 12.296 |
| 5.979 | 12.304 |
| 5.98 | 12.312 |
| 5.981 | 12.32 |
| 5.982 | 12.329 |
| 5.983 | 12.337 |
| 5.984 | 12.345 |
| 5.985 | 12.353 |
| 5.986 | 12.361 |
| 5.987 | 12.369 |
| 5.988 | 12.377 |
| 5.989 | 12.385 |
| 5.99 | 12.394 |
| 5.991 | 12.402 |
| 5.992 | 12.41 |
| 5.993 | 12.418 |
| 5.994 | 12.426 |
| 5.995 | 12.434 |
| 5.996 | 12.442 |
| 5.997 | 12.45 |
| 5.998 | 12.458 |
| 5.999 | 12.467 |
| 6.0 | 12.475 |
| 6.001 | 12.483 |
| 6.002 | 12.491 |
| 6.003 | 12.499 |
| 6.004 | 12.507 |
| 6.005 | 12.516 |
| 6.006 | 12.524 |
| 6.007 | 12.532 |
| 6.008 | 12.54 |
| 6.009 | 12.548 |
| 6.01 | 12.556 |
| 6.011 | 12.564 |
| 6.012 | 12.573 |
| 6.013 | 12.581 |
| 6.014 | 12.589 |
| 6.015 | 12.597 |
| 6.016 | 12.605 |
| 6.017 | 12.614 |
| 6.018 | 12.622 |
| 6.019 | 12.63 |
| 6.02 | 12.638 |
| 6.021 | 12.646 |
| 6.022 | 12.654 |
| 6.023 | 12.663 |
| 6.024 | 12.671 |
| 6.025 | 12.679 |
| 6.026 | 12.687 |
| 6.027 | 12.695 |
| 6.028 | 12.704 |
| 6.029 | 12.712 |
| 6.03 | 12.72 |
| 6.031 | 12.728 |
| 6.032 | 12.736 |
| 6.033 | 12.745 |
| 6.034 | 12.753 |
| 6.035 | 12.761 |
| 6.036 | 12.769 |
| 6.037 | 12.778 |
| 6.038 | 12.786 |
| 6.039 | 12.794 |
| 6.04 | 12.802 |
| 6.041 | 12.81 |
| 6.042 | 12.819 |
| 6.043 | 12.827 |
| 6.044 | 12.835 |
| 6.045 | 12.843 |
| 6.046 | 12.852 |
| 6.047 | 12.86 |
| 6.048 | 12.868 |
| 6.049 | 12.876 |
| 6.05 | 12.885 |
| 6.051 | 12.893 |
| 6.052 | 12.901 |
| 6.053 | 12.909 |
| 6.054 | 12.918 |
| 6.055 | 12.926 |
| 6.056 | 12.934 |
| 6.057 | 12.942 |
| 6.058 | 12.951 |
| 6.059 | 12.959 |
| 6.06 | 12.967 |
| 6.061 | 12.976 |
| 6.062 | 12.984 |
| 6.063 | 12.992 |
| 6.064 | 13 |
| 6.065 | 13.009 |
| 6.066 | 13.017 |
| 6.067 | 13.025 |
| 6.068 | 13.034 |
| 6.069 | 13.042 |
| 6.07 | 13.05 |
| 6.071 | 13.058 |
| 6.072 | 13.067 |
| 6.073 | 13.075 |
| 6.074 | 13.083 |
| 6.075 | 13.092 |
| 6.076 | 13.1 |
| 6.077 | 13.108 |
| 6.078 | 13.116 |
| 6.079 | 13.125 |
| 6.08 | 13.133 |
| 6.081 | 13.142 |
| 6.082 | 13.15 |
| 6.083 | 13.158 |
| 6.084 | 13.166 |
| 6.085 | 13.175 |
| 6.086 | 13.183 |
| 6.087 | 13.192 |
| 6.088 | 13.2 |
| 6.089 | 13.208 |
| 6.09 | 13.216 |
| 6.091 | 13.225 |
| 6.092 | 13.233 |
| 6.093 | 13.242 |
| 6.094 | 13.25 |
| 6.095 | 13.258 |
| 6.096 | 13.267 |
| 6.097 | 13.275 |
| 6.098 | 13.283 |
| 6.099 | 13.292 |
| 6.1 | 13.3 |
| 6.101 | 13.308 |
| 6.102 | 13.317 |
| 6.103 | 13.325 |
| 6.104 | 13.334 |
| 6.105 | 13.342 |
| 6.106 | 13.35 |
| 6.107 | 13.359 |
| 6.108 | 13.367 |
| 6.109 | 13.375 |
| 6.11 | 13.384 |
| 6.111 | 13.392 |
| 6.112 | 13.401 |
| 6.113 | 13.409 |
| 6.114 | 13.417 |
| 6.115 | 13.426 |
| 6.116 | 13.434 |
| 6.117 | 13.443 |
| 6.118 | 13.451 |
| 6.119 | 13.459 |
| 6.12 | 13.468 |
| 6.121 | 13.476 |
| 6.122 | 13.485 |
| 6.123 | 13.493 |
| 6.124 | 13.502 |
| 6.125 | 13.51 |
| 6.126 | 13.518 |
| 6.127 | 13.527 |
| 6.128 | 13.535 |
| 6.129 | 13.544 |
| 6.13 | 13.552 |
| 6.131 | 13.56 |
| 6.132 | 13.569 |
| 6.133 | 13.577 |
| 6.134 | 13.586 |
| 6.135 | 13.594 |
| 6.136 | 13.603 |
| 6.137 | 13.611 |
| 6.138 | 13.62 |
| 6.139 | 13.628 |
| 6.14 | 13.636 |
| 6.141 | 13.645 |
| 6.142 | 13.653 |
| 6.143 | 13.662 |
| 6.144 | 13.67 |
| 6.145 | 13.679 |
| 6.146 | 13.687 |
| 6.147 | 13.696 |
| 6.148 | 13.704 |
| 6.149 | 13.713 |
| 6.15 | 13.721 |
| 6.151 | 13.73 |
| 6.152 | 13.738 |
| 6.153 | 13.747 |
| 6.154 | 13.755 |
| 6.155 | 13.764 |
| 6.156 | 13.772 |
| 6.157 | 13.781 |
| 6.158 | 13.789 |
| 6.159 | 13.798 |
| 6.16 | 13.806 |
| 6.161 | 13.815 |
| 6.162 | 13.823 |
| 6.163 | 13.832 |
| 6.164 | 13.84 |
| 6.165 | 13.849 |
| 6.166 | 13.857 |
| 6.167 | 13.866 |
| 6.168 | 13.874 |
| 6.169 | 13.883 |
| 6.17 | 13.891 |
| 6.171 | 13.9 |
| 6.172 | 13.908 |
| 6.173 | 13.917 |
| 6.174 | 13.925 |
| 6.175 | 13.934 |
| 6.176 | 13.942 |
| 6.177 | 13.951 |
| 6.178 | 13.96 |
| 6.179 | 13.968 |
| 6.18 | 13.977 |
| 6.181 | 13.985 |
| 6.182 | 13.994 |
| 6.183 | 14.002 |
| 6.184 | 14.011 |
| 6.185 | 14.02 |
| 6.186 | 14.028 |
| 6.187 | 14.037 |
| 6.188 | 14.045 |
| 6.189 | 14.054 |
| 6.19 | 14.062 |
| 6.191 | 14.071 |
| 6.192 | 14.08 |
| 6.193 | 14.088 |
| 6.194 | 14.097 |
| 6.195 | 14.105 |
| 6.196 | 14.114 |
| 6.197 | 14.122 |
| 6.198 | 14.131 |
| 6.199 | 14.14 |
| 6.2 | 14.148 |
| 6.201 | 14.157 |
| 6.202 | 14.165 |
| 6.203 | 14.174 |
| 6.204 | 14.183 |
| 6.205 | 14.191 |
| 6.206 | 14.2 |
| 6.207 | 14.208 |
| 6.208 | 14.217 |
| 6.209 | 14.226 |
| 6.21 | 14.234 |
| 6.211 | 14.243 |
| 6.212 | 14.252 |
| 6.213 | 14.26 |
| 6.214 | 14.269 |
| 6.215 | 14.277 |
| 6.216 | 14.286 |
| 6.217 | 14.295 |
| 6.218 | 14.303 |
| 6.219 | 14.312 |
| 6.22 | 14.321 |
| 6.221 | 14.329 |
| 6.222 | 14.338 |
| 6.223 | 14.346 |
| 6.224 | 14.355 |
| 6.225 | 14.364 |
| 6.226 | 14.372 |
| 6.227 | 14.381 |
| 6.228 | 14.39 |
| 6.229 | 14.398 |
| 6.23 | 14.407 |
| 6.231 | 14.416 |
| 6.232 | 14.424 |
| 6.233 | 14.433 |
| 6.234 | 14.442 |
| 6.235 | 14.45 |
| 6.236 | 14.459 |
| 6.237 | 14.468 |
| 6.238 | 14.477 |
| 6.239 | 14.485 |
| 6.24 | 14.494 |
| 6.241 | 14.503 |
| 6.242 | 14.511 |
| 6.243 | 14.52 |
| 6.244 | 14.529 |
| 6.245 | 14.538 |
| 6.246 | 14.546 |
| 6.247 | 14.555 |
| 6.248 | 14.564 |
| 6.249 | 14.572 |
| 6.25 | 14.581 |
| 6.251 | 14.59 |
| 6.252 | 14.598 |
| 6.253 | 14.607 |
| 6.254 | 14.616 |
| 6.255 | 14.625 |
| 6.256 | 14.633 |
| 6.257 | 14.642 |
| 6.258 | 14.651 |
| 6.259 | 14.66 |
| 6.26 | 14.668 |
| 6.261 | 14.677 |
| 6.262 | 14.686 |
| 6.263 | 14.694 |
| 6.264 | 14.703 |
| 6.265 | 14.712 |
| 6.266 | 14.721 |
| 6.267 | 14.73 |
| 6.268 | 14.738 |
| 6.269 | 14.747 |
| 6.27 | 14.756 |
| 6.271 | 14.765 |
| 6.272 | 14.773 |
| 6.273 | 14.782 |
| 6.274 | 14.791 |
| 6.275 | 14.8 |
| 6.276 | 14.808 |
| 6.277 | 14.817 |
| 6.278 | 14.826 |
| 6.279 | 14.835 |
| 6.28 | 14.844 |
| 6.281 | 14.852 |
| 6.282 | 14.861 |
| 6.283 | 14.87 |
| 6.284 | 14.879 |
| 6.285 | 14.888 |
| 6.286 | 14.896 |
| 6.287 | 14.905 |
| 6.288 | 14.914 |
| 6.289 | 14.923 |
| 6.29 | 14.932 |
| 6.291 | 14.94 |
| 6.292 | 14.949 |
| 6.293 | 14.958 |
| 6.294 | 14.967 |
| 6.295 | 14.976 |
| 6.296 | 14.984 |
| 6.297 | 14.993 |
| 6.298 | 15.002 |
| 6.299 | 15.011 |
| 6.3 | 15.02 |
| 6.301 | 15.029 |
| 6.302 | 15.038 |
| 6.303 | 15.046 |
| 6.304 | 15.055 |
| 6.305 | 15.064 |
| 6.306 | 15.073 |
| 6.307 | 15.082 |
| 6.308 | 15.091 |
| 6.309 | 15.099 |
| 6.31 | 15.108 |
| 6.311 | 15.117 |
| 6.312 | 15.126 |
| 6.313 | 15.135 |
| 6.314 | 15.144 |
| 6.315 | 15.153 |
| 6.316 | 15.162 |
| 6.317 | 15.17 |
| 6.318 | 15.179 |
| 6.319 | 15.188 |
| 6.32 | 15.197 |
| 6.321 | 15.206 |
| 6.322 | 15.215 |
| 6.323 | 15.224 |
| 6.324 | 15.233 |
| 6.325 | 15.242 |
| 6.326 | 15.25 |
| 6.327 | 15.259 |
| 6.328 | 15.268 |
| 6.329 | 15.277 |
| 6.33 | 15.286 |
| 6.331 | 15.295 |
| 6.332 | 15.304 |
| 6.333 | 15.313 |
| 6.334 | 15.322 |
| 6.335 | 15.33 |
| 6.336 | 15.34 |
| 6.337 | 15.348 |
| 6.338 | 15.357 |
| 6.339 | 15.366 |
| 6.34 | 15.375 |
| 6.341 | 15.384 |
| 6.342 | 15.393 |
| 6.343 | 15.402 |
| 6.344 | 15.411 |
| 6.345 | 15.42 |
| 6.346 | 15.429 |
| 6.347 | 15.438 |
| 6.348 | 15.447 |
| 6.349 | 15.456 |
| 6.35 | 15.465 |
| 6.351 | 15.474 |
| 6.352 | 15.483 |
| 6.353 | 15.492 |
| 6.354 | 15.5 |
| 6.355 | 15.51 |
| 6.356 | 15.518 |
| 6.357 | 15.527 |
| 6.358 | 15.536 |
| 6.359 | 15.545 |
| 6.36 | 15.554 |
| 6.361 | 15.563 |
| 6.362 | 15.572 |
| 6.363 | 15.581 |
| 6.364 | 15.59 |
| 6.365 | 15.599 |
| 6.366 | 15.608 |
| 6.367 | 15.617 |
| 6.368 | 15.626 |
| 6.369 | 15.635 |
| 6.37 | 15.644 |
| 6.371 | 15.653 |
| 6.372 | 15.662 |
| 6.373 | 15.671 |
| 6.374 | 15.68 |
| 6.375 | 15.689 |
| 6.376 | 15.698 |
| 6.377 | 15.707 |
| 6.378 | 15.716 |
| 6.379 | 15.725 |
| 6.38 | 15.734 |
| 6.381 | 15.744 |
| 6.382 | 15.752 |
| 6.383 | 15.762 |
| 6.384 | 15.771 |
| 6.385 | 15.78 |
| 6.386 | 15.789 |
| 6.387 | 15.798 |
| 6.388 | 15.807 |
| 6.389 | 15.816 |
| 6.39 | 15.825 |
| 6.391 | 15.834 |
| 6.392 | 15.843 |
| 6.393 | 15.852 |
| 6.394 | 15.861 |
| 6.395 | 15.87 |
| 6.396 | 15.879 |
| 6.397 | 15.888 |
| 6.398 | 15.897 |
| 6.399 | 15.906 |
| 6.4 | 15.916 |
| 6.401 | 15.925 |
| 6.402 | 15.934 |
| 6.403 | 15.943 |
| 6.404 | 15.952 |
| 6.405 | 15.961 |
| 6.406 | 15.97 |
| 6.407 | 15.979 |
| 6.408 | 15.988 |
| 6.409 | 15.997 |
| 6.41 | 16.006 |
| 6.411 | 16.016 |
| 6.412 | 16.025 |
| 6.413 | 16.034 |
| 6.414 | 16.043 |
| 6.415 | 16.052 |
| 6.416 | 16.061 |
| 6.417 | 16.07 |
| 6.418 | 16.079 |
| 6.419 | 16.089 |
| 6.42 | 16.098 |
| 6.421 | 16.107 |
| 6.422 | 16.116 |
| 6.423 | 16.125 |
| 6.424 | 16.134 |
| 6.425 | 16.143 |
| 6.426 | 16.152 |
| 6.427 | 16.162 |
| 6.428 | 16.171 |
| 6.429 | 16.18 |
| 6.43 | 16.189 |
| 6.431 | 16.198 |
| 6.432 | 16.207 |
| 6.433 | 16.217 |
| 6.434 | 16.226 |
| 6.435 | 16.235 |
| 6.436 | 16.244 |
| 6.437 | 16.253 |
| 6.438 | 16.262 |
| 6.439 | 16.272 |
| 6.44 | 16.281 |
| 6.441 | 16.29 |
| 6.442 | 16.299 |
| 6.443 | 16.308 |
| 6.444 | 16.317 |
| 6.445 | 16.327 |
| 6.446 | 16.336 |
| 6.447 | 16.345 |
| 6.448 | 16.354 |
| 6.449 | 16.363 |
| 6.45 | 16.373 |
| 6.451 | 16.382 |
| 6.452 | 16.391 |
| 6.453 | 16.4 |
| 6.454 | 16.41 |
| 6.455 | 16.419 |
| 6.456 | 16.428 |
| 6.457 | 16.437 |
| 6.458 | 16.446 |
| 6.459 | 16.456 |
| 6.46 | 16.465 |
| 6.461 | 16.474 |
| 6.462 | 16.483 |
| 6.463 | 16.493 |
| 6.464 | 16.502 |
| 6.465 | 16.511 |
| 6.466 | 16.52 |
| 6.467 | 16.53 |
| 6.468 | 16.539 |
| 6.469 | 16.548 |
| 6.47 | 16.557 |
| 6.471 | 16.567 |
| 6.472 | 16.576 |
| 6.473 | 16.585 |
| 6.474 | 16.594 |
| 6.475 | 16.604 |
| 6.476 | 16.613 |
| 6.477 | 16.622 |
| 6.478 | 16.632 |
| 6.479 | 16.641 |
| 6.48 | 16.65 |
| 6.481 | 16.659 |
| 6.482 | 16.669 |
| 6.483 | 16.678 |
| 6.484 | 16.687 |
| 6.485 | 16.696 |
| 6.486 | 16.706 |
| 6.487 | 16.715 |
| 6.488 | 16.724 |
| 6.489 | 16.734 |
| 6.49 | 16.743 |
| 6.491 | 16.752 |
| 6.492 | 16.762 |
| 6.493 | 16.771 |
| 6.494 | 16.78 |
| 6.495 | 16.79 |
| 6.496 | 16.799 |
| 6.497 | 16.808 |
| 6.498 | 16.818 |
| 6.499 | 16.827 |
| 6.5 | 16.836 |
| 6.501 | 16.846 |
| 6.502 | 16.855 |
| 6.503 | 16.864 |
| 6.504 | 16.874 |
| 6.505 | 16.883 |
| 6.506 | 16.892 |
| 6.507 | 16.902 |
| 6.508 | 16.911 |
| 6.509 | 16.92 |
| 6.51 | 16.93 |
| 6.511 | 16.939 |
| 6.512 | 16.948 |
| 6.513 | 16.958 |
| 6.514 | 16.967 |
| 6.515 | 16.976 |
| 6.516 | 16.986 |
| 6.517 | 16.995 |
| 6.518 | 17.005 |
| 6.519 | 17.014 |
| 6.52 | 17.023 |
| 6.521 | 17.033 |
| 6.522 | 17.042 |
| 6.523 | 17.052 |
| 6.524 | 17.061 |
| 6.525 | 17.07 |
| 6.526 | 17.08 |
| 6.527 | 17.089 |
| 6.528 | 17.098 |
| 6.529 | 17.108 |
| 6.53 | 17.117 |
| 6.531 | 17.127 |
| 6.532 | 17.136 |
| 6.533 | 17.146 |
| 6.534 | 17.155 |
| 6.535 | 17.164 |
| 6.536 | 17.174 |
| 6.537 | 17.183 |
| 6.538 | 17.193 |
| 6.539 | 17.202 |
| 6.54 | 17.212 |
| 6.541 | 17.221 |
| 6.542 | 17.23 |
| 6.543 | 17.24 |
| 6.544 | 17.249 |
| 6.545 | 17.259 |
| 6.546 | 17.268 |
| 6.547 | 17.278 |
| 6.548 | 17.287 |
| 6.549 | 17.297 |
| 6.55 | 17.306 |
| 6.551 | 17.316 |
| 6.552 | 17.325 |
| 6.553 | 17.334 |
| 6.554 | 17.344 |
| 6.555 | 17.353 |
| 6.556 | 17.363 |
| 6.557 | 17.372 |
| 6.558 | 17.382 |
| 6.559 | 17.391 |
| 6.56 | 17.401 |
| 6.561 | 17.41 |
| 6.562 | 17.42 |
| 6.563 | 17.429 |
| 6.564 | 17.439 |
| 6.565 | 17.448 |
| 6.566 | 17.458 |
| 6.567 | 17.467 |
| 6.568 | 17.477 |
| 6.569 | 17.486 |
| 6.57 | 17.496 |
| 6.571 | 17.505 |
| 6.572 | 17.515 |
| 6.573 | 17.524 |
| 6.574 | 17.534 |
| 6.575 | 17.543 |
| 6.576 | 17.553 |
| 6.577 | 17.562 |
| 6.578 | 17.572 |
| 6.579 | 17.582 |
| 6.58 | 17.591 |
| 6.581 | 17.601 |
| 6.582 | 17.61 |
| 6.583 | 17.62 |
| 6.584 | 17.629 |
| 6.585 | 17.639 |
| 6.586 | 17.648 |
| 6.587 | 17.658 |
| 6.588 | 17.667 |
| 6.589 | 17.677 |
| 6.59 | 17.686 |
| 6.591 | 17.696 |
| 6.592 | 17.706 |
| 6.593 | 17.715 |
| 6.594 | 17.725 |
| 6.595 | 17.734 |
| 6.596 | 17.744 |
| 6.597 | 17.754 |
| 6.598 | 17.763 |
| 6.599 | 17.773 |
| 6.6 | 17.782 |
| 6.601 | 17.792 |
| 6.602 | 17.802 |
| 6.603 | 17.811 |
| 6.604 | 17.821 |
| 6.605 | 17.83 |
| 6.606 | 17.84 |
| 6.607 | 17.85 |
| 6.608 | 17.859 |
| 6.609 | 17.869 |
| 6.61 | 17.878 |
| 6.611 | 17.888 |
| 6.612 | 17.898 |
| 6.613 | 17.907 |
| 6.614 | 17.917 |
| 6.615 | 17.926 |
| 6.616 | 17.936 |
| 6.617 | 17.946 |
| 6.618 | 17.955 |
| 6.619 | 17.965 |
| 6.62 | 17.975 |
| 6.621 | 17.984 |
| 6.622 | 17.994 |
| 6.623 | 18.004 |
| 6.624 | 18.013 |
| 6.625 | 18.023 |
| 6.626 | 18.033 |
| 6.627 | 18.042 |
| 6.628 | 18.052 |
| 6.629 | 18.062 |
| 6.63 | 18.071 |
| 6.631 | 18.081 |
| 6.632 | 18.091 |
| 6.633 | 18.1 |
| 6.634 | 18.11 |
| 6.635 | 18.12 |
| 6.636 | 18.129 |
| 6.637 | 18.139 |
| 6.638 | 18.149 |
| 6.639 | 18.158 |
| 6.64 | 18.168 |
| 6.641 | 18.178 |
| 6.642 | 18.188 |
| 6.643 | 18.197 |
| 6.644 | 18.207 |
| 6.645 | 18.217 |
| 6.646 | 18.226 |
| 6.647 | 18.236 |
| 6.648 | 18.246 |
| 6.649 | 18.256 |
| 6.65 | 18.265 |
| 6.651 | 18.275 |
| 6.652 | 18.285 |
| 6.653 | 18.294 |
| 6.654 | 18.304 |
| 6.655 | 18.314 |
| 6.656 | 18.324 |
| 6.657 | 18.333 |
| 6.658 | 18.343 |
| 6.659 | 18.353 |
| 6.66 | 18.363 |
| 6.661 | 18.372 |
| 6.662 | 18.382 |
| 6.663 | 18.392 |
| 6.664 | 18.402 |
| 6.665 | 18.411 |
| 6.666 | 18.421 |
| 6.667 | 18.431 |
| 6.668 | 18.441 |
| 6.669 | 18.45 |
| 6.67 | 18.46 |
| 6.671 | 18.47 |
| 6.672 | 18.48 |
| 6.673 | 18.49 |
| 6.674 | 18.499 |
| 6.675 | 18.509 |
| 6.676 | 18.519 |
| 6.677 | 18.529 |
| 6.678 | 18.538 |
| 6.679 | 18.548 |
| 6.68 | 18.558 |
| 6.681 | 18.568 |
| 6.682 | 18.578 |
| 6.683 | 18.588 |
| 6.684 | 18.597 |
| 6.685 | 18.607 |
| 6.686 | 18.617 |
| 6.687 | 18.627 |
| 6.688 | 18.637 |
| 6.689 | 18.646 |
| 6.69 | 18.656 |
| 6.691 | 18.666 |
| 6.692 | 18.676 |
| 6.693 | 18.686 |
| 6.694 | 18.696 |
| 6.695 | 18.706 |
| 6.696 | 18.715 |
| 6.697 | 18.725 |
| 6.698 | 18.735 |
| 6.699 | 18.745 |
| 6.7 | 18.755 |
| 6.701 | 18.765 |
| 6.702 | 18.774 |
| 6.703 | 18.784 |
| 6.704 | 18.794 |
| 6.705 | 18.804 |
| 6.706 | 18.814 |
| 6.707 | 18.824 |
| 6.708 | 18.834 |
| 6.709 | 18.844 |
| 6.71 | 18.853 |
| 6.711 | 18.863 |
| 6.712 | 18.873 |
| 6.713 | 18.883 |
| 6.714 | 18.893 |
| 6.715 | 18.903 |
| 6.716 | 18.913 |
| 6.717 | 18.923 |
| 6.718 | 18.933 |
| 6.719 | 18.942 |
| 6.72 | 18.952 |
| 6.721 | 18.962 |
| 6.722 | 18.972 |
| 6.723 | 18.982 |
| 6.724 | 18.992 |
| 6.725 | 19.002 |
| 6.726 | 19.012 |
| 6.727 | 19.022 |
| 6.728 | 19.032 |
| 6.729 | 19.042 |
| 6.73 | 19.052 |
| 6.731 | 19.062 |
| 6.732 | 19.072 |
| 6.733 | 19.082 |
| 6.734 | 19.091 |
| 6.735 | 19.101 |
| 6.736 | 19.111 |
| 6.737 | 19.121 |
| 6.738 | 19.131 |
| 6.739 | 19.141 |
| 6.74 | 19.151 |
| 6.741 | 19.161 |
| 6.742 | 19.171 |
| 6.743 | 19.181 |
| 6.744 | 19.191 |
| 6.745 | 19.201 |
| 6.746 | 19.211 |
| 6.747 | 19.221 |
| 6.748 | 19.231 |
| 6.749 | 19.241 |
| 6.75 | 19.251 |
| 6.751 | 19.261 |
| 6.752 | 19.271 |
| 6.753 | 19.281 |
| 6.754 | 19.291 |
| 6.755 | 19.301 |
| 6.756 | 19.311 |
| 6.757 | 19.321 |
| 6.758 | 19.331 |
| 6.759 | 19.341 |
| 6.76 | 19.351 |
| 6.761 | 19.361 |
| 6.762 | 19.371 |
| 6.763 | 19.381 |
| 6.764 | 19.391 |
| 6.765 | 19.401 |
| 6.766 | 19.411 |
| 6.767 | 19.421 |
| 6.768 | 19.431 |
| 6.769 | 19.441 |
| 6.77 | 19.451 |
| 6.771 | 19.462 |
| 6.772 | 19.472 |
| 6.773 | 19.482 |
| 6.774 | 19.492 |
| 6.775 | 19.502 |
| 6.776 | 19.512 |
| 6.777 | 19.522 |
| 6.778 | 19.532 |
| 6.779 | 19.542 |
| 6.78 | 19.552 |
| 6.781 | 19.562 |
| 6.782 | 19.572 |
| 6.783 | 19.582 |
| 6.784 | 19.592 |
| 6.785 | 19.602 |
| 6.786 | 19.613 |
| 6.787 | 19.623 |
| 6.788 | 19.633 |
| 6.789 | 19.643 |
| 6.79 | 19.653 |
| 6.791 | 19.663 |
| 6.792 | 19.673 |
| 6.793 | 19.683 |
| 6.794 | 19.693 |
| 6.795 | 19.704 |
| 6.796 | 19.714 |
| 6.797 | 19.724 |
| 6.798 | 19.734 |
| 6.799 | 19.744 |
| 6.8 | 19.754 |
| 6.801 | 19.764 |
| 6.802 | 19.774 |
| 6.803 | 19.785 |
| 6.804 | 19.795 |
| 6.805 | 19.805 |
| 6.806 | 19.815 |
| 6.807 | 19.825 |
| 6.808 | 19.835 |
| 6.809 | 19.846 |
| 6.81 | 19.856 |
| 6.811 | 19.866 |
| 6.812 | 19.876 |
| 6.813 | 19.886 |
| 6.814 | 19.896 |
| 6.815 | 19.906 |
| 6.816 | 19.917 |
| 6.817 | 19.927 |
| 6.818 | 19.937 |
| 6.819 | 19.947 |
| 6.82 | 19.957 |
| 6.821 | 19.968 |
| 6.822 | 19.978 |
| 6.823 | 19.988 |
| 6.824 | 19.998 |
| 6.825 | 20.008 |
| 6.826 | 20.018 |
| 6.827 | 20.029 |
| 6.828 | 20.039 |
| 6.829 | 20.049 |
| 6.83 | 20.059 |
| 6.831 | 20.07 |
| 6.832 | 20.08 |
| 6.833 | 20.09 |
| 6.834 | 20.1 |
| 6.835 | 20.11 |
| 6.836 | 20.121 |
| 6.837 | 20.131 |
| 6.838 | 20.141 |
| 6.839 | 20.151 |
| 6.84 | 20.162 |
| 6.841 | 20.172 |
| 6.842 | 20.182 |
| 6.843 | 20.192 |
| 6.844 | 20.203 |
| 6.845 | 20.213 |
| 6.846 | 20.223 |
| 6.847 | 20.234 |
| 6.848 | 20.244 |
| 6.849 | 20.254 |
| 6.85 | 20.264 |
| 6.851 | 20.274 |
| 6.852 | 20.285 |
| 6.853 | 20.295 |
| 6.854 | 20.305 |
| 6.855 | 20.316 |
| 6.856 | 20.326 |
| 6.857 | 20.336 |
| 6.858 | 20.346 |
| 6.859 | 20.357 |
| 6.86 | 20.367 |
| 6.861 | 20.377 |
| 6.862 | 20.388 |
| 6.863 | 20.398 |
| 6.864 | 20.408 |
| 6.865 | 20.419 |
| 6.866 | 20.429 |
| 6.867 | 20.439 |
| 6.868 | 20.45 |
| 6.869 | 20.46 |
| 6.87 | 20.47 |
| 6.871 | 20.481 |
| 6.872 | 20.491 |
| 6.873 | 20.501 |
| 6.874 | 20.512 |
| 6.875 | 20.522 |
| 6.876 | 20.532 |
| 6.877 | 20.543 |
| 6.878 | 20.553 |
| 6.879 | 20.563 |
| 6.88 | 20.574 |
| 6.881 | 20.584 |
| 6.882 | 20.594 |
| 6.883 | 20.605 |
| 6.884 | 20.615 |
| 6.885 | 20.626 |
| 6.886 | 20.636 |
| 6.887 | 20.646 |
| 6.888 | 20.657 |
| 6.889 | 20.667 |
| 6.89 | 20.677 |
| 6.891 | 20.688 |
| 6.892 | 20.698 |
| 6.893 | 20.709 |
| 6.894 | 20.719 |
| 6.895 | 20.729 |
| 6.896 | 20.74 |
| 6.897 | 20.75 |
| 6.898 | 20.761 |
| 6.899 | 20.771 |
| 6.9 | 20.781 |
| 6.901 | 20.792 |
| 6.902 | 20.802 |
| 6.903 | 20.813 |
| 6.904 | 20.823 |
| 6.905 | 20.834 |
| 6.906 | 20.844 |
| 6.907 | 20.854 |
| 6.908 | 20.865 |
| 6.909 | 20.875 |
| 6.91 | 20.886 |
| 6.911 | 20.896 |
| 6.912 | 20.907 |
| 6.913 | 20.917 |
| 6.914 | 20.928 |
| 6.915 | 20.938 |
| 6.916 | 20.948 |
| 6.917 | 20.959 |
| 6.918 | 20.969 |
| 6.919 | 20.98 |
| 6.92 | 20.99 |
| 6.921 | 21.001 |
| 6.922 | 21.011 |
| 6.923 | 21.022 |
| 6.924 | 21.032 |
| 6.925 | 21.043 |
| 6.926 | 21.053 |
| 6.927 | 21.064 |
| 6.928 | 21.074 |
| 6.929 | 21.085 |
| 6.93 | 21.095 |
| 6.931 | 21.106 |
| 6.932 | 21.116 |
| 6.933 | 21.127 |
| 6.934 | 21.137 |
| 6.935 | 21.148 |
| 6.936 | 21.158 |
| 6.937 | 21.169 |
| 6.938 | 21.179 |
| 6.939 | 21.19 |
| 6.94 | 21.2 |
| 6.941 | 21.211 |
| 6.942 | 21.221 |
| 6.943 | 21.232 |
| 6.944 | 21.242 |
| 6.945 | 21.253 |
| 6.946 | 21.264 |
| 6.947 | 21.274 |
| 6.948 | 21.285 |
| 6.949 | 21.295 |
| 6.95 | 21.306 |
| 6.951 | 21.316 |
| 6.952 | 21.327 |
| 6.953 | 21.338 |
| 6.954 | 21.348 |
| 6.955 | 21.359 |
| 6.956 | 21.369 |
| 6.957 | 21.38 |
| 6.958 | 21.39 |
| 6.959 | 21.401 |
| 6.96 | 21.412 |
| 6.961 | 21.422 |
| 6.962 | 21.433 |
| 6.963 | 21.443 |
| 6.964 | 21.454 |
| 6.965 | 21.464 |
| 6.966 | 21.475 |
| 6.967 | 21.486 |
| 6.968 | 21.496 |
| 6.969 | 21.507 |
| 6.97 | 21.518 |
| 6.971 | 21.528 |
| 6.972 | 21.539 |
| 6.973 | 21.549 |
| 6.974 | 21.56 |
| 6.975 | 21.571 |
| 6.976 | 21.581 |
| 6.977 | 21.592 |
| 6.978 | 21.603 |
| 6.979 | 21.613 |
| 6.98 | 21.624 |
| 6.981 | 21.635 |
| 6.982 | 21.645 |
| 6.983 | 21.656 |
| 6.984 | 21.666 |
| 6.985 | 21.677 |
| 6.986 | 21.688 |
| 6.987 | 21.698 |
| 6.988 | 21.709 |
| 6.989 | 21.72 |
| 6.99 | 21.73 |
| 6.991 | 21.741 |
| 6.992 | 21.752 |
| 6.993 | 21.763 |
| 6.994 | 21.773 |
| 6.995 | 21.784 |
| 6.996 | 21.795 |
| 6.997 | 21.805 |
| 6.998 | 21.816 |
| 6.999 | 21.827 |
| 7.0 | 21.837 |
| 7.001 | 21.848 |
| 7.002 | 21.859 |
| 7.003 | 21.87 |
| 7.004 | 21.88 |
| 7.005 | 21.891 |
| 7.006 | 21.902 |
| 7.007 | 21.912 |
| 7.008 | 21.923 |
| 7.009 | 21.934 |
| 7.01 | 21.945 |
| 7.011 | 21.955 |
| 7.012 | 21.966 |
| 7.013 | 21.977 |
| 7.014 | 21.988 |
| 7.015 | 21.998 |
| 7.016 | 22.009 |
| 7.017 | 22.02 |
| 7.018 | 22.031 |
| 7.019 | 22.041 |
| 7.02 | 22.052 |
| 7.021 | 22.063 |
| 7.022 | 22.074 |
| 7.023 | 22.084 |
| 7.024 | 22.095 |
| 7.025 | 22.106 |
| 7.026 | 22.117 |
| 7.027 | 22.128 |
| 7.028 | 22.138 |
| 7.029 | 22.149 |
| 7.03 | 22.16 |
| 7.031 | 22.171 |
| 7.032 | 22.182 |
| 7.033 | 22.192 |
| 7.034 | 22.203 |
| 7.035 | 22.214 |
| 7.036 | 22.225 |
| 7.037 | 22.236 |
| 7.038 | 22.246 |
| 7.039 | 22.257 |
| 7.04 | 22.268 |
| 7.041 | 22.279 |
| 7.042 | 22.29 |
| 7.043 | 22.301 |
| 7.044 | 22.311 |
| 7.045 | 22.322 |
| 7.046 | 22.333 |
| 7.047 | 22.344 |
| 7.048 | 22.355 |
| 7.049 | 22.366 |
| 7.05 | 22.376 |
| 7.051 | 22.387 |
| 7.052 | 22.398 |
| 7.053 | 22.409 |
| 7.054 | 22.42 |
| 7.055 | 22.431 |
| 7.056 | 22.442 |
| 7.057 | 22.452 |
| 7.058 | 22.463 |
| 7.059 | 22.474 |
| 7.06 | 22.485 |
| 7.061 | 22.496 |
| 7.062 | 22.507 |
| 7.063 | 22.518 |
| 7.064 | 22.529 |
| 7.065 | 22.54 |
| 7.066 | 22.55 |
| 7.067 | 22.561 |
| 7.068 | 22.572 |
| 7.069 | 22.583 |
| 7.07 | 22.594 |
| 7.071 | 22.605 |
| 7.072 | 22.616 |
| 7.073 | 22.627 |
| 7.074 | 22.638 |
| 7.075 | 22.649 |
| 7.076 | 22.66 |
| 7.077 | 22.671 |
| 7.078 | 22.682 |
| 7.079 | 22.692 |
| 7.08 | 22.704 |
| 7.081 | 22.714 |
| 7.082 | 22.725 |
| 7.083 | 22.736 |
| 7.084 | 22.747 |
| 7.085 | 22.758 |
| 7.086 | 22.769 |
| 7.087 | 22.78 |
| 7.088 | 22.791 |
| 7.089 | 22.802 |
| 7.09 | 22.813 |
| 7.091 | 22.824 |
| 7.092 | 22.835 |
| 7.093 | 22.846 |
| 7.094 | 22.857 |
| 7.095 | 22.868 |
| 7.096 | 22.879 |
| 7.097 | 22.89 |
| 7.098 | 22.901 |
| 7.099 | 22.912 |
| 7.1 | 22.923 |
| 7.101 | 22.934 |
| 7.102 | 22.945 |
| 7.103 | 22.956 |
| 7.104 | 22.967 |
| 7.105 | 22.978 |
| 7.106 | 22.989 |
| 7.107 | 23 |
| 7.108 | 23.011 |
| 7.109 | 23.022 |
| 7.11 | 23.033 |
| 7.111 | 23.044 |
| 7.112 | 23.055 |
| 7.113 | 23.066 |
| 7.114 | 23.077 |
| 7.115 | 23.088 |
| 7.116 | 23.1 |
| 7.117 | 23.111 |
| 7.118 | 23.122 |
| 7.119 | 23.133 |
| 7.12 | 23.144 |
| 7.121 | 23.155 |
| 7.122 | 23.166 |
| 7.123 | 23.177 |
| 7.124 | 23.188 |
| 7.125 | 23.199 |
| 7.126 | 23.21 |
| 7.127 | 23.221 |
| 7.128 | 23.232 |
| 7.129 | 23.244 |
| 7.13 | 23.255 |
| 7.131 | 23.266 |
| 7.132 | 23.277 |
| 7.133 | 23.288 |
| 7.134 | 23.299 |
| 7.135 | 23.31 |
| 7.136 | 23.321 |
| 7.137 | 23.332 |
| 7.138 | 23.344 |
| 7.139 | 23.355 |
| 7.14 | 23.366 |
| 7.141 | 23.377 |
| 7.142 | 23.388 |
| 7.143 | 23.399 |
| 7.144 | 23.41 |
| 7.145 | 23.421 |
| 7.146 | 23.433 |
| 7.147 | 23.444 |
| 7.148 | 23.455 |
| 7.149 | 23.466 |
| 7.15 | 23.477 |
| 7.151 | 23.488 |
| 7.152 | 23.5 |
| 7.153 | 23.511 |
| 7.154 | 23.522 |
| 7.155 | 23.533 |
| 7.156 | 23.544 |
| 7.157 | 23.555 |
| 7.158 | 23.567 |
| 7.159 | 23.578 |
| 7.16 | 23.589 |
| 7.161 | 23.6 |
| 7.162 | 23.611 |
| 7.163 | 23.622 |
| 7.164 | 23.634 |
| 7.165 | 23.645 |
| 7.166 | 23.656 |
| 7.167 | 23.667 |
| 7.168 | 23.679 |
| 7.169 | 23.69 |
| 7.17 | 23.701 |
| 7.171 | 23.712 |
| 7.172 | 23.724 |
| 7.173 | 23.735 |
| 7.174 | 23.746 |
| 7.175 | 23.757 |
| 7.176 | 23.768 |
| 7.177 | 23.78 |
| 7.178 | 23.791 |
| 7.179 | 23.802 |
| 7.18 | 23.813 |
| 7.181 | 23.825 |
| 7.182 | 23.836 |
| 7.183 | 23.847 |
| 7.184 | 23.858 |
| 7.185 | 23.87 |
| 7.186 | 23.881 |
| 7.187 | 23.892 |
| 7.188 | 23.904 |
| 7.189 | 23.915 |
| 7.19 | 23.926 |
| 7.191 | 23.937 |
| 7.192 | 23.949 |
| 7.193 | 23.96 |
| 7.194 | 23.971 |
| 7.195 | 23.983 |
| 7.196 | 23.994 |
| 7.197 | 24.005 |
| 7.198 | 24.016 |
| 7.199 | 24.028 |
| 7.2 | 24.039 |
| 7.201 | 24.05 |
| 7.202 | 24.062 |
| 7.203 | 24.073 |
| 7.204 | 24.084 |
| 7.205 | 24.096 |
| 7.206 | 24.107 |
| 7.207 | 24.118 |
| 7.208 | 24.13 |
| 7.209 | 24.141 |
| 7.21 | 24.152 |
| 7.211 | 24.164 |
| 7.212 | 24.175 |
| 7.213 | 24.186 |
| 7.214 | 24.198 |
| 7.215 | 24.209 |
| 7.216 | 24.221 |
| 7.217 | 24.232 |
| 7.218 | 24.243 |
| 7.219 | 24.255 |
| 7.22 | 24.266 |
| 7.221 | 24.277 |
| 7.222 | 24.289 |
| 7.223 | 24.3 |
| 7.224 | 24.312 |
| 7.225 | 24.323 |
| 7.226 | 24.334 |
| 7.227 | 24.346 |
| 7.228 | 24.357 |
| 7.229 | 24.369 |
| 7.23 | 24.38 |
| 7.231 | 24.391 |
| 7.232 | 24.403 |
| 7.233 | 24.414 |
| 7.234 | 24.426 |
| 7.235 | 24.437 |
| 7.236 | 24.448 |
| 7.237 | 24.46 |
| 7.238 | 24.471 |
| 7.239 | 24.483 |
| 7.24 | 24.494 |
| 7.241 | 24.506 |
| 7.242 | 24.517 |
| 7.243 | 24.529 |
| 7.244 | 24.54 |
| 7.245 | 24.552 |
| 7.246 | 24.563 |
| 7.247 | 24.574 |
| 7.248 | 24.586 |
| 7.249 | 24.597 |
| 7.25 | 24.609 |
| 7.251 | 24.62 |
| 7.252 | 24.632 |
| 7.253 | 24.643 |
| 7.254 | 24.655 |
| 7.255 | 24.666 |
| 7.256 | 24.678 |
| 7.257 | 24.689 |
| 7.258 | 24.701 |
| 7.259 | 24.712 |
| 7.26 | 24.724 |
| 7.261 | 24.735 |
| 7.262 | 24.747 |
| 7.263 | 24.758 |
| 7.264 | 24.77 |
| 7.265 | 24.781 |
| 7.266 | 24.793 |
| 7.267 | 24.804 |
| 7.268 | 24.816 |
| 7.269 | 24.828 |
| 7.27 | 24.839 |
| 7.271 | 24.851 |
| 7.272 | 24.862 |
| 7.273 | 24.874 |
| 7.274 | 24.885 |
| 7.275 | 24.897 |
| 7.276 | 24.908 |
| 7.277 | 24.92 |
| 7.278 | 24.931 |
| 7.279 | 24.943 |
| 7.28 | 24.955 |
| 7.281 | 24.966 |
| 7.282 | 24.978 |
| 7.283 | 24.989 |
| 7.284 | 25.001 |
| 7.285 | 25.012 |
| 7.286 | 25.024 |
| 7.287 | 25.036 |
| 7.288 | 25.047 |
| 7.289 | 25.059 |
| 7.29 | 25.07 |
| 7.291 | 25.082 |
| 7.292 | 25.094 |
| 7.293 | 25.105 |
| 7.294 | 25.117 |
| 7.295 | 25.128 |
| 7.296 | 25.14 |
| 7.297 | 25.152 |
| 7.298 | 25.163 |
| 7.299 | 25.175 |
| 7.3 | 25.187 |
| 7.301 | 25.198 |
| 7.302 | 25.21 |
| 7.303 | 25.222 |
| 7.304 | 25.233 |
| 7.305 | 25.245 |
| 7.306 | 25.256 |
| 7.307 | 25.268 |
| 7.308 | 25.28 |
| 7.309 | 25.292 |
| 7.31 | 25.303 |
| 7.311 | 25.315 |
| 7.312 | 25.326 |
| 7.313 | 25.338 |
| 7.314 | 25.35 |
| 7.315 | 25.362 |
| 7.316 | 25.373 |
| 7.317 | 25.385 |
| 7.318 | 25.397 |
| 7.319 | 25.408 |
| 7.32 | 25.42 |
| 7.321 | 25.432 |
| 7.322 | 25.443 |
| 7.323 | 25.455 |
| 7.324 | 25.467 |
| 7.325 | 25.479 |
| 7.326 | 25.49 |
| 7.327 | 25.502 |
| 7.328 | 25.514 |
| 7.329 | 25.526 |
| 7.33 | 25.537 |
| 7.331 | 25.549 |
| 7.332 | 25.561 |
| 7.333 | 25.572 |
| 7.334 | 25.584 |
| 7.335 | 25.596 |
| 7.336 | 25.608 |
| 7.337 | 25.619 |
| 7.338 | 25.631 |
| 7.339 | 25.643 |
| 7.34 | 25.655 |
| 7.341 | 25.666 |
| 7.342 | 25.678 |
| 7.343 | 25.69 |
| 7.344 | 25.702 |
| 7.345 | 25.714 |
| 7.346 | 25.725 |
| 7.347 | 25.737 |
| 7.348 | 25.749 |
| 7.349 | 25.761 |
| 7.35 | 25.773 |
| 7.351 | 25.784 |
| 7.352 | 25.796 |
| 7.353 | 25.808 |
| 7.354 | 25.82 |
| 7.355 | 25.832 |
| 7.356 | 25.843 |
| 7.357 | 25.855 |
| 7.358 | 25.867 |
| 7.359 | 25.879 |
| 7.36 | 25.891 |
| 7.361 | 25.903 |
| 7.362 | 25.914 |
| 7.363 | 25.926 |
| 7.364 | 25.938 |
| 7.365 | 25.95 |
| 7.366 | 25.962 |
| 7.367 | 25.974 |
| 7.368 | 25.986 |
| 7.369 | 25.997 |
| 7.37 | 26.009 |
| 7.371 | 26.021 |
| 7.372 | 26.033 |
| 7.373 | 26.045 |
| 7.374 | 26.057 |
| 7.375 | 26.069 |
| 7.376 | 26.08 |
| 7.377 | 26.092 |
| 7.378 | 26.104 |
| 7.379 | 26.116 |
| 7.38 | 26.128 |
| 7.381 | 26.14 |
| 7.382 | 26.152 |
| 7.383 | 26.164 |
| 7.384 | 26.176 |
| 7.385 | 26.188 |
| 7.386 | 26.2 |
| 7.387 | 26.211 |
| 7.388 | 26.223 |
| 7.389 | 26.235 |
| 7.39 | 26.247 |
| 7.391 | 26.259 |
| 7.392 | 26.271 |
| 7.393 | 26.283 |
| 7.394 | 26.295 |
| 7.395 | 26.307 |
| 7.396 | 26.319 |
| 7.397 | 26.331 |
| 7.398 | 26.343 |
| 7.399 | 26.355 |
| 7.4 | 26.367 |
| 7.401 | 26.379 |
| 7.402 | 26.391 |
| 7.403 | 26.403 |
| 7.404 | 26.415 |
| 7.405 | 26.427 |
| 7.406 | 26.439 |
| 7.407 | 26.451 |
| 7.408 | 26.462 |
| 7.409 | 26.474 |
| 7.41 | 26.486 |
| 7.411 | 26.498 |
| 7.412 | 26.51 |
| 7.413 | 26.523 |
| 7.414 | 26.535 |
| 7.415 | 26.547 |
| 7.416 | 26.559 |
| 7.417 | 26.571 |
| 7.418 | 26.583 |
| 7.419 | 26.595 |
| 7.42 | 26.607 |
| 7.421 | 26.619 |
| 7.422 | 26.631 |
| 7.423 | 26.643 |
| 7.424 | 26.655 |
| 7.425 | 26.667 |
| 7.426 | 26.679 |
| 7.427 | 26.691 |
| 7.428 | 26.703 |
| 7.429 | 26.715 |
| 7.43 | 26.727 |
| 7.431 | 26.739 |
| 7.432 | 26.751 |
| 7.433 | 26.763 |
| 7.434 | 26.776 |
| 7.435 | 26.788 |
| 7.436 | 26.8 |
| 7.437 | 26.812 |
| 7.438 | 26.824 |
| 7.439 | 26.836 |
| 7.44 | 26.848 |
| 7.441 | 26.86 |
| 7.442 | 26.872 |
| 7.443 | 26.884 |
| 7.444 | 26.896 |
| 7.445 | 26.909 |
| 7.446 | 26.921 |
| 7.447 | 26.933 |
| 7.448 | 26.945 |
| 7.449 | 26.957 |
| 7.45 | 26.969 |
| 7.451 | 26.981 |
| 7.452 | 26.994 |
| 7.453 | 27.006 |
| 7.454 | 27.018 |
| 7.455 | 27.03 |
| 7.456 | 27.042 |
| 7.457 | 27.054 |
| 7.458 | 27.066 |
| 7.459 | 27.079 |
| 7.46 | 27.091 |
| 7.461 | 27.103 |
| 7.462 | 27.115 |
| 7.463 | 27.127 |
| 7.464 | 27.14 |
| 7.465 | 27.152 |
| 7.466 | 27.164 |
| 7.467 | 27.176 |
| 7.468 | 27.188 |
| 7.469 | 27.2 |
| 7.47 | 27.213 |
| 7.471 | 27.225 |
| 7.472 | 27.237 |
| 7.473 | 27.249 |
| 7.474 | 27.262 |
| 7.475 | 27.274 |
| 7.476 | 27.286 |
| 7.477 | 27.298 |
| 7.478 | 27.31 |
| 7.479 | 27.323 |
| 7.48 | 27.335 |
| 7.481 | 27.347 |
| 7.482 | 27.359 |
| 7.483 | 27.372 |
| 7.484 | 27.384 |
| 7.485 | 27.396 |
| 7.486 | 27.408 |
| 7.487 | 27.421 |
| 7.488 | 27.433 |
| 7.489 | 27.445 |
| 7.49 | 27.457 |
| 7.491 | 27.47 |
| 7.492 | 27.482 |
| 7.493 | 27.494 |
| 7.494 | 27.506 |
| 7.495 | 27.519 |
| 7.496 | 27.531 |
| 7.497 | 27.543 |
| 7.498 | 27.556 |
| 7.499 | 27.568 |
| 7.5 | 27.58 |
| 7.501 | 27.593 |
| 7.502 | 27.605 |
| 7.503 | 27.617 |
| 7.504 | 27.63 |
| 7.505 | 27.642 |
| 7.506 | 27.654 |
| 7.507 | 27.667 |
| 7.508 | 27.679 |
| 7.509 | 27.691 |
| 7.51 | 27.704 |
| 7.511 | 27.716 |
| 7.512 | 27.728 |
| 7.513 | 27.741 |
| 7.514 | 27.753 |
| 7.515 | 27.765 |
| 7.516 | 27.778 |
| 7.517 | 27.79 |
| 7.518 | 27.802 |
| 7.519 | 27.815 |
| 7.52 | 27.827 |
| 7.521 | 27.84 |
| 7.522 | 27.852 |
| 7.523 | 27.864 |
| 7.524 | 27.877 |
| 7.525 | 27.889 |
| 7.526 | 27.902 |
| 7.527 | 27.914 |
| 7.528 | 27.926 |
| 7.529 | 27.939 |
| 7.53 | 27.951 |
| 7.531 | 27.964 |
| 7.532 | 27.976 |
| 7.533 | 27.988 |
| 7.534 | 28.001 |
| 7.535 | 28.013 |
| 7.536 | 28.026 |
| 7.537 | 28.038 |
| 7.538 | 28.05 |
| 7.539 | 28.063 |
| 7.54 | 28.075 |
| 7.541 | 28.088 |
| 7.542 | 28.1 |
| 7.543 | 28.113 |
| 7.544 | 28.125 |
| 7.545 | 28.138 |
| 7.546 | 28.15 |
| 7.547 | 28.163 |
| 7.548 | 28.175 |
| 7.549 | 28.188 |
| 7.55 | 28.2 |
| 7.551 | 28.212 |
| 7.552 | 28.225 |
| 7.553 | 28.238 |
| 7.554 | 28.25 |
| 7.555 | 28.262 |
| 7.556 | 28.275 |
| 7.557 | 28.288 |
| 7.558 | 28.3 |
| 7.559 | 28.312 |
| 7.56 | 28.325 |
| 7.561 | 28.338 |
| 7.562 | 28.35 |
| 7.563 | 28.363 |
| 7.564 | 28.375 |
| 7.565 | 28.388 |
| 7.566 | 28.4 |
| 7.567 | 28.413 |
| 7.568 | 28.425 |
| 7.569 | 28.438 |
| 7.57 | 28.45 |
| 7.571 | 28.463 |
| 7.572 | 28.476 |
| 7.573 | 28.488 |
| 7.574 | 28.501 |
| 7.575 | 28.513 |
| 7.576 | 28.526 |
| 7.577 | 28.538 |
| 7.578 | 28.551 |
| 7.579 | 28.564 |
| 7.58 | 28.576 |
| 7.581 | 28.589 |
| 7.582 | 28.601 |
| 7.583 | 28.614 |
| 7.584 | 28.626 |
| 7.585 | 28.639 |
| 7.586 | 28.652 |
| 7.587 | 28.664 |
| 7.588 | 28.677 |
| 7.589 | 28.69 |
| 7.59 | 28.702 |
| 7.591 | 28.715 |
| 7.592 | 28.727 |
| 7.593 | 28.74 |
| 7.594 | 28.753 |
| 7.595 | 28.765 |
| 7.596 | 28.778 |
| 7.597 | 28.791 |
| 7.598 | 28.803 |
| 7.599 | 28.816 |
| 7.6 | 28.829 |
| 7.601 | 28.841 |
| 7.602 | 28.854 |
| 7.603 | 28.867 |
| 7.604 | 28.879 |
| 7.605 | 28.892 |
| 7.606 | 28.905 |
| 7.607 | 28.917 |
| 7.608 | 28.93 |
| 7.609 | 28.943 |
| 7.61 | 28.955 |
| 7.611 | 28.968 |
| 7.612 | 28.981 |
| 7.613 | 28.994 |
| 7.614 | 29.006 |
| 7.615 | 29.019 |
| 7.616 | 29.032 |
| 7.617 | 29.044 |
| 7.618 | 29.057 |
| 7.619 | 29.07 |
| 7.62 | 29.082 |
| 7.621 | 29.095 |
| 7.622 | 29.108 |
| 7.623 | 29.121 |
| 7.624 | 29.134 |
| 7.625 | 29.146 |
| 7.626 | 29.159 |
| 7.627 | 29.172 |
| 7.628 | 29.184 |
| 7.629 | 29.197 |
| 7.63 | 29.21 |
| 7.631 | 29.223 |
| 7.632 | 29.236 |
| 7.633 | 29.248 |
| 7.634 | 29.261 |
| 7.635 | 29.274 |
| 7.636 | 29.287 |
| 7.637 | 29.3 |
| 7.638 | 29.312 |
| 7.639 | 29.325 |
| 7.64 | 29.338 |
| 7.641 | 29.351 |
| 7.642 | 29.364 |
| 7.643 | 29.376 |
| 7.644 | 29.389 |
| 7.645 | 29.402 |
| 7.646 | 29.415 |
| 7.647 | 29.428 |
| 7.648 | 29.44 |
| 7.649 | 29.453 |
| 7.65 | 29.466 |
| 7.651 | 29.479 |
| 7.652 | 29.492 |
| 7.653 | 29.505 |
| 7.654 | 29.518 |
| 7.655 | 29.53 |
| 7.656 | 29.543 |
| 7.657 | 29.556 |
| 7.658 | 29.569 |
| 7.659 | 29.582 |
| 7.66 | 29.595 |
| 7.661 | 29.608 |
| 7.662 | 29.62 |
| 7.663 | 29.633 |
| 7.664 | 29.646 |
| 7.665 | 29.659 |
| 7.666 | 29.672 |
| 7.667 | 29.685 |
| 7.668 | 29.698 |
| 7.669 | 29.711 |
| 7.67 | 29.724 |
| 7.671 | 29.737 |
| 7.672 | 29.75 |
| 7.673 | 29.762 |
| 7.674 | 29.775 |
| 7.675 | 29.788 |
| 7.676 | 29.801 |
| 7.677 | 29.814 |
| 7.678 | 29.827 |
| 7.679 | 29.84 |
| 7.68 | 29.853 |
| 7.681 | 29.866 |
| 7.682 | 29.879 |
| 7.683 | 29.892 |
| 7.684 | 29.905 |
| 7.685 | 29.918 |
| 7.686 | 29.931 |
| 7.687 | 29.944 |
| 7.688 | 29.957 |
| 7.689 | 29.97 |
| 7.69 | 29.983 |
| 7.691 | 29.996 |
| 7.692 | 30.009 |
| 7.693 | 30.022 |
| 7.694 | 30.035 |
| 7.695 | 30.048 |
| 7.696 | 30.061 |
| 7.697 | 30.074 |
| 7.698 | 30.087 |
| 7.699 | 30.1 |
| 7.7 | 30.113 |
| 7.701 | 30.126 |
| 7.702 | 30.139 |
| 7.703 | 30.152 |
| 7.704 | 30.165 |
| 7.705 | 30.178 |
| 7.706 | 30.191 |
| 7.707 | 30.204 |
| 7.708 | 30.217 |
| 7.709 | 30.23 |
| 7.71 | 30.243 |
| 7.711 | 30.256 |
| 7.712 | 30.269 |
| 7.713 | 30.282 |
| 7.714 | 30.296 |
| 7.715 | 30.308 |
| 7.716 | 30.322 |
| 7.717 | 30.335 |
| 7.718 | 30.348 |
| 7.719 | 30.361 |
| 7.72 | 30.374 |
| 7.721 | 30.387 |
| 7.722 | 30.4 |
| 7.723 | 30.413 |
| 7.724 | 30.426 |
| 7.725 | 30.44 |
| 7.726 | 30.453 |
| 7.727 | 30.466 |
| 7.728 | 30.479 |
| 7.729 | 30.492 |
| 7.73 | 30.505 |
| 7.731 | 30.518 |
| 7.732 | 30.532 |
| 7.733 | 30.545 |
| 7.734 | 30.558 |
| 7.735 | 30.571 |
| 7.736 | 30.584 |
| 7.737 | 30.597 |
| 7.738 | 30.61 |
| 7.739 | 30.624 |
| 7.74 | 30.637 |
| 7.741 | 30.65 |
| 7.742 | 30.663 |
| 7.743 | 30.676 |
| 7.744 | 30.69 |
| 7.745 | 30.703 |
| 7.746 | 30.716 |
| 7.747 | 30.729 |
| 7.748 | 30.742 |
| 7.749 | 30.755 |
| 7.75 | 30.769 |
| 7.751 | 30.782 |
| 7.752 | 30.795 |
| 7.753 | 30.808 |
| 7.754 | 30.822 |
| 7.755 | 30.835 |
| 7.756 | 30.848 |
| 7.757 | 30.861 |
| 7.758 | 30.874 |
| 7.759 | 30.888 |
| 7.76 | 30.901 |
| 7.761 | 30.914 |
| 7.762 | 30.928 |
| 7.763 | 30.941 |
| 7.764 | 30.954 |
| 7.765 | 30.967 |
| 7.766 | 30.98 |
| 7.767 | 30.994 |
| 7.768 | 31.007 |
| 7.769 | 31.02 |
| 7.77 | 31.034 |
| 7.771 | 31.047 |
| 7.772 | 31.06 |
| 7.773 | 31.074 |
| 7.774 | 31.087 |
| 7.775 | 31.1 |
| 7.776 | 31.113 |
| 7.777 | 31.127 |
| 7.778 | 31.14 |
| 7.779 | 31.153 |
| 7.78 | 31.167 |
| 7.781 | 31.18 |
| 7.782 | 31.193 |
| 7.783 | 31.207 |
| 7.784 | 31.22 |
| 7.785 | 31.233 |
| 7.786 | 31.247 |
| 7.787 | 31.26 |
| 7.788 | 31.273 |
| 7.789 | 31.287 |
| 7.79 | 31.3 |
| 7.791 | 31.314 |
| 7.792 | 31.327 |
| 7.793 | 31.34 |
| 7.794 | 31.354 |
| 7.795 | 31.367 |
| 7.796 | 31.38 |
| 7.797 | 31.394 |
| 7.798 | 31.407 |
| 7.799 | 31.421 |
| 7.8 | 31.434 |
| 7.801 | 31.447 |
| 7.802 | 31.461 |
| 7.803 | 31.474 |
| 7.804 | 31.488 |
| 7.805 | 31.501 |
| 7.806 | 31.514 |
| 7.807 | 31.528 |
| 7.808 | 31.541 |
| 7.809 | 31.555 |
| 7.81 | 31.568 |
| 7.811 | 31.582 |
| 7.812 | 31.595 |
| 7.813 | 31.608 |
| 7.814 | 31.622 |
| 7.815 | 31.635 |
| 7.816 | 31.649 |
| 7.817 | 31.662 |
| 7.818 | 31.676 |
| 7.819 | 31.689 |
| 7.82 | 31.703 |
| 7.821 | 31.716 |
| 7.822 | 31.73 |
| 7.823 | 31.743 |
| 7.824 | 31.757 |
| 7.825 | 31.77 |
| 7.826 | 31.784 |
| 7.827 | 31.797 |
| 7.828 | 31.811 |
| 7.829 | 31.824 |
| 7.83 | 31.838 |
| 7.831 | 31.851 |
| 7.832 | 31.865 |
| 7.833 | 31.878 |
| 7.834 | 31.892 |
| 7.835 | 31.905 |
| 7.836 | 31.919 |
| 7.837 | 31.932 |
| 7.838 | 31.946 |
| 7.839 | 31.96 |
| 7.84 | 31.973 |
| 7.841 | 31.987 |
| 7.842 | 32 |
| 7.843 | 32.014 |
| 7.844 | 32.027 |
| 7.845 | 32.041 |
| 7.846 | 32.054 |
| 7.847 | 32.068 |
| 7.848 | 32.082 |
| 7.849 | 32.095 |
| 7.85 | 32.109 |
| 7.851 | 32.123 |
| 7.852 | 32.136 |
| 7.853 | 32.15 |
| 7.854 | 32.163 |
| 7.855 | 32.177 |
| 7.856 | 32.19 |
| 7.857 | 32.204 |
| 7.858 | 32.218 |
| 7.859 | 32.231 |
| 7.86 | 32.245 |
| 7.861 | 32.259 |
| 7.862 | 32.272 |
| 7.863 | 32.286 |
| 7.864 | 32.3 |
| 7.865 | 32.313 |
| 7.866 | 32.327 |
| 7.867 | 32.341 |
| 7.868 | 32.354 |
| 7.869 | 32.368 |
| 7.87 | 32.382 |
| 7.871 | 32.395 |
| 7.872 | 32.409 |
| 7.873 | 32.423 |
| 7.874 | 32.436 |
| 7.875 | 32.45 |
| 7.876 | 32.464 |
| 7.877 | 32.477 |
| 7.878 | 32.491 |
| 7.879 | 32.505 |
| 7.88 | 32.519 |
| 7.881 | 32.532 |
| 7.882 | 32.546 |
| 7.883 | 32.56 |
| 7.884 | 32.573 |
| 7.885 | 32.587 |
| 7.886 | 32.601 |
| 7.887 | 32.615 |
| 7.888 | 32.628 |
| 7.889 | 32.642 |
| 7.89 | 32.656 |
| 7.891 | 32.67 |
| 7.892 | 32.683 |
| 7.893 | 32.697 |
| 7.894 | 32.711 |
| 7.895 | 32.725 |
| 7.896 | 32.738 |
| 7.897 | 32.752 |
| 7.898 | 32.766 |
| 7.899 | 32.78 |
| 7.9 | 32.794 |
| 7.901 | 32.807 |
| 7.902 | 32.821 |
| 7.903 | 32.835 |
| 7.904 | 32.849 |
| 7.905 | 32.863 |
| 7.906 | 32.876 |
| 7.907 | 32.89 |
| 7.908 | 32.904 |
| 7.909 | 32.918 |
| 7.91 | 32.932 |
| 7.911 | 32.946 |
| 7.912 | 32.959 |
| 7.913 | 32.973 |
| 7.914 | 32.987 |
| 7.915 | 33.001 |
| 7.916 | 33.015 |
| 7.917 | 33.029 |
| 7.918 | 33.042 |
| 7.919 | 33.056 |
| 7.92 | 33.07 |
| 7.921 | 33.084 |
| 7.922 | 33.098 |
| 7.923 | 33.112 |
| 7.924 | 33.126 |
| 7.925 | 33.14 |
| 7.926 | 33.154 |
| 7.927 | 33.167 |
| 7.928 | 33.181 |
| 7.929 | 33.195 |
| 7.93 | 33.209 |
| 7.931 | 33.223 |
| 7.932 | 33.237 |
| 7.933 | 33.251 |
| 7.934 | 33.265 |
| 7.935 | 33.279 |
| 7.936 | 33.293 |
| 7.937 | 33.307 |
| 7.938 | 33.321 |
| 7.939 | 33.334 |
| 7.94 | 33.348 |
| 7.941 | 33.362 |
| 7.942 | 33.376 |
| 7.943 | 33.39 |
| 7.944 | 33.404 |
| 7.945 | 33.418 |
| 7.946 | 33.432 |
| 7.947 | 33.446 |
| 7.948 | 33.46 |
| 7.949 | 33.474 |
| 7.95 | 33.488 |
| 7.951 | 33.502 |
| 7.952 | 33.516 |
| 7.953 | 33.53 |
| 7.954 | 33.544 |
| 7.955 | 33.558 |
| 7.956 | 33.572 |
| 7.957 | 33.586 |
| 7.958 | 33.6 |
| 7.959 | 33.614 |
| 7.96 | 33.628 |
| 7.961 | 33.642 |
| 7.962 | 33.656 |
| 7.963 | 33.67 |
| 7.964 | 33.684 |
| 7.965 | 33.698 |
| 7.966 | 33.713 |
| 7.967 | 33.727 |
| 7.968 | 33.741 |
| 7.969 | 33.755 |
| 7.97 | 33.769 |
| 7.971 | 33.783 |
| 7.972 | 33.797 |
| 7.973 | 33.811 |
| 7.974 | 33.825 |
| 7.975 | 33.839 |
| 7.976 | 33.853 |
| 7.977 | 33.868 |
| 7.978 | 33.882 |
| 7.979 | 33.896 |
| 7.98 | 33.91 |
| 7.981 | 33.924 |
| 7.982 | 33.938 |
| 7.983 | 33.952 |
| 7.984 | 33.966 |
| 7.985 | 33.98 |
| 7.986 | 33.994 |
| 7.987 | 34.009 |
| 7.988 | 34.023 |
| 7.989 | 34.037 |
| 7.99 | 34.051 |
| 7.991 | 34.065 |
| 7.992 | 34.08 |
| 7.993 | 34.094 |
| 7.994 | 34.108 |
| 7.995 | 34.122 |
| 7.996 | 34.136 |
| 7.997 | 34.15 |
| 7.998 | 34.164 |
| 7.999 | 34.179 |
| 8.0 | 34.193 |